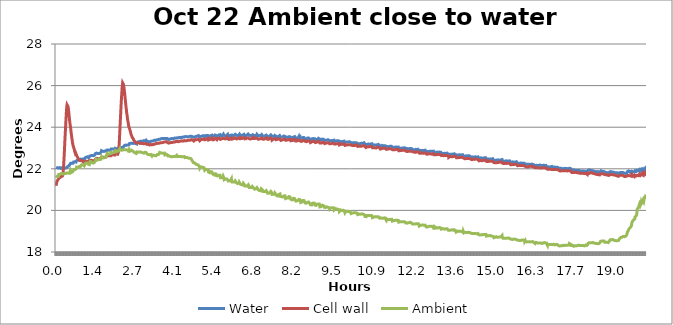
| Category | Water | Cell wall | Ambient |
|---|---|---|---|
| 0.0015688980555555556 | 22.075 | 21.183 | 21.584 |
| 0.00782350138888889 | 22.07 | 21.248 | 21.584 |
| 0.014582213333333333 | 22.067 | 21.281 | 21.612 |
| 0.021356179999999975 | 22.062 | 21.346 | 21.612 |
| 0.02819274388888889 | 22.073 | 21.369 | 21.623 |
| 0.035027722222222224 | 22.047 | 21.402 | 21.638 |
| 0.041801709444444446 | 22.049 | 21.423 | 21.633 |
| 0.048545142500000006 | 22.049 | 21.423 | 21.641 |
| 0.05536494166666667 | 22.062 | 21.431 | 21.656 |
| 0.06215420833333333 | 22.056 | 21.473 | 21.612 |
| 0.06900455694444445 | 22.043 | 21.491 | 21.628 |
| 0.07573269305555556 | 22.044 | 21.509 | 21.631 |
| 0.08253722083333334 | 22.035 | 21.504 | 21.654 |
| 0.08931122805555555 | 22.04 | 21.52 | 21.727 |
| 0.09613239083333334 | 22.046 | 21.537 | 21.683 |
| 0.1029216488888889 | 22.064 | 21.551 | 21.714 |
| 0.10975673166666666 | 22.045 | 21.539 | 21.685 |
| 0.11651543166666667 | 22.054 | 21.546 | 21.716 |
| 0.12330468083333335 | 22.058 | 21.564 | 21.706 |
| 0.13009392916666668 | 22.055 | 21.566 | 21.727 |
| 0.13691374027777778 | 22.064 | 21.588 | 21.748 |
| 0.14376409777777777 | 22.06 | 21.569 | 21.75 |
| 0.15049225388888887 | 22.062 | 21.591 | 21.761 |
| 0.1572968027777775 | 22.046 | 21.595 | 21.773 |
| 0.16414852138888888 | 22.02 | 21.604 | 21.768 |
| 0.17093777444444444 | 22.041 | 21.618 | 21.771 |
| 0.17771176527777777 | 22.038 | 21.626 | 21.768 |
| 0.1844551841666664 | 22.033 | 21.624 | 21.768 |
| 0.19130553527777777 | 22.032 | 21.632 | 21.786 |
| 0.19807951694444417 | 22.05 | 21.626 | 21.749 |
| 0.2049146075 | 22.05 | 21.615 | 21.801 |
| 0.21167330194444442 | 22.04 | 21.654 | 21.77 |
| 0.21849310027777777 | 22.021 | 21.653 | 21.744 |
| 0.22525180277777776 | 22.031 | 21.68 | 21.778 |
| 0.23207299861111083 | 22.018 | 21.72 | 21.765 |
| 0.23890808166666666 | 22.013 | 21.784 | 21.757 |
| 0.24569733166666638 | 22.008 | 21.885 | 21.754 |
| 0.25245603694444446 | 22.026 | 22.037 | 21.749 |
| 0.2592605647222222 | 22.038 | 22.185 | 21.765 |
| 0.26609564138888886 | 22.036 | 22.364 | 21.762 |
| 0.2728696216666664 | 22.036 | 22.512 | 21.754 |
| 0.2796894411111111 | 22.026 | 22.717 | 21.765 |
| 0.28649396694444446 | 22.029 | 22.913 | 21.759 |
| 0.29328331416666664 | 22.026 | 23.127 | 21.77 |
| 0.30007385166666667 | 22.031 | 23.334 | 21.759 |
| 0.30686310527777777 | 22.047 | 23.531 | 21.785 |
| 0.3136676241666667 | 22.049 | 23.709 | 21.772 |
| 0.32050271027777777 | 22.042 | 23.893 | 21.765 |
| 0.32726142555555554 | 22.042 | 24.082 | 21.77 |
| 0.33406593888888886 | 22.034 | 24.268 | 21.772 |
| 0.3408857527777778 | 22.039 | 24.439 | 21.775 |
| 0.34762917444444447 | 22.067 | 24.617 | 21.798 |
| 0.35441843083333335 | 22.07 | 24.783 | 21.795 |
| 0.36126878972222226 | 22.07 | 24.919 | 21.808 |
| 0.3680288683333333 | 22.06 | 25.005 | 21.793 |
| 0.37483339777777774 | 22.091 | 25.079 | 21.803 |
| 0.3816379294444444 | 22.083 | 25.125 | 21.819 |
| 0.38841192611111114 | 22.096 | 25.107 | 21.811 |
| 0.3952317125 | 22.104 | 25.082 | 21.798 |
| 0.40195987027777774 | 22.111 | 25.051 | 21.785 |
| 0.4088102191666667 | 22.106 | 24.995 | 21.788 |
| 0.41561475194444447 | 22.116 | 24.921 | 21.793 |
| 0.422388725 | 22.147 | 24.86 | 21.801 |
| 0.4292085408333333 | 22.139 | 24.76 | 21.816 |
| 0.4359838988888889 | 22.129 | 24.681 | 21.814 |
| 0.44280370694444443 | 22.157 | 24.582 | 21.79 |
| 0.44957768388888886 | 22.157 | 24.495 | 21.821 |
| 0.45639748305555555 | 22.16 | 24.398 | 21.785 |
| 0.4631714613888889 | 22.165 | 24.309 | 21.801 |
| 0.46999126305555555 | 22.165 | 24.227 | 21.78 |
| 0.47676524111111107 | 22.217 | 24.185 | 21.862 |
| 0.4836003294444444 | 22.209 | 24.09 | 21.872 |
| 0.4903743013888889 | 22.265 | 24.032 | 21.93 |
| 0.49714827777777776 | 22.268 | 23.963 | 21.932 |
| 0.5039694702777778 | 22.275 | 23.866 | 21.917 |
| 0.5107740016666666 | 22.269 | 23.773 | 21.932 |
| 0.5175479813888889 | 22.253 | 23.69 | 21.898 |
| 0.5243372427777778 | 22.235 | 23.62 | 21.828 |
| 0.5311723083333333 | 22.256 | 23.557 | 21.843 |
| 0.5379768363888889 | 22.262 | 23.48 | 21.805 |
| 0.5447966475 | 22.233 | 23.422 | 21.81 |
| 0.5515706205555556 | 22.248 | 23.366 | 21.823 |
| 0.5583446075 | 22.24 | 23.272 | 21.825 |
| 0.5651338605555556 | 22.278 | 23.231 | 21.859 |
| 0.5719550447222223 | 22.258 | 23.182 | 21.853 |
| 0.5787595808333333 | 22.263 | 23.121 | 21.864 |
| 0.5855793852777778 | 22.292 | 23.095 | 21.903 |
| 0.5923228105555556 | 22.293 | 23.073 | 21.914 |
| 0.5991120758333334 | 22.329 | 23.039 | 21.949 |
| 0.6059318708333333 | 22.343 | 23.026 | 21.933 |
| 0.6127822222222222 | 22.335 | 22.964 | 21.967 |
| 0.6195561980555556 | 22.343 | 22.947 | 21.98 |
| 0.6263301805555556 | 22.34 | 22.908 | 21.982 |
| 0.6331347024999999 | 22.345 | 22.839 | 21.985 |
| 0.6399545183333333 | 22.335 | 22.829 | 21.98 |
| 0.6466993202777778 | 22.338 | 22.799 | 21.967 |
| 0.6535038536111111 | 22.335 | 22.76 | 21.97 |
| 0.6603389305555556 | 22.338 | 22.719 | 21.972 |
| 0.6671281891666667 | 22.348 | 22.712 | 21.98 |
| 0.6738716155555556 | 22.332 | 22.68 | 21.969 |
| 0.6806914233333334 | 22.323 | 22.641 | 21.945 |
| 0.6875112363888889 | 22.326 | 22.616 | 21.971 |
| 0.6943157755555556 | 22.382 | 22.668 | 22.027 |
| 0.7010897277777778 | 22.416 | 22.652 | 22.084 |
| 0.7078956550000001 | 22.4 | 22.619 | 22.077 |
| 0.7146696319444444 | 22.405 | 22.583 | 22.069 |
| 0.7215047113888888 | 22.41 | 22.596 | 22.079 |
| 0.7282787122222222 | 22.408 | 22.568 | 22.082 |
| 0.7350526725 | 22.418 | 22.547 | 22.066 |
| 0.7418724572222223 | 22.413 | 22.527 | 22.071 |
| 0.7486617244444445 | 22.41 | 22.519 | 22.087 |
| 0.7554509880555556 | 22.408 | 22.501 | 22.077 |
| 0.7622707813888889 | 22.405 | 22.486 | 22.087 |
| 0.7690447647222223 | 22.413 | 22.46 | 22.084 |
| 0.7758659566666667 | 22.426 | 22.448 | 22.1 |
| 0.7826399244444445 | 22.408 | 22.471 | 22.105 |
| 0.7894597311111111 | 22.403 | 22.438 | 22.118 |
| 0.7962795433333333 | 22.421 | 22.407 | 22.089 |
| 0.803022975 | 22.408 | 22.42 | 22.136 |
| 0.8097969466666667 | 22.387 | 22.4 | 22.087 |
| 0.8166778647222223 | 22.401 | 22.368 | 22.097 |
| 0.8234823705555555 | 22.395 | 22.38 | 22.081 |
| 0.8302563627777777 | 22.387 | 22.36 | 22.083 |
| 0.8370608897222223 | 22.439 | 22.394 | 22.141 |
| 0.8438654097222221 | 22.465 | 22.413 | 22.175 |
| 0.8506407724999999 | 22.476 | 22.416 | 22.188 |
| 0.8574147469444444 | 22.46 | 22.388 | 22.165 |
| 0.8642040255555556 | 22.478 | 22.403 | 22.173 |
| 0.8710544063888889 | 22.488 | 22.383 | 22.188 |
| 0.8778894580555555 | 22.476 | 22.398 | 22.201 |
| 0.884648166388889 | 22.463 | 22.362 | 22.185 |
| 0.8914221302777778 | 22.481 | 22.357 | 22.201 |
| 0.8982572041666667 | 22.473 | 22.36 | 22.188 |
| 0.9050311852777778 | 22.465 | 22.36 | 22.18 |
| 0.9118357147222222 | 22.47 | 22.36 | 22.193 |
| 0.9186110891666667 | 22.488 | 22.352 | 22.188 |
| 0.9253850527777778 | 22.47 | 22.344 | 22.188 |
| 0.9322048619444445 | 22.483 | 22.344 | 22.19 |
| 0.9389635783333333 | 22.478 | 22.329 | 22.198 |
| 0.9457833697222222 | 22.46 | 22.341 | 22.172 |
| 0.95260321 | 22.474 | 22.328 | 22.151 |
| 0.9594382613888889 | 22.469 | 22.307 | 22.141 |
| 0.9661816813888889 | 22.461 | 22.321 | 22.128 |
| 0.9730167616666666 | 22.47 | 22.335 | 22.144 |
| 0.9797907330555555 | 22.472 | 22.318 | 22.177 |
| 0.9865660986111111 | 22.482 | 22.323 | 22.18 |
| 0.9933859147222222 | 22.53 | 22.357 | 22.252 |
| 1.0007695252777777 | 22.548 | 22.366 | 22.261 |
| 1.0069796880555555 | 22.559 | 22.379 | 22.273 |
| 1.0137536694444444 | 22.553 | 22.376 | 22.273 |
| 1.0205276491666666 | 22.559 | 22.381 | 22.278 |
| 1.027316919722222 | 22.551 | 22.356 | 22.266 |
| 1.0341214355555555 | 22.564 | 22.364 | 22.284 |
| 1.0409412422222222 | 22.559 | 22.351 | 22.271 |
| 1.0477915833333333 | 22.553 | 22.364 | 22.258 |
| 1.054536411111111 | 22.553 | 22.364 | 22.286 |
| 1.0613714819444444 | 22.553 | 22.369 | 22.268 |
| 1.0681454594444444 | 22.574 | 22.346 | 22.284 |
| 1.0749958227777778 | 22.579 | 22.351 | 22.273 |
| 1.0817850691666666 | 22.567 | 22.349 | 22.289 |
| 1.0885743252777778 | 22.565 | 22.326 | 22.234 |
| 1.095348306388889 | 22.545 | 22.352 | 22.224 |
| 1.1021528366666666 | 22.533 | 22.342 | 22.203 |
| 1.1089268027777777 | 22.529 | 22.312 | 22.219 |
| 1.1157021827777778 | 22.546 | 22.34 | 22.206 |
| 1.1225219744444443 | 22.531 | 22.32 | 22.19 |
| 1.129341791388889 | 22.552 | 22.333 | 22.19 |
| 1.1361157586111112 | 22.544 | 22.333 | 22.203 |
| 1.142905021388889 | 22.562 | 22.355 | 22.25 |
| 1.1496790024999972 | 22.613 | 22.376 | 22.307 |
| 1.1564682569444444 | 22.657 | 22.411 | 22.333 |
| 1.1633033247222222 | 22.647 | 22.398 | 22.359 |
| 1.1700773027777778 | 22.647 | 22.406 | 22.341 |
| 1.1769276594444444 | 22.647 | 22.395 | 22.321 |
| 1.1837169147222222 | 22.647 | 22.413 | 22.341 |
| 1.1905228266666668 | 22.631 | 22.411 | 22.356 |
| 1.1972968138888862 | 22.652 | 22.411 | 22.338 |
| 1.2040555141666667 | 22.659 | 22.393 | 22.341 |
| 1.2108447916666667 | 22.667 | 22.393 | 22.333 |
| 1.217679843888889 | 22.658 | 22.389 | 22.331 |
| 1.224484366388889 | 22.646 | 22.4 | 22.305 |
| 1.231319474722222 | 22.642 | 22.381 | 22.286 |
| 1.2381087097222223 | 22.635 | 22.39 | 22.278 |
| 1.24489797 | 22.629 | 22.382 | 22.258 |
| 1.2516719377777752 | 22.637 | 22.382 | 22.261 |
| 1.2584473013888888 | 22.64 | 22.385 | 22.266 |
| 1.265236555 | 22.632 | 22.4 | 22.276 |
| 1.2720869191666666 | 22.629 | 22.37 | 22.278 |
| 1.2788608852777779 | 22.657 | 22.388 | 22.266 |
| 1.2856654252777777 | 22.635 | 22.385 | 22.291 |
| 1.2924393972222221 | 22.637 | 22.4 | 22.289 |
| 1.2992286588888888 | 22.647 | 22.385 | 22.296 |
| 1.3060790072222221 | 22.635 | 22.377 | 22.286 |
| 1.3128529816666665 | 22.655 | 22.38 | 22.314 |
| 1.3196422438888888 | 22.652 | 22.395 | 22.281 |
| 1.3264634291666668 | 22.65 | 22.398 | 22.294 |
| 1.3332374180555555 | 22.673 | 22.415 | 22.325 |
| 1.3400266677777777 | 22.729 | 22.433 | 22.4 |
| 1.3468159219444444 | 22.719 | 22.464 | 22.411 |
| 1.3536204777777752 | 22.748 | 22.474 | 22.429 |
| 1.360424986111111 | 22.747 | 22.486 | 22.447 |
| 1.3672295063888888 | 22.742 | 22.478 | 22.465 |
| 1.374003474722222 | 22.752 | 22.478 | 22.495 |
| 1.3808538380555557 | 22.759 | 22.487 | 22.46 |
| 1.3876583636111084 | 22.745 | 22.505 | 22.457 |
| 1.3944642833333334 | 22.753 | 22.464 | 22.433 |
| 1.4012382591666668 | 22.73 | 22.476 | 22.415 |
| 1.408012251111111 | 22.74 | 22.476 | 22.43 |
| 1.4148344780555555 | 22.72 | 22.47 | 22.418 |
| 1.4216212966666666 | 22.738 | 22.478 | 22.425 |
| 1.4284258255555555 | 22.725 | 22.486 | 22.433 |
| 1.4351998099999999 | 22.74 | 22.468 | 22.443 |
| 1.4420043347222196 | 22.743 | 22.496 | 22.448 |
| 1.4487783447222222 | 22.743 | 22.465 | 22.443 |
| 1.4555536699999974 | 22.748 | 22.47 | 22.448 |
| 1.4624193044444445 | 22.735 | 22.483 | 22.438 |
| 1.4691780169444446 | 22.735 | 22.483 | 22.451 |
| 1.4760283608333333 | 22.766 | 22.468 | 22.456 |
| 1.482756513888886 | 22.751 | 22.463 | 22.451 |
| 1.4895763208333335 | 22.748 | 22.481 | 22.446 |
| 1.49636558 | 22.766 | 22.473 | 22.451 |
| 1.503170106388889 | 22.748 | 22.493 | 22.446 |
| 1.5099441594444418 | 22.763 | 22.473 | 22.446 |
| 1.5168097049999973 | 22.746 | 22.473 | 22.456 |
| 1.523583688888889 | 22.753 | 22.488 | 22.461 |
| 1.5303896222222195 | 22.782 | 22.505 | 22.5 |
| 1.5371483013888887 | 22.809 | 22.52 | 22.529 |
| 1.5439375638888888 | 22.836 | 22.542 | 22.555 |
| 1.550772642222222 | 22.871 | 22.564 | 22.583 |
| 1.5575771747222222 | 22.864 | 22.572 | 22.571 |
| 1.564351153611111 | 22.846 | 22.584 | 22.583 |
| 1.571125123611111 | 22.824 | 22.555 | 22.526 |
| 1.5779143736111083 | 22.843 | 22.555 | 22.519 |
| 1.5847647394444417 | 22.834 | 22.548 | 22.508 |
| 1.5914942797222196 | 22.839 | 22.553 | 22.526 |
| 1.5982987994444418 | 22.836 | 22.556 | 22.518 |
| 1.6051186175 | 22.846 | 22.574 | 22.513 |
| 1.6119078608333333 | 22.828 | 22.559 | 22.521 |
| 1.6187582363888888 | 22.839 | 22.546 | 22.529 |
| 1.6254558280555553 | 22.836 | 22.553 | 22.529 |
| 1.6323367380555556 | 22.836 | 22.556 | 22.531 |
| 1.6391107030555556 | 22.839 | 22.566 | 22.544 |
| 1.6458999597222221 | 22.818 | 22.569 | 22.541 |
| 1.6527350522222224 | 22.821 | 22.551 | 22.536 |
| 1.6595395669444444 | 22.836 | 22.556 | 22.526 |
| 1.666314932777775 | 22.821 | 22.553 | 22.549 |
| 1.6730889033333307 | 22.857 | 22.566 | 22.546 |
| 1.679862885 | 22.844 | 22.551 | 22.559 |
| 1.6866979702777778 | 22.826 | 22.576 | 22.534 |
| 1.6934719411111083 | 22.851 | 22.559 | 22.559 |
| 1.7003528541666666 | 22.836 | 22.569 | 22.569 |
| 1.7070810069444444 | 22.834 | 22.564 | 22.595 |
| 1.713931355 | 22.845 | 22.568 | 22.603 |
| 1.7207053402777779 | 22.858 | 22.578 | 22.611 |
| 1.7275098711111083 | 22.894 | 22.608 | 22.675 |
| 1.7342852333333334 | 22.903 | 22.612 | 22.694 |
| 1.7410592077777751 | 22.916 | 22.643 | 22.712 |
| 1.7478637358333307 | 22.926 | 22.656 | 22.735 |
| 1.7546377144444445 | 22.907 | 22.635 | 22.717 |
| 1.7614422413888888 | 22.906 | 22.639 | 22.693 |
| 1.7682467791666667 | 22.904 | 22.626 | 22.693 |
| 1.7750360263888887 | 22.906 | 22.634 | 22.698 |
| 1.7818863780555554 | 22.906 | 22.634 | 22.711 |
| 1.7886757355555556 | 22.891 | 22.636 | 22.703 |
| 1.7954954569444446 | 22.909 | 22.634 | 22.706 |
| 1.8022709058333306 | 22.901 | 22.626 | 22.688 |
| 1.8090295291666667 | 22.894 | 22.636 | 22.691 |
| 1.8158034922222221 | 22.891 | 22.621 | 22.701 |
| 1.8226232841666665 | 22.899 | 22.624 | 22.706 |
| 1.8294889358333333 | 22.896 | 22.621 | 22.716 |
| 1.8362170794444417 | 22.888 | 22.624 | 22.701 |
| 1.8431132527777776 | 22.896 | 22.624 | 22.708 |
| 1.8498566891666666 | 22.899 | 22.619 | 22.706 |
| 1.8566306583333332 | 22.901 | 22.631 | 22.719 |
| 1.863404638888889 | 22.899 | 22.624 | 22.701 |
| 1.870241106111111 | 22.9 | 22.623 | 22.734 |
| 1.8770150858333332 | 22.953 | 22.673 | 22.787 |
| 1.8838348908333307 | 22.95 | 22.68 | 22.818 |
| 1.8906088780555557 | 22.986 | 22.694 | 22.831 |
| 1.8974134091666666 | 22.974 | 22.686 | 22.833 |
| 1.9042179269444444 | 22.946 | 22.69 | 22.776 |
| 1.9110224883333333 | 22.941 | 22.666 | 22.779 |
| 1.9177658941666667 | 22.948 | 22.661 | 22.766 |
| 1.9245704202777778 | 22.956 | 22.673 | 22.779 |
| 1.9314054911111112 | 22.936 | 22.673 | 22.781 |
| 1.9381808530555558 | 22.933 | 22.679 | 22.776 |
| 1.9449701169444442 | 22.938 | 22.661 | 22.779 |
| 1.9517746413888888 | 22.954 | 22.668 | 22.804 |
| 1.9585486247222221 | 22.948 | 22.684 | 22.779 |
| 1.9653989730555557 | 22.926 | 22.666 | 22.791 |
| 1.972172948611111 | 22.931 | 22.651 | 22.789 |
| 1.978977531111111 | 22.926 | 22.681 | 22.784 |
| 1.9857972797222223 | 22.928 | 22.658 | 22.802 |
| 1.9926018249999973 | 22.918 | 22.676 | 22.802 |
| 1.999391066111111 | 22.926 | 22.663 | 22.807 |
| 2.0061969919444445 | 22.919 | 22.66 | 22.766 |
| 2.0130015186111083 | 22.949 | 22.693 | 22.813 |
| 2.0197602119444444 | 22.984 | 22.732 | 22.867 |
| 2.026534192777775 | 22.998 | 22.721 | 22.904 |
| 2.0333387283333306 | 23.002 | 22.731 | 22.88 |
| 2.0400821525 | 22.991 | 22.73 | 22.842 |
| 2.046963056666667 | 22.983 | 22.716 | 22.836 |
| 2.0537370325 | 22.983 | 22.695 | 22.816 |
| 2.0605415774999973 | 22.955 | 22.708 | 22.811 |
| 2.067346096111111 | 22.97 | 22.721 | 22.841 |
| 2.0741367519444442 | 22.975 | 22.713 | 22.831 |
| 2.080895486388889 | 22.975 | 22.711 | 22.841 |
| 2.0877305169444416 | 22.983 | 22.711 | 22.846 |
| 2.0945350419444417 | 22.952 | 22.718 | 22.864 |
| 2.1013395780555526 | 22.978 | 22.698 | 22.862 |
| 2.1081135605555557 | 22.96 | 22.705 | 22.867 |
| 2.1149333536111112 | 22.957 | 22.703 | 22.844 |
| 2.1216920594444444 | 22.96 | 22.726 | 22.857 |
| 2.1285118699999974 | 22.96 | 22.795 | 22.846 |
| 2.135331668055553 | 22.96 | 22.836 | 22.857 |
| 2.142091763611111 | 22.947 | 22.953 | 22.844 |
| 2.1489268397222197 | 22.947 | 23.065 | 22.851 |
| 2.1557313674999974 | 22.955 | 23.236 | 22.859 |
| 2.162520618611111 | 22.945 | 23.41 | 22.879 |
| 2.169309871388886 | 23.022 | 23.625 | 22.947 |
| 2.1760991402777776 | 23.006 | 23.82 | 22.883 |
| 2.182888400555553 | 23.023 | 24.017 | 22.952 |
| 2.1897081808333336 | 23.016 | 24.231 | 22.94 |
| 2.19645162 | 23.017 | 24.424 | 22.901 |
| 2.203378344722222 | 23.028 | 24.621 | 22.888 |
| 2.2101231575 | 23.017 | 24.812 | 22.899 |
| 2.2168665880555554 | 23.007 | 25.003 | 22.901 |
| 2.223686393611111 | 23.033 | 25.197 | 22.911 |
| 2.2304603730555557 | 23.023 | 25.355 | 22.899 |
| 2.237295446944444 | 23.012 | 25.521 | 22.894 |
| 2.2440541599999975 | 23.012 | 25.674 | 22.904 |
| 2.2508434116666667 | 23.025 | 25.843 | 22.911 |
| 2.2576326769444446 | 23.023 | 25.97 | 22.909 |
| 2.2644524605555554 | 23.04 | 26.047 | 22.914 |
| 2.2712722724999974 | 23.023 | 26.134 | 22.909 |
| 2.2781073491666666 | 23.04 | 26.123 | 22.904 |
| 2.2848827238888862 | 23.033 | 26.141 | 22.911 |
| 2.2916108594444444 | 23.038 | 26.093 | 22.909 |
| 2.2984459411111082 | 23.066 | 26.065 | 22.909 |
| 2.3052657436111113 | 23.04 | 26.006 | 22.899 |
| 2.312039726111111 | 23.065 | 25.949 | 22.927 |
| 2.318844263888889 | 23.08 | 25.88 | 22.92 |
| 2.325618239166667 | 23.113 | 25.82 | 22.915 |
| 2.3324380444444417 | 23.144 | 25.72 | 22.939 |
| 2.339212034444442 | 23.129 | 25.655 | 22.874 |
| 2.3460179283333336 | 23.134 | 25.543 | 22.872 |
| 2.352791915 | 23.123 | 25.451 | 22.908 |
| 2.3596270833333306 | 23.129 | 25.336 | 22.915 |
| 2.3664926261111114 | 23.139 | 25.27 | 22.908 |
| 2.3732207741666667 | 23.134 | 25.165 | 22.897 |
| 2.3799947711111082 | 23.139 | 25.076 | 22.9 |
| 2.386768728888889 | 23.144 | 24.977 | 22.913 |
| 2.3936038063888887 | 23.149 | 24.887 | 22.918 |
| 2.400408333888889 | 23.146 | 24.834 | 22.92 |
| 2.407182312777775 | 23.136 | 24.721 | 22.923 |
| 2.4140035125 | 23.149 | 24.658 | 22.918 |
| 2.420777488611111 | 23.149 | 24.599 | 22.91 |
| 2.427582009166664 | 23.151 | 24.522 | 22.918 |
| 2.4343712655555554 | 23.146 | 24.453 | 22.902 |
| 2.441221621388889 | 23.146 | 24.374 | 22.892 |
| 2.4479956958333333 | 23.146 | 24.321 | 22.9 |
| 2.4548001372222195 | 23.144 | 24.26 | 22.88 |
| 2.4615588380555526 | 23.167 | 24.206 | 22.872 |
| 2.468409192222222 | 23.168 | 24.155 | 22.884 |
| 2.4751984480555556 | 23.164 | 24.087 | 22.859 |
| 2.481943261666664 | 23.185 | 24.06 | 22.887 |
| 2.4887630644444445 | 23.152 | 23.992 | 22.789 |
| 2.495537052222222 | 23.18 | 23.983 | 22.859 |
| 2.5023721227777775 | 23.213 | 23.964 | 22.917 |
| 2.509161376388886 | 23.222 | 23.927 | 22.891 |
| 2.5159353488888887 | 23.212 | 23.893 | 22.886 |
| 2.522770432499997 | 23.24 | 23.845 | 22.876 |
| 2.5295749761111086 | 23.219 | 23.822 | 22.86 |
| 2.536333667222219 | 23.227 | 23.789 | 22.883 |
| 2.543107653888889 | 23.229 | 23.751 | 22.848 |
| 2.5499732863888886 | 23.227 | 23.707 | 22.853 |
| 2.5567333602777778 | 23.242 | 23.687 | 22.886 |
| 2.5635684433333306 | 23.214 | 23.638 | 22.899 |
| 2.5703424261111083 | 23.214 | 23.638 | 22.896 |
| 2.5771316825 | 23.234 | 23.6 | 22.886 |
| 2.5839056605555557 | 23.229 | 23.567 | 22.868 |
| 2.590710195277778 | 23.237 | 23.541 | 22.878 |
| 2.597484158888886 | 23.24 | 23.523 | 22.881 |
| 2.604319243055553 | 23.234 | 23.5 | 22.878 |
| 2.611108494722222 | 23.217 | 23.483 | 22.86 |
| 2.6179588394444444 | 23.222 | 23.46 | 22.86 |
| 2.6247189358333336 | 23.219 | 23.47 | 22.86 |
| 2.6315234697222194 | 23.222 | 23.447 | 22.855 |
| 2.6382975405555555 | 23.217 | 23.419 | 22.832 |
| 2.6450714269444418 | 23.234 | 23.391 | 22.825 |
| 2.651891222777775 | 23.234 | 23.398 | 22.802 |
| 2.658711029166664 | 23.219 | 23.391 | 22.817 |
| 2.6655003002777775 | 23.232 | 23.365 | 22.802 |
| 2.672274261111111 | 23.242 | 23.342 | 22.791 |
| 2.679094068888889 | 23.234 | 23.327 | 22.802 |
| 2.6858541622222196 | 23.24 | 23.304 | 22.779 |
| 2.6927197855555556 | 23.227 | 23.317 | 22.769 |
| 2.6994937691666667 | 23.233 | 23.291 | 22.74 |
| 2.706252467777775 | 23.223 | 23.277 | 22.763 |
| 2.7131028269444446 | 23.216 | 23.263 | 22.735 |
| 2.7198768141666667 | 23.228 | 23.259 | 22.743 |
| 2.726681423611111 | 23.203 | 23.274 | 22.732 |
| 2.733455307222222 | 23.238 | 23.253 | 22.74 |
| 2.7402140147222194 | 23.208 | 23.241 | 22.734 |
| 2.747049093888886 | 23.196 | 23.249 | 22.765 |
| 2.7538702847222223 | 23.267 | 23.275 | 22.809 |
| 2.760674812777778 | 23.251 | 23.255 | 22.809 |
| 2.7674487980555527 | 23.22 | 23.238 | 22.773 |
| 2.7742227755555557 | 23.291 | 23.263 | 22.823 |
| 2.7810273038888886 | 23.257 | 23.242 | 22.776 |
| 2.787862385 | 23.286 | 23.24 | 22.792 |
| 2.7946363566666665 | 23.294 | 23.26 | 22.792 |
| 2.8014103400000003 | 23.281 | 23.245 | 22.777 |
| 2.808260693888889 | 23.292 | 23.239 | 22.823 |
| 2.815034676666667 | 23.302 | 23.259 | 22.813 |
| 2.821869751111111 | 23.312 | 23.252 | 22.818 |
| 2.8286146311111113 | 23.315 | 23.254 | 22.811 |
| 2.8353885463888893 | 23.301 | 23.247 | 22.81 |
| 2.842254164444445 | 23.285 | 23.229 | 22.803 |
| 2.84902815 | 23.313 | 23.221 | 22.805 |
| 2.8558174016666666 | 23.315 | 23.229 | 22.793 |
| 2.8626830386111113 | 23.3 | 23.221 | 22.808 |
| 2.869426457222222 | 23.315 | 23.234 | 22.823 |
| 2.8762004411111115 | 23.325 | 23.231 | 22.813 |
| 2.8830507944444443 | 23.317 | 23.226 | 22.808 |
| 2.8898247772222225 | 23.323 | 23.234 | 22.808 |
| 2.896630694166667 | 23.325 | 23.224 | 22.816 |
| 2.9034046725000002 | 23.31 | 23.224 | 22.806 |
| 2.910193925833333 | 23.325 | 23.231 | 22.79 |
| 2.9169679841666665 | 23.328 | 23.221 | 22.788 |
| 2.9237877052777774 | 23.328 | 23.219 | 22.798 |
| 2.9305616825 | 23.33 | 23.206 | 22.788 |
| 2.9373662141666665 | 23.34 | 23.219 | 22.783 |
| 2.944216556666667 | 23.348 | 23.216 | 22.795 |
| 2.9509905575 | 23.328 | 23.208 | 22.775 |
| 2.9577950730555553 | 23.317 | 23.208 | 22.775 |
| 2.96461626 | 23.338 | 23.211 | 22.788 |
| 2.9713749830555556 | 23.33 | 23.226 | 22.8 |
| 2.9781336683333333 | 23.328 | 23.224 | 22.798 |
| 2.9849840461111112 | 23.353 | 23.208 | 22.744 |
| 2.991758006111111 | 23.343 | 23.211 | 22.757 |
| 2.998562535277778 | 23.353 | 23.214 | 22.752 |
| 3.0053976152777775 | 23.323 | 23.229 | 22.785 |
| 3.0121410324999998 | 23.353 | 23.221 | 22.788 |
| 3.018930319722222 | 23.366 | 23.208 | 22.785 |
| 3.0257654016666664 | 23.338 | 23.208 | 22.795 |
| 3.032510188888889 | 23.346 | 23.196 | 22.79 |
| 3.0393300033333333 | 23.326 | 23.19 | 22.798 |
| 3.0461192419444445 | 23.353 | 23.191 | 22.816 |
| 3.0528932216666664 | 23.339 | 23.203 | 22.805 |
| 3.0597435902777774 | 23.369 | 23.221 | 22.803 |
| 3.066532839166667 | 23.366 | 23.216 | 22.813 |
| 3.073306818888889 | 23.376 | 23.219 | 22.813 |
| 3.080126616388889 | 23.339 | 23.218 | 22.772 |
| 3.086931140555556 | 23.35 | 23.207 | 22.754 |
| 3.0937065091666667 | 23.34 | 23.212 | 22.754 |
| 3.100511035833333 | 23.35 | 23.199 | 22.741 |
| 3.1073155722222223 | 23.318 | 23.171 | 22.71 |
| 3.114150643611111 | 23.337 | 23.186 | 22.748 |
| 3.1209246330555556 | 23.292 | 23.156 | 22.694 |
| 3.127698605833333 | 23.328 | 23.194 | 22.712 |
| 3.1345031380555555 | 23.341 | 23.183 | 22.707 |
| 3.1412771108333337 | 23.303 | 23.16 | 22.663 |
| 3.1481274947222224 | 23.31 | 23.184 | 22.684 |
| 3.154901448888889 | 23.288 | 23.157 | 22.652 |
| 3.161705996666667 | 23.295 | 23.165 | 22.645 |
| 3.1684813369444442 | 23.293 | 23.157 | 22.65 |
| 3.1752553316666665 | 23.293 | 23.165 | 22.658 |
| 3.182059845 | 23.308 | 23.147 | 22.678 |
| 3.1888949216666664 | 23.298 | 23.147 | 22.673 |
| 3.195668917222222 | 23.311 | 23.165 | 22.703 |
| 3.202412330277778 | 23.313 | 23.155 | 22.711 |
| 3.2092474141666667 | 23.311 | 23.167 | 22.716 |
| 3.2160824988888885 | 23.308 | 23.167 | 22.709 |
| 3.2228717405555556 | 23.305 | 23.165 | 22.678 |
| 3.2296471077777777 | 23.321 | 23.172 | 22.691 |
| 3.2364516397222225 | 23.321 | 23.167 | 22.691 |
| 3.2432561672222224 | 23.318 | 23.183 | 22.691 |
| 3.250014882222222 | 23.318 | 23.185 | 22.66 |
| 3.2568194002777777 | 23.328 | 23.195 | 22.678 |
| 3.263654486111111 | 23.318 | 23.157 | 22.647 |
| 3.270428454444444 | 23.331 | 23.152 | 22.614 |
| 3.2772177105555556 | 23.339 | 23.19 | 22.642 |
| 3.284052798611111 | 23.333 | 23.172 | 22.614 |
| 3.2908115158333335 | 23.341 | 23.172 | 22.663 |
| 3.297646571111111 | 23.336 | 23.185 | 22.637 |
| 3.3044372161111113 | 23.341 | 23.18 | 22.627 |
| 3.3112111919444445 | 23.333 | 23.172 | 22.627 |
| 3.3180310083333335 | 23.344 | 23.185 | 22.645 |
| 3.3248049975 | 23.359 | 23.172 | 22.652 |
| 3.3316400600000002 | 23.336 | 23.185 | 22.652 |
| 3.3384904213888893 | 23.339 | 23.18 | 22.632 |
| 3.345218567222222 | 23.333 | 23.193 | 22.624 |
| 3.3520383625 | 23.374 | 23.175 | 22.629 |
| 3.358797070277778 | 23.346 | 23.198 | 22.658 |
| 3.365572445277778 | 23.344 | 23.2 | 22.627 |
| 3.3724075269444445 | 23.354 | 23.2 | 22.629 |
| 3.379227323333333 | 23.364 | 23.188 | 22.629 |
| 3.385955478611111 | 23.385 | 23.188 | 22.609 |
| 3.392775281388889 | 23.364 | 23.206 | 22.609 |
| 3.3996103505555553 | 23.374 | 23.203 | 22.604 |
| 3.4063843269444445 | 23.369 | 23.195 | 22.609 |
| 3.413158314722222 | 23.356 | 23.188 | 22.627 |
| 3.4200086669444443 | 23.349 | 23.203 | 22.629 |
| 3.4268132397222226 | 23.385 | 23.198 | 22.65 |
| 3.4335871680555554 | 23.392 | 23.218 | 22.601 |
| 3.4403625513888887 | 23.362 | 23.208 | 22.612 |
| 3.4471365172222224 | 23.39 | 23.188 | 22.627 |
| 3.453941049166666 | 23.379 | 23.193 | 22.691 |
| 3.460760858333333 | 23.39 | 23.213 | 22.668 |
| 3.4675653816666667 | 23.39 | 23.211 | 22.665 |
| 3.4743546408333335 | 23.401 | 23.225 | 22.688 |
| 3.481143890833333 | 23.397 | 23.206 | 22.67 |
| 3.4879178708333334 | 23.419 | 23.218 | 22.722 |
| 3.4947529555555557 | 23.403 | 23.222 | 22.684 |
| 3.501588036388889 | 23.405 | 23.23 | 22.686 |
| 3.508348116666667 | 23.406 | 23.224 | 22.714 |
| 3.5151831944444445 | 23.42 | 23.227 | 22.722 |
| 3.5219571769444444 | 23.414 | 23.247 | 22.735 |
| 3.5287311575 | 23.418 | 23.247 | 22.768 |
| 3.5355662330555555 | 23.43 | 23.256 | 22.786 |
| 3.5424013175000004 | 23.45 | 23.253 | 22.781 |
| 3.54914474 | 23.415 | 23.252 | 22.784 |
| 3.5559339963888887 | 23.426 | 23.253 | 22.774 |
| 3.5627385233333335 | 23.435 | 23.263 | 22.761 |
| 3.5695124977777777 | 23.453 | 23.25 | 22.761 |
| 3.576318428611111 | 23.439 | 23.256 | 22.761 |
| 3.5830618399999996 | 23.454 | 23.263 | 22.761 |
| 3.58992748 | 23.428 | 23.258 | 22.74 |
| 3.596716732777778 | 23.454 | 23.253 | 22.756 |
| 3.603551806111111 | 23.446 | 23.273 | 22.763 |
| 3.6103257911111113 | 23.444 | 23.256 | 22.769 |
| 3.6171303330555555 | 23.446 | 23.25 | 22.756 |
| 3.623904291666667 | 23.444 | 23.278 | 22.746 |
| 3.630647715277778 | 23.454 | 23.266 | 22.733 |
| 3.6375133497222225 | 23.459 | 23.261 | 22.72 |
| 3.6443192630555554 | 23.449 | 23.276 | 22.746 |
| 3.651123798333334 | 23.449 | 23.289 | 22.751 |
| 3.657897778611111 | 23.444 | 23.281 | 22.748 |
| 3.6646564844444445 | 23.462 | 23.281 | 22.733 |
| 3.671476275555556 | 23.446 | 23.273 | 22.74 |
| 3.678250265 | 23.451 | 23.291 | 22.743 |
| 3.685054791388889 | 23.459 | 23.256 | 22.746 |
| 3.691859323888889 | 23.459 | 23.299 | 22.746 |
| 3.698694398333333 | 23.446 | 23.286 | 22.753 |
| 3.705468395833333 | 23.459 | 23.278 | 22.725 |
| 3.7122437436111113 | 23.459 | 23.299 | 22.674 |
| 3.7190482697222222 | 23.451 | 23.291 | 22.633 |
| 3.725822245 | 23.464 | 23.273 | 22.669 |
| 3.7326573205555555 | 23.456 | 23.278 | 22.689 |
| 3.739431311111111 | 23.456 | 23.294 | 22.705 |
| 3.7462816652777775 | 23.472 | 23.289 | 22.702 |
| 3.753055647777778 | 23.474 | 23.291 | 22.705 |
| 3.759844895277778 | 23.456 | 23.304 | 22.715 |
| 3.766618866388889 | 23.456 | 23.301 | 22.728 |
| 3.7734081566666666 | 23.455 | 23.289 | 22.725 |
| 3.7802293116666665 | 23.448 | 23.269 | 22.689 |
| 3.7870185672222223 | 23.456 | 23.269 | 22.696 |
| 3.793823100277778 | 23.439 | 23.269 | 22.668 |
| 3.8005970855555558 | 23.452 | 23.266 | 22.665 |
| 3.8074474636111115 | 23.414 | 23.235 | 22.613 |
| 3.8142366825 | 23.454 | 23.271 | 22.673 |
| 3.8210106680555556 | 23.445 | 23.265 | 22.65 |
| 3.8277846452777777 | 23.429 | 23.238 | 22.611 |
| 3.8345891783333332 | 23.409 | 23.245 | 22.603 |
| 3.841393793611111 | 23.401 | 23.235 | 22.598 |
| 3.848214886944444 | 23.401 | 23.225 | 22.603 |
| 3.855004154444445 | 23.414 | 23.248 | 22.603 |
| 3.861778132777778 | 23.391 | 23.25 | 22.608 |
| 3.8685826597222226 | 23.409 | 23.245 | 22.61 |
| 3.8754177247222223 | 23.419 | 23.242 | 22.615 |
| 3.8821917158333332 | 23.427 | 23.25 | 22.613 |
| 3.8889656794444445 | 23.424 | 23.26 | 22.613 |
| 3.8958160463888887 | 23.429 | 23.245 | 22.605 |
| 3.9025900211111115 | 23.449 | 23.242 | 22.587 |
| 3.9093945544444444 | 23.427 | 23.258 | 22.59 |
| 3.9161699266666665 | 23.429 | 23.265 | 22.592 |
| 3.922959176388889 | 23.447 | 23.268 | 22.592 |
| 3.9297942497222222 | 23.409 | 23.25 | 22.59 |
| 3.9365376730555557 | 23.437 | 23.268 | 22.575 |
| 3.9433727616666667 | 23.432 | 23.263 | 22.598 |
| 3.9501467302777775 | 23.437 | 23.253 | 22.575 |
| 3.9569665366666666 | 23.432 | 23.276 | 22.61 |
| 3.9638474494444447 | 23.457 | 23.265 | 22.577 |
| 3.97059087 | 23.449 | 23.273 | 22.585 |
| 3.9773648538888886 | 23.452 | 23.296 | 22.582 |
| 3.9842152133333335 | 23.447 | 23.26 | 22.577 |
| 3.9909905752777775 | 23.442 | 23.299 | 22.592 |
| 3.997764551666667 | 23.462 | 23.283 | 22.6 |
| 4.004553811388889 | 23.447 | 23.286 | 22.59 |
| 4.011358331111111 | 23.455 | 23.276 | 22.572 |
| 4.018147593888889 | 23.462 | 23.304 | 22.575 |
| 4.024921558333333 | 23.457 | 23.291 | 22.61 |
| 4.031771928055556 | 23.452 | 23.283 | 22.587 |
| 4.038545898611111 | 23.47 | 23.286 | 22.59 |
| 4.0453504375 | 23.478 | 23.283 | 22.58 |
| 4.052125792777778 | 23.48 | 23.286 | 22.58 |
| 4.058915054444444 | 23.457 | 23.286 | 22.58 |
| 4.065689042222222 | 23.457 | 23.293 | 22.603 |
| 4.0726004811111105 | 23.467 | 23.291 | 22.592 |
| 4.0793744627777775 | 23.467 | 23.299 | 22.59 |
| 4.086102619166667 | 23.472 | 23.314 | 22.575 |
| 4.092876605833333 | 23.472 | 23.288 | 22.613 |
| 4.099681119722223 | 23.457 | 23.304 | 22.623 |
| 4.1064703683333335 | 23.465 | 23.296 | 22.633 |
| 4.113305452222222 | 23.49 | 23.296 | 22.649 |
| 4.1200808122222226 | 23.49 | 23.319 | 22.636 |
| 4.126931186388889 | 23.49 | 23.319 | 22.603 |
| 4.133705150277778 | 23.472 | 23.314 | 22.59 |
| 4.140540225833333 | 23.488 | 23.301 | 22.6 |
| 4.1472989516666665 | 23.478 | 23.316 | 22.6 |
| 4.154072907222222 | 23.467 | 23.322 | 22.618 |
| 4.160846886944444 | 23.488 | 23.314 | 22.618 |
| 4.167712525833333 | 23.48 | 23.301 | 22.6 |
| 4.174501773055556 | 23.49 | 23.316 | 22.598 |
| 4.181306311111111 | 23.475 | 23.322 | 22.598 |
| 4.188081668055556 | 23.488 | 23.319 | 22.6 |
| 4.194855642777778 | 23.485 | 23.309 | 22.59 |
| 4.201644905833334 | 23.503 | 23.324 | 22.605 |
| 4.208449437222222 | 23.511 | 23.316 | 22.608 |
| 4.2152234080555555 | 23.475 | 23.311 | 22.592 |
| 4.222058523055556 | 23.493 | 23.306 | 22.6 |
| 4.2288782919444445 | 23.495 | 23.327 | 22.592 |
| 4.235636984444445 | 23.508 | 23.322 | 22.608 |
| 4.242456799166667 | 23.498 | 23.332 | 22.59 |
| 4.249261327777778 | 23.501 | 23.334 | 22.608 |
| 4.256036689166667 | 23.498 | 23.314 | 22.595 |
| 4.262810671111111 | 23.488 | 23.329 | 22.59 |
| 4.269599926666666 | 23.511 | 23.332 | 22.59 |
| 4.276450292222222 | 23.498 | 23.345 | 22.592 |
| 4.2832548161111115 | 23.495 | 23.324 | 22.587 |
| 4.2900593575 | 23.503 | 23.347 | 22.582 |
| 4.296863867222222 | 23.518 | 23.329 | 22.575 |
| 4.303653137222222 | 23.506 | 23.332 | 22.595 |
| 4.310396643888889 | 23.508 | 23.322 | 22.61 |
| 4.317201081944445 | 23.501 | 23.329 | 22.6 |
| 4.3240375525 | 23.521 | 23.332 | 22.587 |
| 4.33081153 | 23.531 | 23.329 | 22.567 |
| 4.337585498611111 | 23.506 | 23.347 | 22.58 |
| 4.344405329444444 | 23.526 | 23.337 | 22.567 |
| 4.351225112222222 | 23.508 | 23.352 | 22.595 |
| 4.35802964 | 23.516 | 23.352 | 22.58 |
| 4.364834167222222 | 23.526 | 23.339 | 22.595 |
| 4.371608143333334 | 23.526 | 23.355 | 22.61 |
| 4.378382125277778 | 23.511 | 23.337 | 22.59 |
| 4.385217195555556 | 23.521 | 23.329 | 22.549 |
| 4.391977293888889 | 23.529 | 23.342 | 22.552 |
| 4.398797100555555 | 23.511 | 23.35 | 22.539 |
| 4.405571067777778 | 23.529 | 23.342 | 22.552 |
| 4.4123603325000005 | 23.554 | 23.352 | 22.557 |
| 4.419210681666667 | 23.523 | 23.324 | 22.541 |
| 4.425984669722222 | 23.518 | 23.334 | 22.539 |
| 4.432789200277778 | 23.526 | 23.339 | 22.567 |
| 4.439563171111112 | 23.529 | 23.339 | 22.549 |
| 4.446337150833333 | 23.529 | 23.355 | 22.554 |
| 4.453141692777778 | 23.541 | 23.345 | 22.554 |
| 4.459978140833334 | 23.516 | 23.345 | 22.569 |
| 4.466752126388889 | 23.546 | 23.35 | 22.531 |
| 4.4735261161111115 | 23.531 | 23.345 | 22.562 |
| 4.480315355555556 | 23.536 | 23.36 | 22.541 |
| 4.487165716111111 | 23.531 | 23.352 | 22.554 |
| 4.493909142222222 | 23.541 | 23.367 | 22.552 |
| 4.500759576388889 | 23.536 | 23.365 | 22.562 |
| 4.507564013888889 | 23.557 | 23.355 | 22.534 |
| 4.514338001944444 | 23.554 | 23.367 | 22.531 |
| 4.521127256111111 | 23.552 | 23.36 | 22.511 |
| 4.527917893055555 | 23.546 | 23.365 | 22.534 |
| 4.534661327777777 | 23.539 | 23.367 | 22.516 |
| 4.541557503888889 | 23.541 | 23.38 | 22.521 |
| 4.548331483888889 | 23.549 | 23.35 | 22.498 |
| 4.555105459166667 | 23.559 | 23.375 | 22.501 |
| 4.561925259444444 | 23.546 | 23.339 | 22.511 |
| 4.56869924888889 | 23.552 | 23.362 | 22.513 |
| 4.575519058055556 | 23.562 | 23.37 | 22.49 |
| 4.582293021111111 | 23.564 | 23.383 | 22.493 |
| 4.5891433827777774 | 23.554 | 23.385 | 22.498 |
| 4.595872917222222 | 23.567 | 23.375 | 22.495 |
| 4.602708008333334 | 23.554 | 23.375 | 22.488 |
| 4.609497251944444 | 23.539 | 23.411 | 22.442 |
| 4.6163017816666665 | 23.562 | 23.403 | 22.462 |
| 4.623075758333333 | 23.564 | 23.385 | 22.444 |
| 4.62988029 | 23.541 | 23.395 | 22.424 |
| 4.636684814444444 | 23.557 | 23.408 | 22.442 |
| 4.6434587913888885 | 23.562 | 23.417 | 22.432 |
| 4.650263320833333 | 23.554 | 23.404 | 22.414 |
| 4.657113676944444 | 23.542 | 23.381 | 22.36 |
| 4.6638432175 | 23.556 | 23.381 | 22.393 |
| 4.6706935725 | 23.507 | 23.348 | 22.323 |
| 4.677498102777778 | 23.53 | 23.336 | 22.328 |
| 4.684272083333333 | 23.532 | 23.341 | 22.295 |
| 4.691046069444444 | 23.52 | 23.346 | 22.303 |
| 4.6978200405555555 | 23.517 | 23.338 | 22.298 |
| 4.704685667222222 | 23.532 | 23.364 | 22.308 |
| 4.711459645000001 | 23.532 | 23.376 | 22.259 |
| 4.7182489033333335 | 23.514 | 23.366 | 22.267 |
| 4.725083974444444 | 23.532 | 23.371 | 22.285 |
| 4.7318593525 | 23.525 | 23.371 | 22.265 |
| 4.738648602777777 | 23.532 | 23.392 | 22.257 |
| 4.745422595 | 23.553 | 23.394 | 22.265 |
| 4.752257661388889 | 23.535 | 23.376 | 22.259 |
| 4.759092738333333 | 23.55 | 23.381 | 22.242 |
| 4.765836175 | 23.543 | 23.397 | 22.229 |
| 4.772610139444445 | 23.537 | 23.392 | 22.244 |
| 4.779475782777778 | 23.56 | 23.392 | 22.244 |
| 4.786173374722223 | 23.558 | 23.407 | 22.236 |
| 4.792977905833333 | 23.568 | 23.392 | 22.236 |
| 4.799814365555556 | 23.56 | 23.399 | 22.208 |
| 4.8065578 | 23.545 | 23.404 | 22.203 |
| 4.813392880277778 | 23.558 | 23.404 | 22.221 |
| 4.8202432363888885 | 23.573 | 23.412 | 22.211 |
| 4.827017209166667 | 23.548 | 23.399 | 22.201 |
| 4.833852294166666 | 23.571 | 23.42 | 22.213 |
| 4.8405957158333335 | 23.576 | 23.402 | 22.193 |
| 4.8474155252777775 | 23.566 | 23.435 | 22.188 |
| 4.854220054444444 | 23.55 | 23.41 | 22.208 |
| 4.8609787566666665 | 23.596 | 23.422 | 22.201 |
| 4.867829195833333 | 23.588 | 23.415 | 22.173 |
| 4.8745739186111114 | 23.575 | 23.41 | 22.175 |
| 4.881424375277778 | 23.575 | 23.405 | 22.164 |
| 4.888137162777777 | 23.541 | 23.383 | 22.11 |
| 4.8950180619444446 | 23.549 | 23.393 | 22.108 |
| 4.901776766388888 | 23.511 | 23.348 | 22.039 |
| 4.908627111666667 | 23.514 | 23.353 | 22.049 |
| 4.915401100555556 | 23.523 | 23.38 | 22.066 |
| 4.922175095277778 | 23.541 | 23.379 | 22.097 |
| 4.9289796175000005 | 23.551 | 23.388 | 22.12 |
| 4.935754990277777 | 23.564 | 23.385 | 22.1 |
| 4.942528974166667 | 23.567 | 23.406 | 22.084 |
| 4.949348759444445 | 23.562 | 23.411 | 22.084 |
| 4.956168564722223 | 23.557 | 23.398 | 22.097 |
| 4.962942547222222 | 23.567 | 23.406 | 22.087 |
| 4.969731851944444 | 23.567 | 23.413 | 22.084 |
| 4.976582151111112 | 23.572 | 23.411 | 22.092 |
| 4.98335613 | 23.567 | 23.413 | 22.079 |
| 4.990175925555556 | 23.58 | 23.413 | 22.082 |
| 4.9969499088888885 | 23.597 | 23.426 | 22.064 |
| 5.003725266388889 | 23.595 | 23.423 | 22.077 |
| 5.010545079722222 | 23.592 | 23.426 | 22.074 |
| 5.0172885075 | 23.59 | 23.426 | 22.077 |
| 5.024123579166666 | 23.597 | 23.439 | 22.066 |
| 5.030912834722223 | 23.585 | 23.434 | 22.082 |
| 5.0377173775 | 23.585 | 23.431 | 22.053 |
| 5.044506618055556 | 23.581 | 23.431 | 22.053 |
| 5.051356971111112 | 23.589 | 23.422 | 22.042 |
| 5.0581157177777785 | 23.571 | 23.415 | 21.985 |
| 5.0649354875000006 | 23.544 | 23.394 | 21.961 |
| 5.0716955775 | 23.53 | 23.393 | 21.927 |
| 5.07846956 | 23.536 | 23.395 | 21.914 |
| 5.085274076944445 | 23.536 | 23.39 | 21.942 |
| 5.092093893333333 | 23.546 | 23.385 | 21.906 |
| 5.098898406388889 | 23.557 | 23.399 | 21.945 |
| 5.1056723858333335 | 23.591 | 23.404 | 21.959 |
| 5.112476915833333 | 23.568 | 23.422 | 21.977 |
| 5.1192508991666665 | 23.563 | 23.427 | 21.977 |
| 5.126055430277778 | 23.588 | 23.42 | 21.975 |
| 5.132859964722222 | 23.586 | 23.437 | 21.982 |
| 5.139695033888889 | 23.588 | 23.427 | 21.967 |
| 5.146470406111112 | 23.606 | 23.448 | 21.949 |
| 5.153305485833333 | 23.606 | 23.432 | 21.957 |
| 5.160110103055556 | 23.596 | 23.44 | 21.967 |
| 5.166899261666666 | 23.591 | 23.443 | 21.964 |
| 5.173627407777778 | 23.601 | 23.445 | 21.954 |
| 5.180477773055555 | 23.609 | 23.435 | 21.959 |
| 5.187282303333333 | 23.597 | 23.465 | 21.92 |
| 5.194056272777778 | 23.627 | 23.46 | 21.936 |
| 5.2008608075 | 23.531 | 23.384 | 21.843 |
| 5.207620898055556 | 23.554 | 23.389 | 21.83 |
| 5.214455992222222 | 23.529 | 23.394 | 21.807 |
| 5.2212757736111115 | 23.539 | 23.396 | 21.82 |
| 5.2280497611111105 | 23.573 | 23.386 | 21.825 |
| 5.23483901 | 23.552 | 23.406 | 21.812 |
| 5.241658814166667 | 23.55 | 23.404 | 21.812 |
| 5.248417524444444 | 23.56 | 23.427 | 21.815 |
| 5.255328973888889 | 23.578 | 23.423 | 21.823 |
| 5.262057136388889 | 23.579 | 23.418 | 21.838 |
| 5.268831113055556 | 23.588 | 23.428 | 21.852 |
| 5.275650923611112 | 23.591 | 23.434 | 21.862 |
| 5.282395725 | 23.597 | 23.441 | 21.862 |
| 5.2892002725 | 23.623 | 23.446 | 21.868 |
| 5.296035331666666 | 23.613 | 23.446 | 21.855 |
| 5.302809312777778 | 23.61 | 23.451 | 21.873 |
| 5.309659667222222 | 23.643 | 23.449 | 21.855 |
| 5.316433644444444 | 23.623 | 23.459 | 21.85 |
| 5.323284002777778 | 23.618 | 23.487 | 21.855 |
| 5.3300427 | 23.632 | 23.461 | 21.844 |
| 5.336816704166666 | 23.602 | 23.455 | 21.81 |
| 5.343576775000001 | 23.575 | 23.395 | 21.757 |
| 5.3504271325 | 23.556 | 23.397 | 21.728 |
| 5.357201104166667 | 23.561 | 23.392 | 21.72 |
| 5.364036177222222 | 23.556 | 23.392 | 21.744 |
| 5.370794905277777 | 23.561 | 23.395 | 21.72 |
| 5.3775688775 | 23.571 | 23.426 | 21.741 |
| 5.384403945277778 | 23.566 | 23.4 | 21.713 |
| 5.391177931388889 | 23.561 | 23.415 | 21.72 |
| 5.3980130025 | 23.564 | 23.415 | 21.718 |
| 5.404756425277778 | 23.584 | 23.431 | 21.718 |
| 5.4115915125 | 23.602 | 23.442 | 21.741 |
| 5.418366878611111 | 23.607 | 23.45 | 21.763 |
| 5.425186687777778 | 23.623 | 23.45 | 21.768 |
| 5.431930118611111 | 23.622 | 23.458 | 21.797 |
| 5.438765241944444 | 23.629 | 23.463 | 21.773 |
| 5.445554448888889 | 23.619 | 23.47 | 21.758 |
| 5.452343702777778 | 23.622 | 23.447 | 21.766 |
| 5.459132945833334 | 23.64 | 23.458 | 21.755 |
| 5.465937476944445 | 23.599 | 23.453 | 21.741 |
| 5.4727572858333335 | 23.547 | 23.418 | 21.668 |
| 5.479561811666667 | 23.57 | 23.431 | 21.686 |
| 5.486352455277777 | 23.562 | 23.412 | 21.65 |
| 5.493126431388888 | 23.575 | 23.399 | 21.657 |
| 5.4999767791666665 | 23.565 | 23.427 | 21.652 |
| 5.506750758888889 | 23.57 | 23.414 | 21.657 |
| 5.513555298333333 | 23.583 | 23.434 | 21.66 |
| 5.520359813888889 | 23.567 | 23.427 | 21.639 |
| 5.527133890555556 | 23.58 | 23.46 | 21.652 |
| 5.533938327222222 | 23.562 | 23.437 | 21.655 |
| 5.540727583611111 | 23.58 | 23.442 | 21.637 |
| 5.547562668055556 | 23.588 | 23.443 | 21.652 |
| 5.554276929166667 | 23.627 | 23.467 | 21.692 |
| 5.561127278611111 | 23.629 | 23.433 | 21.71 |
| 5.567901253333333 | 23.641 | 23.477 | 21.671 |
| 5.574721062222222 | 23.628 | 23.467 | 21.687 |
| 5.581525603888888 | 23.636 | 23.479 | 21.702 |
| 5.588284296111111 | 23.633 | 23.479 | 21.687 |
| 5.595119375277777 | 23.642 | 23.479 | 21.692 |
| 5.601969724444444 | 23.589 | 23.448 | 21.631 |
| 5.608743708055556 | 23.581 | 23.415 | 21.573 |
| 5.6154871463888885 | 23.566 | 23.423 | 21.573 |
| 5.622323616111111 | 23.561 | 23.405 | 21.571 |
| 5.6290517597222225 | 23.589 | 23.415 | 21.573 |
| 5.6358715675 | 23.574 | 23.433 | 21.568 |
| 5.642691357222223 | 23.581 | 23.441 | 21.573 |
| 5.649465338611111 | 23.579 | 23.436 | 21.571 |
| 5.656300418055555 | 23.579 | 23.428 | 21.568 |
| 5.663089678055556 | 23.587 | 23.428 | 21.586 |
| 5.669878929166667 | 23.602 | 23.454 | 21.573 |
| 5.6766834575 | 23.594 | 23.456 | 21.566 |
| 5.683457436944444 | 23.603 | 23.452 | 21.574 |
| 5.690293899722222 | 23.63 | 23.469 | 21.577 |
| 5.697067875555555 | 23.637 | 23.478 | 21.608 |
| 5.703872404722222 | 23.644 | 23.473 | 21.642 |
| 5.7106464 | 23.662 | 23.506 | 21.608 |
| 5.7174509325 | 23.644 | 23.476 | 21.634 |
| 5.724224911111111 | 23.636 | 23.466 | 21.608 |
| 5.731075251944445 | 23.603 | 23.454 | 21.553 |
| 5.7378492380555555 | 23.567 | 23.417 | 21.479 |
| 5.744684328333334 | 23.555 | 23.419 | 21.49 |
| 5.7513971802777775 | 23.578 | 23.432 | 21.49 |
| 5.758218387777778 | 23.583 | 23.424 | 21.477 |
| 5.765038177499999 | 23.585 | 23.434 | 21.515 |
| 5.771857984444444 | 23.572 | 23.437 | 21.505 |
| 5.778631968333333 | 23.59 | 23.45 | 21.51 |
| 5.7854212205555555 | 23.583 | 23.442 | 21.492 |
| 5.7921952022222225 | 23.603 | 23.44 | 21.49 |
| 5.799030273333333 | 23.603 | 23.434 | 21.505 |
| 5.805804256944445 | 23.588 | 23.45 | 21.5 |
| 5.8126240594444445 | 23.603 | 23.449 | 21.5 |
| 5.8193827625 | 23.607 | 23.459 | 21.516 |
| 5.8262345133333335 | 23.603 | 23.47 | 21.508 |
| 5.833039032222222 | 23.641 | 23.472 | 21.537 |
| 5.839813010555556 | 23.636 | 23.505 | 21.53 |
| 5.846617539166667 | 23.643 | 23.482 | 21.55 |
| 5.853376248055555 | 23.653 | 23.49 | 21.558 |
| 5.86016551 | 23.624 | 23.438 | 21.464 |
| 5.867000575 | 23.566 | 23.42 | 21.429 |
| 5.873805118333333 | 23.569 | 23.415 | 21.414 |
| 5.8805943591666665 | 23.571 | 23.423 | 21.411 |
| 5.887308626111111 | 23.576 | 23.436 | 21.421 |
| 5.8941895325 | 23.586 | 23.415 | 21.432 |
| 5.900963532777777 | 23.581 | 23.413 | 21.424 |
| 5.907752795555555 | 23.586 | 23.433 | 21.442 |
| 5.914603111944444 | 23.602 | 23.456 | 21.419 |
| 5.92139237 | 23.597 | 23.459 | 21.419 |
| 5.92818162 | 23.602 | 23.451 | 21.437 |
| 5.934940318888889 | 23.612 | 23.443 | 21.437 |
| 5.941775410555556 | 23.604 | 23.464 | 21.45 |
| 5.948564660555555 | 23.615 | 23.471 | 21.434 |
| 5.9553233613888885 | 23.629 | 23.471 | 21.442 |
| 5.962144552777778 | 23.64 | 23.477 | 21.474 |
| 5.968933809444445 | 23.638 | 23.493 | 21.479 |
| 5.975738332222223 | 23.662 | 23.481 | 21.461 |
| 5.982512314999999 | 23.655 | 23.478 | 21.515 |
| 5.9893168575 | 23.621 | 23.459 | 21.414 |
| 5.996121377222223 | 23.57 | 23.424 | 21.374 |
| 6.002895396666666 | 23.578 | 23.419 | 21.363 |
| 6.009699881944444 | 23.575 | 23.439 | 21.374 |
| 6.016519682777778 | 23.583 | 23.424 | 21.371 |
| 6.0232936666666665 | 23.6 | 23.46 | 21.374 |
| 6.030084317777777 | 23.57 | 23.445 | 21.361 |
| 6.036904109444444 | 23.588 | 23.439 | 21.356 |
| 6.043678084722223 | 23.583 | 23.439 | 21.366 |
| 6.050482611111112 | 23.611 | 23.46 | 21.343 |
| 6.057317709444445 | 23.58 | 23.445 | 21.366 |
| 6.0640916874999995 | 23.59 | 23.45 | 21.366 |
| 6.070865679166666 | 23.606 | 23.47 | 21.35 |
| 6.0776396238888895 | 23.611 | 23.465 | 21.363 |
| 6.084551091388889 | 23.613 | 23.468 | 21.363 |
| 6.091279238333334 | 23.632 | 23.457 | 21.374 |
| 6.0980851575 | 23.633 | 23.474 | 21.392 |
| 6.104859125277778 | 23.619 | 23.475 | 21.405 |
| 6.1116483963888895 | 23.661 | 23.487 | 21.421 |
| 6.118483486111112 | 23.658 | 23.487 | 21.424 |
| 6.1252879927777775 | 23.664 | 23.479 | 21.421 |
| 6.132062056666667 | 23.657 | 23.484 | 21.398 |
| 6.138835945555556 | 23.642 | 23.5 | 21.4 |
| 6.145671023333334 | 23.663 | 23.485 | 21.387 |
| 6.152445014444444 | 23.615 | 23.458 | 21.329 |
| 6.159264813055556 | 23.596 | 23.436 | 21.308 |
| 6.166040182222222 | 23.586 | 23.451 | 21.308 |
| 6.1728447030555555 | 23.586 | 23.446 | 21.313 |
| 6.1796339638888895 | 23.586 | 23.436 | 21.298 |
| 6.186438578888889 | 23.609 | 23.464 | 21.31 |
| 6.1932430258333335 | 23.599 | 23.454 | 21.29 |
| 6.200016995277778 | 23.592 | 23.451 | 21.308 |
| 6.206836821111111 | 23.602 | 23.464 | 21.298 |
| 6.213595503333334 | 23.599 | 23.459 | 21.303 |
| 6.220400038055556 | 23.609 | 23.466 | 21.316 |
| 6.227250392222222 | 23.597 | 23.466 | 21.316 |
| 6.2340563025 | 23.607 | 23.466 | 21.31 |
| 6.240860834166667 | 23.612 | 23.485 | 21.303 |
| 6.2476195425 | 23.637 | 23.492 | 21.363 |
| 6.254408787222222 | 23.65 | 23.478 | 21.356 |
| 6.261213308333334 | 23.665 | 23.486 | 21.368 |
| 6.268109518055555 | 23.667 | 23.511 | 21.358 |
| 6.2747918275 | 23.657 | 23.514 | 21.361 |
| 6.281611642222222 | 23.66 | 23.504 | 21.356 |
| 6.2884008811111105 | 23.606 | 23.449 | 21.256 |
| 6.295174857222222 | 23.58 | 23.437 | 21.224 |
| 6.302026604722222 | 23.562 | 23.447 | 21.234 |
| 6.308785311944444 | 23.588 | 23.427 | 21.245 |
| 6.315635664444444 | 23.583 | 23.445 | 21.24 |
| 6.322424918333333 | 23.585 | 23.445 | 21.222 |
| 6.329198906111111 | 23.598 | 23.457 | 21.237 |
| 6.336018696111111 | 23.603 | 23.457 | 21.227 |
| 6.342777398333333 | 23.6 | 23.447 | 21.224 |
| 6.349566656666667 | 23.621 | 23.473 | 21.237 |
| 6.356386454444445 | 23.6 | 23.462 | 21.26 |
| 6.3631910241666665 | 23.608 | 23.47 | 21.237 |
| 6.369981633888889 | 23.621 | 23.475 | 21.222 |
| 6.376755608888889 | 23.613 | 23.468 | 21.229 |
| 6.383560132777778 | 23.618 | 23.468 | 21.25 |
| 6.3903341183333335 | 23.647 | 23.495 | 21.303 |
| 6.397138646111111 | 23.626 | 23.497 | 21.295 |
| 6.403988996944445 | 23.653 | 23.51 | 21.287 |
| 6.4107629741666665 | 23.658 | 23.5 | 21.285 |
| 6.4175369516666665 | 23.651 | 23.492 | 21.285 |
| 6.424356760277777 | 23.662 | 23.487 | 21.287 |
| 6.431161289166666 | 23.609 | 23.455 | 21.224 |
| 6.437921404722222 | 23.597 | 23.44 | 21.2 |
| 6.444756456666666 | 23.598 | 23.431 | 21.174 |
| 6.451560981944445 | 23.584 | 23.433 | 21.169 |
| 6.458350248888888 | 23.594 | 23.446 | 21.161 |
| 6.465108950833333 | 23.579 | 23.448 | 21.161 |
| 6.471882928888889 | 23.584 | 23.456 | 21.143 |
| 6.478748548333333 | 23.602 | 23.448 | 21.171 |
| 6.485583635833334 | 23.602 | 23.466 | 21.169 |
| 6.492357614722222 | 23.589 | 23.466 | 21.182 |
| 6.499131590555556 | 23.599 | 23.459 | 21.166 |
| 6.505906972222222 | 23.599 | 23.456 | 21.171 |
| 6.512711488611111 | 23.622 | 23.461 | 21.182 |
| 6.51950074 | 23.617 | 23.482 | 21.169 |
| 6.526305268055555 | 23.604 | 23.471 | 21.166 |
| 6.533079255277778 | 23.623 | 23.464 | 21.164 |
| 6.53989905 | 23.617 | 23.492 | 21.203 |
| 6.546688305277778 | 23.63 | 23.484 | 21.2 |
| 6.553538695833333 | 23.67 | 23.501 | 21.211 |
| 6.560312631111111 | 23.652 | 23.481 | 21.229 |
| 6.567117166111111 | 23.652 | 23.509 | 21.227 |
| 6.573907801111111 | 23.639 | 23.506 | 21.224 |
| 6.580681781111111 | 23.65 | 23.481 | 21.187 |
| 6.587455766111111 | 23.609 | 23.454 | 21.155 |
| 6.594260291944444 | 23.577 | 23.445 | 21.103 |
| 6.601125922222222 | 23.583 | 23.439 | 21.095 |
| 6.607869349166666 | 23.575 | 23.452 | 21.093 |
| 6.614673879166666 | 23.583 | 23.45 | 21.09 |
| 6.621478399444444 | 23.59 | 23.437 | 21.093 |
| 6.6282523825 | 23.603 | 23.447 | 21.085 |
| 6.635148568888889 | 23.575 | 23.455 | 21.1 |
| 6.641862824166667 | 23.605 | 23.434 | 21.1 |
| 6.6486979066666665 | 23.6 | 23.46 | 21.103 |
| 6.655471898611111 | 23.605 | 23.46 | 21.106 |
| 6.662245877777777 | 23.595 | 23.46 | 21.098 |
| 6.669050393055556 | 23.605 | 23.478 | 21.108 |
| 6.675824383611111 | 23.618 | 23.473 | 21.098 |
| 6.6826136225 | 23.613 | 23.462 | 21.116 |
| 6.689463976388889 | 23.613 | 23.473 | 21.098 |
| 6.696268509166666 | 23.648 | 23.475 | 21.148 |
| 6.7030424925 | 23.647 | 23.495 | 21.166 |
| 6.709802590555555 | 23.637 | 23.507 | 21.145 |
| 6.716622383888889 | 23.658 | 23.489 | 21.143 |
| 6.7234727375 | 23.676 | 23.507 | 21.156 |
| 6.730185611388889 | 23.647 | 23.489 | 21.143 |
| 6.737066526944444 | 23.602 | 23.453 | 21.082 |
| 6.743855781111111 | 23.591 | 23.428 | 21.045 |
| 6.750675586944444 | 23.579 | 23.433 | 21.037 |
| 6.757449557499999 | 23.566 | 23.453 | 21.04 |
| 6.764238806944444 | 23.581 | 23.456 | 21.042 |
| 6.771073888611111 | 23.586 | 23.43 | 21.04 |
| 6.777847873611111 | 23.591 | 23.453 | 21.022 |
| 6.784577421111112 | 23.597 | 23.471 | 21.024 |
| 6.791381960833333 | 23.602 | 23.448 | 21.022 |
| 6.798217023888889 | 23.607 | 23.459 | 21.042 |
| 6.804990994722222 | 23.604 | 23.448 | 21.035 |
| 6.8117344575 | 23.584 | 23.456 | 21.019 |
| 6.818630606666667 | 23.609 | 23.471 | 21.042 |
| 6.825404580277778 | 23.586 | 23.461 | 21.024 |
| 6.83217868638889 | 23.599 | 23.479 | 21.045 |
| 6.838983090277777 | 23.626 | 23.47 | 21.051 |
| 6.845758470555555 | 23.607 | 23.47 | 21.045 |
| 6.852562976111111 | 23.657 | 23.486 | 21.095 |
| 6.859413336388888 | 23.642 | 23.47 | 21.098 |
| 6.866187315 | 23.637 | 23.493 | 21.087 |
| 6.8730529491666665 | 23.655 | 23.488 | 21.09 |
| 6.879735278333333 | 23.647 | 23.478 | 21.08 |
| 6.886600907499999 | 23.645 | 23.493 | 21.1 |
| 6.893344330555555 | 23.58 | 23.454 | 20.995 |
| 6.9001641411111105 | 23.575 | 23.422 | 20.951 |
| 6.906938120833333 | 23.572 | 23.416 | 20.987 |
| 6.9137593125 | 23.572 | 23.429 | 20.977 |
| 6.9205791175 | 23.582 | 23.429 | 20.987 |
| 6.927322536111111 | 23.57 | 23.452 | 20.971 |
| 6.934127069722222 | 23.6 | 23.447 | 20.959 |
| 6.9409468669444445 | 23.58 | 23.434 | 20.977 |
| 6.947736130833333 | 23.582 | 23.424 | 20.951 |
| 6.954510125833334 | 23.59 | 23.455 | 20.969 |
| 6.961345183055556 | 23.588 | 23.447 | 20.979 |
| 6.968149716388889 | 23.611 | 23.45 | 20.971 |
| 6.9749237102777775 | 23.588 | 23.439 | 20.946 |
| 6.981714327222223 | 23.598 | 23.45 | 20.977 |
| 6.9885494125 | 23.625 | 23.462 | 20.959 |
| 6.995323382777777 | 23.621 | 23.459 | 20.979 |
| 7.0021126422222215 | 23.616 | 23.456 | 21.042 |
| 7.0089477250000005 | 23.614 | 23.479 | 21.034 |
| 7.015721701666667 | 23.646 | 23.487 | 21.045 |
| 7.022541517222223 | 23.64 | 23.479 | 21.027 |
| 7.029284929166667 | 23.626 | 23.479 | 21.034 |
| 7.036104738333333 | 23.631 | 23.489 | 21.019 |
| 7.0429550927777775 | 23.61 | 23.465 | 20.985 |
| 7.0497290675 | 23.575 | 23.425 | 20.916 |
| 7.05653498861111 | 23.558 | 23.425 | 20.919 |
| 7.0633089644444444 | 23.563 | 23.441 | 20.903 |
| 7.070067662222222 | 23.579 | 23.433 | 20.921 |
| 7.076918019722222 | 23.584 | 23.436 | 20.921 |
| 7.083722554722222 | 23.576 | 23.436 | 20.888 |
| 7.090496525833333 | 23.563 | 23.42 | 20.903 |
| 7.097331604444444 | 23.563 | 23.436 | 20.906 |
| 7.104075035555556 | 23.586 | 23.433 | 20.898 |
| 7.110879565277777 | 23.581 | 23.433 | 20.901 |
| 7.117684101388889 | 23.581 | 23.446 | 20.908 |
| 7.124490124444445 | 23.589 | 23.441 | 20.89 |
| 7.131263993055555 | 23.586 | 23.453 | 20.906 |
| 7.1381143425 | 23.599 | 23.451 | 20.898 |
| 7.144888346666667 | 23.59 | 23.438 | 20.895 |
| 7.15169285361111 | 23.606 | 23.457 | 20.927 |
| 7.158482101944444 | 23.614 | 23.459 | 20.935 |
| 7.165256104999999 | 23.61 | 23.464 | 20.925 |
| 7.172045361944444 | 23.621 | 23.486 | 20.951 |
| 7.1788193147222215 | 23.626 | 23.488 | 20.956 |
| 7.185684941111112 | 23.625 | 23.48 | 20.958 |
| 7.192460308888889 | 23.63 | 23.475 | 20.945 |
| 7.1992342902777775 | 23.597 | 23.457 | 20.885 |
| 7.206023554166667 | 23.583 | 23.426 | 20.866 |
| 7.212797519444445 | 23.554 | 23.411 | 20.83 |
| 7.219617329444445 | 23.544 | 23.421 | 20.832 |
| 7.226421862222223 | 23.56 | 23.419 | 20.837 |
| 7.233272219722222 | 23.565 | 23.421 | 20.835 |
| 7.239985079444444 | 23.554 | 23.424 | 20.843 |
| 7.246789618055556 | 23.58 | 23.414 | 20.837 |
| 7.253624698333333 | 23.557 | 23.414 | 20.822 |
| 7.260400065000001 | 23.57 | 23.432 | 20.832 |
| 7.267235143055556 | 23.575 | 23.416 | 20.845 |
| 7.2740243925 | 23.58 | 23.439 | 20.824 |
| 7.280828918888889 | 23.57 | 23.432 | 20.84 |
| 7.2876181805555555 | 23.588 | 23.447 | 20.832 |
| 7.294392160555556 | 23.58 | 23.447 | 20.85 |
| 7.3011661411111115 | 23.583 | 23.442 | 20.827 |
| 7.308016488888889 | 23.604 | 23.43 | 20.84 |
| 7.314790459999999 | 23.611 | 23.457 | 20.874 |
| 7.321595060833333 | 23.61 | 23.446 | 20.885 |
| 7.328370359166667 | 23.63 | 23.482 | 20.911 |
| 7.335205472777777 | 23.61 | 23.474 | 20.888 |
| 7.342009971666666 | 23.62 | 23.456 | 20.906 |
| 7.348799222222222 | 23.611 | 23.476 | 20.874 |
| 7.355573203055555 | 23.604 | 23.465 | 20.859 |
| 7.362347174166667 | 23.573 | 23.43 | 20.816 |
| 7.369121162222222 | 23.54 | 23.379 | 20.769 |
| 7.376002064722223 | 23.535 | 23.39 | 20.738 |
| 7.3827607663888895 | 23.548 | 23.407 | 20.761 |
| 7.389550024166667 | 23.566 | 23.415 | 20.761 |
| 7.396325393055555 | 23.548 | 23.425 | 20.785 |
| 7.403160471944445 | 23.553 | 23.418 | 20.764 |
| 7.409934468611111 | 23.548 | 23.423 | 20.772 |
| 7.4167389825 | 23.546 | 23.415 | 20.774 |
| 7.423528226388889 | 23.563 | 23.423 | 20.766 |
| 7.430332755833333 | 23.569 | 23.441 | 20.779 |
| 7.437137281388889 | 23.558 | 23.41 | 20.761 |
| 7.44403346 | 23.548 | 23.418 | 20.761 |
| 7.450746340277778 | 23.562 | 23.43 | 20.779 |
| 7.4574911725 | 23.592 | 23.45 | 20.827 |
| 7.464310959722223 | 23.601 | 23.447 | 20.84 |
| 7.471130765277778 | 23.593 | 23.45 | 20.83 |
| 7.477996395 | 23.598 | 23.447 | 20.822 |
| 7.484724546388889 | 23.598 | 23.47 | 20.84 |
| 7.491544359722222 | 23.596 | 23.455 | 20.84 |
| 7.4983336099999995 | 23.601 | 23.438 | 20.803 |
| 7.505077053333333 | 23.562 | 23.423 | 20.761 |
| 7.511927396388889 | 23.541 | 23.399 | 20.732 |
| 7.518701365277778 | 23.524 | 23.391 | 20.716 |
| 7.525490620277777 | 23.552 | 23.391 | 20.716 |
| 7.5323270875 | 23.537 | 23.386 | 20.706 |
| 7.539131628611111 | 23.542 | 23.391 | 20.714 |
| 7.5459514386111115 | 23.539 | 23.401 | 20.716 |
| 7.552725401666667 | 23.537 | 23.419 | 20.708 |
| 7.559529928611111 | 23.532 | 23.409 | 20.714 |
| 7.566303903055555 | 23.562 | 23.409 | 20.698 |
| 7.573108447222222 | 23.537 | 23.416 | 20.693 |
| 7.5798976875 | 23.539 | 23.414 | 20.711 |
| 7.586686936944444 | 23.555 | 23.425 | 20.711 |
| 7.5934609222222225 | 23.571 | 23.428 | 20.737 |
| 7.600312661666667 | 23.574 | 23.425 | 20.764 |
| 7.607086646666667 | 23.582 | 23.431 | 20.766 |
| 7.613891175 | 23.574 | 23.438 | 20.774 |
| 7.620665152222222 | 23.579 | 23.433 | 20.774 |
| 7.6275002333333335 | 23.595 | 23.436 | 20.772 |
| 7.634274215277777 | 23.602 | 23.436 | 20.769 |
| 7.641094035555555 | 23.592 | 23.454 | 20.79 |
| 7.647867996388889 | 23.565 | 23.419 | 20.727 |
| 7.654672518888889 | 23.523 | 23.412 | 20.674 |
| 7.661417336388888 | 23.519 | 23.392 | 20.656 |
| 7.668282958333334 | 23.512 | 23.367 | 20.65 |
| 7.675056950555555 | 23.505 | 23.374 | 20.627 |
| 7.6818309241666665 | 23.52 | 23.39 | 20.653 |
| 7.6886660025 | 23.523 | 23.359 | 20.645 |
| 7.695439972777777 | 23.528 | 23.397 | 20.658 |
| 7.702275057777777 | 23.538 | 23.382 | 20.65 |
| 7.709125415 | 23.523 | 23.382 | 20.658 |
| 7.715807745277778 | 23.518 | 23.374 | 20.65 |
| 7.722597005 | 23.525 | 23.41 | 20.658 |
| 7.729372353611112 | 23.525 | 23.402 | 20.658 |
| 7.7362074355555555 | 23.541 | 23.397 | 20.645 |
| 7.743042523611112 | 23.523 | 23.41 | 20.656 |
| 7.749816492777778 | 23.552 | 23.409 | 20.674 |
| 7.7565904691666665 | 23.557 | 23.416 | 20.653 |
| 7.763395010555556 | 23.56 | 23.413 | 20.69 |
| 7.770168988333333 | 23.56 | 23.404 | 20.698 |
| 7.777004053611111 | 23.576 | 23.419 | 20.721 |
| 7.7837933136111115 | 23.57 | 23.432 | 20.706 |
| 7.790643667777777 | 23.573 | 23.427 | 20.693 |
| 7.797356552222222 | 23.578 | 23.424 | 20.698 |
| 7.8041624630555555 | 23.578 | 23.44 | 20.703 |
| 7.811012817500001 | 23.579 | 23.424 | 20.703 |
| 7.817786800555555 | 23.551 | 23.407 | 20.661 |
| 7.824576051666666 | 23.519 | 23.382 | 20.624 |
| 7.831426414166667 | 23.473 | 23.37 | 20.572 |
| 7.838200382222222 | 23.504 | 23.368 | 20.58 |
| 7.845004911666667 | 23.498 | 23.365 | 20.582 |
| 7.851809439444445 | 23.511 | 23.376 | 20.592 |
| 7.858629252222222 | 23.501 | 23.37 | 20.587 |
| 7.865342141111111 | 23.496 | 23.378 | 20.6 |
| 7.872178588333333 | 23.521 | 23.381 | 20.595 |
| 7.878952568611111 | 23.527 | 23.368 | 20.603 |
| 7.8857265566666666 | 23.524 | 23.381 | 20.598 |
| 7.892668568333333 | 23.524 | 23.391 | 20.572 |
| 7.899335606944445 | 23.501 | 23.378 | 20.608 |
| 7.906140140555555 | 23.537 | 23.386 | 20.585 |
| 7.912914131111111 | 23.519 | 23.393 | 20.598 |
| 7.919749194722222 | 23.516 | 23.396 | 20.59 |
| 7.926523193611112 | 23.523 | 23.387 | 20.619 |
| 7.9333887983333335 | 23.565 | 23.417 | 20.624 |
| 7.940148889722223 | 23.554 | 23.386 | 20.663 |
| 7.946938138888888 | 23.539 | 23.405 | 20.661 |
| 7.953712124722222 | 23.546 | 23.408 | 20.648 |
| 7.9605166516666666 | 23.549 | 23.413 | 20.658 |
| 7.96735173361111 | 23.549 | 23.395 | 20.656 |
| 7.974156254166666 | 23.577 | 23.426 | 20.638 |
| 7.980930240833334 | 23.582 | 23.413 | 20.65 |
| 7.987704225 | 23.572 | 23.415 | 20.676 |
| 7.9944934625 | 23.534 | 23.406 | 20.616 |
| 8.001343826666666 | 23.552 | 23.402 | 20.632 |
| 8.008058081388889 | 23.492 | 23.349 | 20.537 |
| 8.014938990277777 | 23.504 | 23.359 | 20.54 |
| 8.021712971388888 | 23.477 | 23.349 | 20.534 |
| 8.028532775 | 23.5 | 23.354 | 20.524 |
| 8.035260938055556 | 23.482 | 23.362 | 20.501 |
| 8.042096003055557 | 23.492 | 23.359 | 20.522 |
| 8.048900584722222 | 23.502 | 23.364 | 20.506 |
| 8.0556745125 | 23.502 | 23.372 | 20.532 |
| 8.062509589722222 | 23.5 | 23.372 | 20.519 |
| 8.06931413138889 | 23.515 | 23.369 | 20.545 |
| 8.076120044722222 | 23.479 | 23.374 | 20.532 |
| 8.08287874611111 | 23.505 | 23.377 | 20.532 |
| 8.089698545833334 | 23.505 | 23.367 | 20.519 |
| 8.096472531388889 | 23.514 | 23.382 | 20.532 |
| 8.103292329444445 | 23.524 | 23.397 | 20.579 |
| 8.110051034166666 | 23.522 | 23.395 | 20.574 |
| 8.116855566111111 | 23.545 | 23.391 | 20.595 |
| 8.123644826666666 | 23.537 | 23.396 | 20.592 |
| 8.130449351111112 | 23.545 | 23.419 | 20.608 |
| 8.13725388111111 | 23.548 | 23.394 | 20.587 |
| 8.14404451638889 | 23.548 | 23.409 | 20.564 |
| 8.1508338625 | 23.545 | 23.412 | 20.572 |
| 8.157684155277778 | 23.565 | 23.399 | 20.572 |
| 8.164458098611112 | 23.537 | 23.406 | 20.577 |
| 8.171232078055557 | 23.531 | 23.404 | 20.556 |
| 8.178051891111112 | 23.475 | 23.337 | 20.451 |
| 8.184825858888889 | 23.458 | 23.332 | 20.43 |
| 8.191676215 | 23.453 | 23.332 | 20.464 |
| 8.19845019611111 | 23.46 | 23.342 | 20.456 |
| 8.205224171944444 | 23.46 | 23.348 | 20.464 |
| 8.212030093055557 | 23.481 | 23.337 | 20.474 |
| 8.218819338888888 | 23.481 | 23.335 | 20.456 |
| 8.225593326111111 | 23.47 | 23.353 | 20.464 |
| 8.232397851388889 | 23.481 | 23.33 | 20.461 |
| 8.23923294138889 | 23.491 | 23.365 | 20.453 |
| 8.246006912777778 | 23.49 | 23.36 | 20.469 |
| 8.252857273055556 | 23.49 | 23.357 | 20.474 |
| 8.259570135833334 | 23.495 | 23.369 | 20.48 |
| 8.26648161 | 23.522 | 23.369 | 20.519 |
| 8.273209762777778 | 23.513 | 23.372 | 20.511 |
| 8.279985106666667 | 23.544 | 23.375 | 20.527 |
| 8.2867896575 | 23.495 | 23.382 | 20.529 |
| 8.293578895 | 23.518 | 23.385 | 20.519 |
| 8.300398713333333 | 23.523 | 23.385 | 20.527 |
| 8.307172677222223 | 23.523 | 23.364 | 20.511 |
| 8.314007760277779 | 23.539 | 23.395 | 20.529 |
| 8.320781738055556 | 23.516 | 23.372 | 20.509 |
| 8.32757099861111 | 23.541 | 23.405 | 20.511 |
| 8.334390804166667 | 23.505 | 23.383 | 20.487 |
| 8.341118946944444 | 23.472 | 23.328 | 20.432 |
| 8.3480012575 | 23.451 | 23.323 | 20.38 |
| 8.35477521111111 | 23.45 | 23.323 | 20.409 |
| 8.361533922222222 | 23.449 | 23.323 | 20.385 |
| 8.368353730833334 | 23.449 | 23.311 | 20.406 |
| 8.375142975 | 23.454 | 23.308 | 20.403 |
| 8.381947507777777 | 23.474 | 23.318 | 20.388 |
| 8.388721485 | 23.459 | 23.323 | 20.403 |
| 8.39555658388889 | 23.469 | 23.328 | 20.408 |
| 8.402330537777777 | 23.471 | 23.349 | 20.401 |
| 8.409135074166667 | 23.486 | 23.331 | 20.398 |
| 8.41595626638889 | 23.455 | 23.355 | 20.404 |
| 8.42277607361111 | 23.5 | 23.361 | 20.474 |
| 8.429550150833332 | 23.486 | 23.353 | 20.489 |
| 8.43632403 | 23.497 | 23.353 | 20.464 |
| 8.443113280555556 | 23.512 | 23.348 | 20.461 |
| 8.449963636388889 | 23.504 | 23.358 | 20.466 |
| 8.456737615 | 23.507 | 23.358 | 20.464 |
| 8.463542147777778 | 23.499 | 23.355 | 20.471 |
| 8.470316127777778 | 23.494 | 23.373 | 20.451 |
| 8.47709009611111 | 23.499 | 23.353 | 20.461 |
| 8.48391129 | 23.509 | 23.373 | 20.448 |
| 8.490731099722222 | 23.49 | 23.358 | 20.461 |
| 8.497505074166666 | 23.43 | 23.321 | 20.359 |
| 8.504340166666667 | 23.452 | 23.321 | 20.369 |
| 8.511144680833333 | 23.435 | 23.297 | 20.335 |
| 8.517979763888889 | 23.427 | 23.314 | 20.327 |
| 8.524677363333334 | 23.437 | 23.302 | 20.345 |
| 8.531497167222224 | 23.435 | 23.317 | 20.343 |
| 8.538271144444444 | 23.43 | 23.312 | 20.345 |
| 8.5451214975 | 23.432 | 23.304 | 20.337 |
| 8.551896871111111 | 23.432 | 23.325 | 20.319 |
| 8.558747215277778 | 23.442 | 23.314 | 20.343 |
| 8.565521211666667 | 23.472 | 23.32 | 20.372 |
| 8.57226463111111 | 23.458 | 23.336 | 20.387 |
| 8.579069152222221 | 23.477 | 23.339 | 20.395 |
| 8.585843144166667 | 23.467 | 23.334 | 20.388 |
| 8.592617105555554 | 23.48 | 23.336 | 20.38 |
| 8.599467465833333 | 23.485 | 23.344 | 20.385 |
| 8.606272004166668 | 23.475 | 23.344 | 20.393 |
| 8.613030703333333 | 23.498 | 23.324 | 20.406 |
| 8.619836620277777 | 23.477 | 23.352 | 20.401 |
| 8.626671694722223 | 23.493 | 23.344 | 20.413 |
| 8.633460955555556 | 23.485 | 23.331 | 20.403 |
| 8.640280752499999 | 23.493 | 23.349 | 20.413 |
| 8.647054735555555 | 23.498 | 23.354 | 20.419 |
| 8.653843991111112 | 23.481 | 23.359 | 20.4 |
| 8.660694337777779 | 23.43 | 23.297 | 20.329 |
| 8.667468317777779 | 23.443 | 23.31 | 20.329 |
| 8.674257577777778 | 23.449 | 23.292 | 20.29 |
| 8.68103155638889 | 23.398 | 23.26 | 20.269 |
| 8.687822195555556 | 23.413 | 23.277 | 20.295 |
| 8.694657265277778 | 23.403 | 23.3 | 20.282 |
| 8.701431246666667 | 23.406 | 23.27 | 20.295 |
| 8.708235793055556 | 23.413 | 23.29 | 20.285 |
| 8.715040312777777 | 23.4 | 23.283 | 20.279 |
| 8.721799012777778 | 23.434 | 23.293 | 20.264 |
| 8.728603615277777 | 23.438 | 23.304 | 20.306 |
| 8.735377514166666 | 23.446 | 23.31 | 20.332 |
| 8.742227874166668 | 23.448 | 23.284 | 20.353 |
| 8.749032404166666 | 23.441 | 23.284 | 20.337 |
| 8.755792489166668 | 23.456 | 23.322 | 20.309 |
| 8.76262759 | 23.43 | 23.317 | 20.366 |
| 8.769416823333334 | 23.466 | 23.299 | 20.35 |
| 8.776206079722222 | 23.463 | 23.327 | 20.355 |
| 8.783025877222222 | 23.453 | 23.307 | 20.337 |
| 8.789784598333334 | 23.451 | 23.317 | 20.343 |
| 8.796558626388888 | 23.451 | 23.315 | 20.34 |
| 8.803332539166666 | 23.461 | 23.317 | 20.335 |
| 8.810213449444444 | 23.474 | 23.335 | 20.355 |
| 8.817033265833334 | 23.474 | 23.322 | 20.345 |
| 8.823762795833334 | 23.448 | 23.303 | 20.332 |
| 8.830582595555557 | 23.407 | 23.27 | 20.258 |
| 8.837371853055554 | 23.41 | 23.291 | 20.256 |
| 8.844145825833333 | 23.379 | 23.261 | 20.229 |
| 8.85095037111111 | 23.366 | 23.248 | 20.222 |
| 8.857739613333333 | 23.397 | 23.266 | 20.211 |
| 8.864574696388889 | 23.381 | 23.266 | 20.219 |
| 8.871409766944444 | 23.381 | 23.274 | 20.242 |
| 8.878183746944444 | 23.42 | 23.299 | 20.258 |
| 8.884957806944445 | 23.411 | 23.276 | 20.271 |
| 8.891733088333334 | 23.434 | 23.296 | 20.274 |
| 8.898568264166666 | 23.427 | 23.293 | 20.295 |
| 8.905311598333332 | 23.416 | 23.293 | 20.292 |
| 8.912116126944444 | 23.416 | 23.293 | 20.274 |
| 8.918905375277777 | 23.432 | 23.303 | 20.297 |
| 8.925725187777777 | 23.414 | 23.298 | 20.295 |
| 8.932529714444446 | 23.421 | 23.301 | 20.303 |
| 8.939303696388889 | 23.424 | 23.298 | 20.305 |
| 8.946154051666667 | 23.442 | 23.301 | 20.292 |
| 8.953004401388888 | 23.465 | 23.285 | 20.292 |
| 8.959732554444445 | 23.429 | 23.306 | 20.3 |
| 8.966523197222221 | 23.437 | 23.313 | 20.287 |
| 8.973297171944445 | 23.437 | 23.311 | 20.277 |
| 8.980101708333335 | 23.452 | 23.326 | 20.308 |
| 8.986860494722222 | 23.434 | 23.294 | 20.261 |
| 8.993680210277779 | 23.435 | 23.301 | 20.264 |
| 9.000484739166668 | 23.374 | 23.239 | 20.169 |
| 9.007289266666668 | 23.365 | 23.237 | 20.166 |
| 9.014063243611112 | 23.367 | 23.232 | 20.156 |
| 9.020867774444444 | 23.357 | 23.224 | 20.153 |
| 9.027673689166667 | 23.378 | 23.234 | 20.148 |
| 9.034508766666667 | 23.357 | 23.227 | 20.171 |
| 9.04128275361111 | 23.381 | 23.234 | 20.174 |
| 9.0480720075 | 23.384 | 23.259 | 20.185 |
| 9.054907082222222 | 23.405 | 23.262 | 20.216 |
| 9.061681060277778 | 23.395 | 23.269 | 20.242 |
| 9.068455045833334 | 23.405 | 23.261 | 20.242 |
| 9.075259570555556 | 23.402 | 23.271 | 20.229 |
| 9.082033554722223 | 23.428 | 23.261 | 20.214 |
| 9.0888839025 | 23.418 | 23.274 | 20.222 |
| 9.095688426666667 | 23.407 | 23.256 | 20.222 |
| 9.102463800277777 | 23.415 | 23.264 | 20.242 |
| 9.10923786138889 | 23.4 | 23.274 | 20.25 |
| 9.11607285138889 | 23.42 | 23.282 | 20.24 |
| 9.122831564444445 | 23.423 | 23.274 | 20.222 |
| 9.129651363611112 | 23.43 | 23.287 | 20.227 |
| 9.136425340833332 | 23.423 | 23.292 | 20.255 |
| 9.143260419166666 | 23.393 | 23.281 | 20.213 |
| 9.150064963055556 | 23.382 | 23.249 | 20.203 |
| 9.15683892888889 | 23.351 | 23.235 | 20.147 |
| 9.163674011388888 | 23.351 | 23.213 | 20.103 |
| 9.170541027499999 | 23.353 | 23.218 | 20.126 |
| 9.177284549166666 | 23.351 | 23.223 | 20.113 |
| 9.184043152222223 | 23.348 | 23.224 | 20.106 |
| 9.190847680000001 | 23.352 | 23.223 | 20.148 |
| 9.1976369325 | 23.372 | 23.24 | 20.143 |
| 9.204426193055555 | 23.406 | 23.232 | 20.169 |
| 9.211184895 | 23.378 | 23.245 | 20.164 |
| 9.218035243333333 | 23.37 | 23.242 | 20.176 |
| 9.224809231388889 | 23.383 | 23.24 | 20.171 |
| 9.23164430361111 | 23.37 | 23.222 | 20.166 |
| 9.238389131111111 | 23.383 | 23.25 | 20.171 |
| 9.24520893 | 23.411 | 23.247 | 20.182 |
| 9.252013456388887 | 23.396 | 23.263 | 20.166 |
| 9.258787442777777 | 23.391 | 23.25 | 20.166 |
| 9.265637790555557 | 23.383 | 23.273 | 20.184 |
| 9.272411761666667 | 23.388 | 23.252 | 20.174 |
| 9.279201023888888 | 23.399 | 23.242 | 20.151 |
| 9.286005554166668 | 23.393 | 23.255 | 20.171 |
| 9.292794824722224 | 23.401 | 23.247 | 20.189 |
| 9.299570170555556 | 23.386 | 23.257 | 20.171 |
| 9.306344149166668 | 23.416 | 23.265 | 20.161 |
| 9.313163965277777 | 23.385 | 23.258 | 20.15 |
| 9.319983752777777 | 23.359 | 23.231 | 20.121 |
| 9.32677301138889 | 23.33 | 23.208 | 20.084 |
| 9.33357753361111 | 23.332 | 23.214 | 20.068 |
| 9.34035151 | 23.315 | 23.199 | 20.074 |
| 9.34712549861111 | 23.343 | 23.187 | 20.071 |
| 9.353945303888889 | 23.34 | 23.226 | 20.108 |
| 9.360795652777778 | 23.354 | 23.228 | 20.121 |
| 9.367569635833334 | 23.346 | 23.205 | 20.118 |
| 9.374344998333333 | 23.349 | 23.21 | 20.098 |
| 9.381118976111113 | 23.362 | 23.21 | 20.121 |
| 9.387954055833333 | 23.374 | 23.228 | 20.124 |
| 9.394728030277777 | 23.356 | 23.246 | 20.116 |
| 9.401502009166666 | 23.354 | 23.231 | 20.124 |
| 9.408352370277777 | 23.356 | 23.223 | 20.111 |
| 9.415141620555554 | 23.356 | 23.223 | 20.113 |
| 9.421930871666666 | 23.377 | 23.254 | 20.124 |
| 9.428765947777778 | 23.387 | 23.228 | 20.131 |
| 9.43553992361111 | 23.359 | 23.251 | 20.149 |
| 9.442361127777778 | 23.364 | 23.243 | 20.124 |
| 9.449135110277778 | 23.367 | 23.231 | 20.134 |
| 9.455909080833333 | 23.39 | 23.238 | 20.118 |
| 9.462698331388887 | 23.367 | 23.238 | 20.116 |
| 9.46956398222222 | 23.364 | 23.22 | 20.118 |
| 9.476292125555556 | 23.348 | 23.237 | 20.108 |
| 9.483111914444445 | 23.375 | 23.243 | 20.121 |
| 9.489885901666668 | 23.308 | 23.191 | 20.026 |
| 9.496736250555557 | 23.286 | 23.18 | 20.016 |
| 9.503479676944444 | 23.306 | 23.172 | 20.021 |
| 9.510316150000001 | 23.292 | 23.171 | 20.026 |
| 9.51705957861111 | 23.307 | 23.197 | 20.042 |
| 9.523925205277777 | 23.335 | 23.189 | 20.073 |
| 9.530699185833333 | 23.319 | 23.186 | 20.079 |
| 9.537518983055556 | 23.327 | 23.191 | 20.053 |
| 9.544293005277778 | 23.33 | 23.196 | 20.086 |
| 9.551097495555556 | 23.325 | 23.199 | 20.076 |
| 9.557886743333333 | 23.327 | 23.199 | 20.058 |
| 9.564706571666665 | 23.332 | 23.191 | 20.061 |
| 9.571480531944445 | 23.34 | 23.201 | 20.073 |
| 9.578255903611112 | 23.337 | 23.224 | 20.066 |
| 9.58506043138889 | 23.337 | 23.232 | 20.058 |
| 9.591849688333333 | 23.34 | 23.204 | 20.048 |
| 9.598593102499999 | 23.335 | 23.196 | 20.061 |
| 9.605474019722221 | 23.337 | 23.214 | 20.063 |
| 9.612247994722223 | 23.355 | 23.214 | 20.058 |
| 9.619067792222223 | 23.36 | 23.196 | 20.055 |
| 9.625811225 | 23.327 | 23.209 | 20.073 |
| 9.632692135277777 | 23.342 | 23.222 | 20.079 |
| 9.639481384444446 | 23.353 | 23.237 | 20.066 |
| 9.646256751666666 | 23.363 | 23.224 | 20.081 |
| 9.653030730555555 | 23.334 | 23.207 | 20.034 |
| 9.659819990833334 | 23.33 | 23.197 | 20.013 |
| 9.666670339722224 | 23.267 | 23.15 | 19.948 |
| 9.673444311944445 | 23.28 | 23.171 | 19.945 |
| 9.680248845833333 | 23.269 | 23.145 | 19.958 |
| 9.687022822222223 | 23.285 | 23.152 | 19.95 |
| 9.693827348055555 | 23.29 | 23.162 | 19.968 |
| 9.70058605 | 23.281 | 23.168 | 19.984 |
| 9.707497509444444 | 23.313 | 23.182 | 20.021 |
| 9.7142270525 | 23.303 | 23.19 | 20.003 |
| 9.720985748888888 | 23.313 | 23.182 | 20.005 |
| 9.727836121944444 | 23.313 | 23.177 | 20.005 |
| 9.73464064888889 | 23.308 | 23.18 | 20.003 |
| 9.741445169722223 | 23.318 | 23.172 | 20.008 |
| 9.748188595277778 | 23.295 | 23.177 | 19.99 |
| 9.754947301388889 | 23.316 | 23.175 | 20.028 |
| 9.761797654444443 | 23.316 | 23.182 | 20.008 |
| 9.768571634166666 | 23.303 | 23.175 | 20.005 |
| 9.775421986666666 | 23.311 | 23.172 | 19.995 |
| 9.78219735 | 23.305 | 23.187 | 20 |
| 9.7890018825 | 23.318 | 23.177 | 20.01 |
| 9.795745304166667 | 23.316 | 23.167 | 20.023 |
| 9.802519280277778 | 23.331 | 23.172 | 20.015 |
| 9.809415467222223 | 23.305 | 23.185 | 20.008 |
| 9.816189452222222 | 23.321 | 23.21 | 19.992 |
| 9.822993981666666 | 23.321 | 23.195 | 20.005 |
| 9.829783231944445 | 23.331 | 23.198 | 19.99 |
| 9.836618304444444 | 23.316 | 23.195 | 20.018 |
| 9.843346457222223 | 23.314 | 23.19 | 19.984 |
| 9.850121846666667 | 23.313 | 23.183 | 19.976 |
| 9.856926364722222 | 23.246 | 23.126 | 19.887 |
| 9.863761435277778 | 23.239 | 23.126 | 19.884 |
| 9.870565968055557 | 23.255 | 23.136 | 19.887 |
| 9.877324668055556 | 23.252 | 23.145 | 19.937 |
| 9.884144471666668 | 23.247 | 23.133 | 19.929 |
| 9.890903174444446 | 23.274 | 23.138 | 19.932 |
| 9.897768801944444 | 23.281 | 23.138 | 19.955 |
| 9.904496985277778 | 23.281 | 23.133 | 19.945 |
| 9.911332036111112 | 23.276 | 23.117 | 19.945 |
| 9.918122689722223 | 23.276 | 23.15 | 19.955 |
| 9.924957851666667 | 23.261 | 23.158 | 19.947 |
| 9.931731729722223 | 23.279 | 23.155 | 19.939 |
| 9.938566819166667 | 23.286 | 23.15 | 19.947 |
| 9.945340794444444 | 23.289 | 23.138 | 19.955 |
| 9.952114782777777 | 23.292 | 23.153 | 19.96 |
| 9.958919295833335 | 23.269 | 23.148 | 19.955 |
| 9.965723831111111 | 23.271 | 23.158 | 19.958 |
| 9.972528354166668 | 23.286 | 23.143 | 19.947 |
| 9.979302333055555 | 23.294 | 23.155 | 19.955 |
| 9.98610824638889 | 23.294 | 23.155 | 19.942 |
| 9.99288223 | 23.292 | 23.158 | 19.958 |
| 9.999686756666668 | 23.289 | 23.168 | 19.939 |
| 10.006506563055554 | 23.292 | 23.163 | 19.95 |
| 10.013265273611111 | 23.284 | 23.168 | 19.945 |
| 10.020100345277777 | 23.297 | 23.161 | 19.955 |
| 10.026889597777778 | 23.294 | 23.171 | 19.947 |
| 10.033663575833334 | 23.302 | 23.163 | 19.932 |
| 10.040437569166667 | 23.285 | 23.153 | 19.921 |
| 10.047272631388887 | 23.285 | 23.158 | 19.931 |
| 10.0540938425 | 23.278 | 23.128 | 19.923 |
| 10.060867808888888 | 23.26 | 23.145 | 19.887 |
| 10.067641779166667 | 23.223 | 23.108 | 19.847 |
| 10.074507414166668 | 23.238 | 23.105 | 19.879 |
| 10.081281393333335 | 23.229 | 23.098 | 19.86 |
| 10.088085919444444 | 23.239 | 23.12 | 19.858 |
| 10.094859925000002 | 23.243 | 23.106 | 19.894 |
| 10.101679705833334 | 23.224 | 23.124 | 19.882 |
| 10.108438410833333 | 23.247 | 23.106 | 19.876 |
| 10.115227666111112 | 23.244 | 23.136 | 19.884 |
| 10.122048848055554 | 23.234 | 23.121 | 19.894 |
| 10.128822830277779 | 23.239 | 23.121 | 19.894 |
| 10.135673184444444 | 23.26 | 23.134 | 19.9 |
| 10.142431887777779 | 23.26 | 23.121 | 19.91 |
| 10.149266968055555 | 23.255 | 23.113 | 19.882 |
| 10.15604095972222 | 23.25 | 23.113 | 19.871 |
| 10.162814924444445 | 23.255 | 23.124 | 19.884 |
| 10.169588896388888 | 23.255 | 23.129 | 19.884 |
| 10.176393435555555 | 23.27 | 23.129 | 19.894 |
| 10.18321323888889 | 23.25 | 23.116 | 19.889 |
| 10.190019159166667 | 23.262 | 23.126 | 19.889 |
| 10.196793123055555 | 23.285 | 23.119 | 19.882 |
| 10.203643493055555 | 23.262 | 23.124 | 19.876 |
| 10.210463282500001 | 23.26 | 23.121 | 19.907 |
| 10.217267815 | 23.26 | 23.129 | 19.892 |
| 10.223995988333334 | 23.255 | 23.131 | 19.861 |
| 10.230769945833332 | 23.255 | 23.119 | 19.887 |
| 10.237635575833334 | 23.275 | 23.124 | 19.876 |
| 10.244363738888888 | 23.26 | 23.131 | 19.879 |
| 10.251152974444445 | 23.29 | 23.139 | 19.905 |
| 10.258019995277778 | 23.275 | 23.121 | 19.907 |
| 10.264870370555556 | 23.245 | 23.146 | 19.866 |
| 10.27159851611111 | 23.241 | 23.119 | 19.868 |
| 10.278372485 | 23.257 | 23.142 | 19.884 |
| 10.285161746111111 | 23.237 | 23.117 | 19.829 |
| 10.29195099638889 | 23.209 | 23.077 | 19.8 |
| 10.298786079444445 | 23.21 | 23.079 | 19.82 |
| 10.305621161666666 | 23.2 | 23.066 | 19.797 |
| 10.31239520611111 | 23.216 | 23.075 | 19.833 |
| 10.319153830277777 | 23.2 | 23.078 | 19.8 |
| 10.325959756944444 | 23.225 | 23.092 | 19.826 |
| 10.332779556944445 | 23.2 | 23.087 | 19.826 |
| 10.339553530833333 | 23.21 | 23.087 | 19.818 |
| 10.346327521944444 | 23.205 | 23.089 | 19.829 |
| 10.353177874444443 | 23.223 | 23.079 | 19.824 |
| 10.359967112222222 | 23.228 | 23.089 | 19.818 |
| 10.366771646388889 | 23.22 | 23.094 | 19.821 |
| 10.373545640833333 | 23.208 | 23.089 | 19.813 |
| 10.38038071861111 | 23.243 | 23.099 | 19.826 |
| 10.387154694444444 | 23.213 | 23.084 | 19.811 |
| 10.393945343611112 | 23.228 | 23.099 | 19.826 |
| 10.400704036666665 | 23.228 | 23.071 | 19.849 |
| 10.407508561666667 | 23.233 | 23.087 | 19.816 |
| 10.41434363527778 | 23.215 | 23.082 | 19.829 |
| 10.421117616944445 | 23.225 | 23.092 | 19.824 |
| 10.427891601944443 | 23.23 | 23.092 | 19.816 |
| 10.434726669444444 | 23.228 | 23.105 | 19.821 |
| 10.441515927777777 | 23.228 | 23.112 | 19.831 |
| 10.448305192777779 | 23.218 | 23.089 | 19.821 |
| 10.455124991944444 | 23.241 | 23.102 | 19.834 |
| 10.461900374444445 | 23.236 | 23.11 | 19.834 |
| 10.468735435277779 | 23.223 | 23.11 | 19.813 |
| 10.475524688888889 | 23.223 | 23.084 | 19.798 |
| 10.482268112777778 | 23.236 | 23.087 | 19.824 |
| 10.489072639444446 | 23.233 | 23.107 | 19.818 |
| 10.495907718333333 | 23.223 | 23.115 | 19.806 |
| 10.50268176888889 | 23.228 | 23.12 | 19.829 |
| 10.509501511111111 | 23.251 | 23.11 | 19.818 |
| 10.516290759166667 | 23.243 | 23.107 | 19.803 |
| 10.523110554722223 | 23.208 | 23.082 | 19.769 |
| 10.529901215555554 | 23.226 | 23.094 | 19.8 |
| 10.536736277777777 | 23.194 | 23.076 | 19.763 |
| 10.543479715555556 | 23.15 | 23.041 | 19.703 |
| 10.550253693333334 | 23.169 | 23.046 | 19.703 |
| 10.557073501944444 | 23.152 | 23.041 | 19.705 |
| 10.563847470833334 | 23.147 | 23.035 | 19.708 |
| 10.5706520075 | 23.159 | 23.024 | 19.698 |
| 10.5774259725 | 23.163 | 23.039 | 19.724 |
| 10.584230508333333 | 23.166 | 23.037 | 19.7 |
| 10.591096142222222 | 23.155 | 23.039 | 19.718 |
| 10.597871495555555 | 23.194 | 23.062 | 19.742 |
| 10.604614929722223 | 23.196 | 23.04 | 19.758 |
| 10.611480563333332 | 23.186 | 23.05 | 19.758 |
| 10.618269815833333 | 23.176 | 23.06 | 19.766 |
| 10.625028516666665 | 23.168 | 23.045 | 19.758 |
| 10.631817768333333 | 23.183 | 23.055 | 19.753 |
| 10.638622292222221 | 23.196 | 23.055 | 19.763 |
| 10.645396278055555 | 23.178 | 23.065 | 19.758 |
| 10.652231360833333 | 23.199 | 23.057 | 19.753 |
| 10.65900534611111 | 23.191 | 23.045 | 19.75 |
| 10.665841805555555 | 23.191 | 23.075 | 19.753 |
| 10.672615783888888 | 23.201 | 23.083 | 19.76 |
| 10.679435584166667 | 23.173 | 23.06 | 19.753 |
| 10.686209566944445 | 23.199 | 23.078 | 19.753 |
| 10.692983544444445 | 23.181 | 23.06 | 19.748 |
| 10.699833896388888 | 23.181 | 23.045 | 19.745 |
| 10.706607870833333 | 23.204 | 23.078 | 19.766 |
| 10.71338186 | 23.191 | 23.07 | 19.76 |
| 10.720216929166666 | 23.201 | 23.065 | 19.763 |
| 10.72700618611111 | 23.196 | 23.075 | 19.748 |
| 10.733825994166667 | 23.186 | 23.08 | 19.758 |
| 10.740601377777779 | 23.194 | 23.07 | 19.748 |
| 10.747375341666666 | 23.194 | 23.078 | 19.748 |
| 10.754149312222223 | 23.206 | 23.07 | 19.748 |
| 10.761014952222222 | 23.201 | 23.078 | 19.742 |
| 10.767819471388888 | 23.201 | 23.06 | 19.755 |
| 10.774562915 | 23.192 | 23.065 | 19.719 |
| 10.781352155 | 23.204 | 23.07 | 19.745 |
| 10.788171959722222 | 23.161 | 23.048 | 19.705 |
| 10.794976484166666 | 23.153 | 23.016 | 19.653 |
| 10.801767142777777 | 23.145 | 23.036 | 19.64 |
| 10.808541111111111 | 23.126 | 22.999 | 19.655 |
| 10.81534564 | 23.127 | 23.013 | 19.655 |
| 10.822150159444446 | 23.123 | 23.016 | 19.637 |
| 10.828939425 | 23.112 | 23.027 | 19.666 |
| 10.835759236666666 | 23.135 | 23.014 | 19.676 |
| 10.842533197777778 | 23.128 | 23.009 | 19.702 |
| 10.849353010555555 | 23.159 | 23.001 | 19.674 |
| 10.856142253333333 | 23.143 | 23.005 | 19.674 |
| 10.862916247222222 | 23.166 | 23.02 | 19.689 |
| 10.869766603611112 | 23.164 | 23.01 | 19.705 |
| 10.876572511944444 | 23.149 | 23.015 | 19.692 |
| 10.883377033611112 | 23.136 | 22.998 | 19.708 |
| 10.890151018055555 | 23.154 | 23.028 | 19.674 |
| 10.896909719166668 | 23.141 | 23.031 | 19.695 |
| 10.90371425 | 23.149 | 23.033 | 19.69 |
| 10.910488221111112 | 23.154 | 23.013 | 19.692 |
| 10.917323306944445 | 23.146 | 22.998 | 19.695 |
| 10.924112556944443 | 23.144 | 23.02 | 19.684 |
| 10.930947640277777 | 23.146 | 23.038 | 19.682 |
| 10.937736983611112 | 23.169 | 23.023 | 19.692 |
| 10.944542810833335 | 23.162 | 23.02 | 19.684 |
| 10.951377893333333 | 23.157 | 23.026 | 19.697 |
| 10.958090768055555 | 23.154 | 23.038 | 19.687 |
| 10.964895291944446 | 23.159 | 23.036 | 19.697 |
| 10.971715089722222 | 23.154 | 23.031 | 19.69 |
| 10.978473810555556 | 23.162 | 23.018 | 19.695 |
| 10.98530887611111 | 23.159 | 23.041 | 19.677 |
| 10.992082861666667 | 23.159 | 23.026 | 19.692 |
| 10.998887382777777 | 23.172 | 23.038 | 19.695 |
| 11.005753012777777 | 23.169 | 23.015 | 19.69 |
| 11.01246727611111 | 23.164 | 23.026 | 19.703 |
| 11.01927181527778 | 23.169 | 23.043 | 19.695 |
| 11.026045786666668 | 23.159 | 23.031 | 19.718 |
| 11.032850330833332 | 23.136 | 23.019 | 19.674 |
| 11.039654851944446 | 23.117 | 22.999 | 19.626 |
| 11.046489922777779 | 23.081 | 22.954 | 19.584 |
| 11.053263904722222 | 23.076 | 22.989 | 19.6 |
| 11.060037894166667 | 23.097 | 22.976 | 19.613 |
| 11.0668882375 | 23.081 | 22.948 | 19.59 |
| 11.073662240555556 | 23.104 | 22.977 | 19.624 |
| 11.0804681525 | 23.092 | 22.966 | 19.645 |
| 11.087257393333333 | 23.112 | 22.984 | 19.621 |
| 11.094031367500001 | 23.104 | 22.994 | 19.619 |
| 11.10083589638889 | 23.12 | 22.994 | 19.616 |
| 11.107609874166666 | 23.117 | 22.973 | 19.616 |
| 11.114444962222223 | 23.107 | 22.978 | 19.637 |
| 11.121249498055555 | 23.125 | 22.999 | 19.621 |
| 11.128023478333333 | 23.102 | 22.989 | 19.621 |
| 11.134797443333332 | 23.115 | 22.971 | 19.639 |
| 11.141603360555555 | 23.115 | 22.971 | 19.637 |
| 11.148453701388888 | 23.12 | 22.991 | 19.642 |
| 11.155212425555556 | 23.117 | 23.004 | 19.621 |
| 11.161986392777779 | 23.102 | 22.976 | 19.621 |
| 11.168836760555557 | 23.107 | 22.971 | 19.621 |
| 11.175610719166666 | 23.122 | 22.994 | 19.637 |
| 11.182415250277778 | 23.112 | 22.994 | 19.639 |
| 11.189204511666667 | 23.115 | 22.986 | 19.629 |
| 11.196024301666668 | 23.12 | 22.986 | 19.637 |
| 11.202813564166668 | 23.112 | 22.999 | 19.642 |
| 11.209618089722222 | 23.12 | 22.989 | 19.637 |
| 11.21639345888889 | 23.122 | 22.994 | 19.632 |
| 11.223167444722222 | 23.12 | 23.001 | 19.637 |
| 11.230017879444445 | 23.13 | 22.991 | 19.629 |
| 11.236807046388888 | 23.108 | 22.978 | 19.613 |
| 11.24361157888889 | 23.102 | 22.996 | 19.629 |
| 11.250385567222223 | 23.081 | 22.945 | 19.571 |
| 11.257159539166667 | 23.104 | 22.967 | 19.603 |
| 11.263964071388889 | 23.079 | 22.961 | 19.553 |
| 11.270799144722224 | 23.058 | 22.934 | 19.521 |
| 11.277573114166666 | 23.032 | 22.939 | 19.537 |
| 11.284363761111113 | 23.076 | 22.929 | 19.563 |
| 11.291183557222222 | 23.075 | 22.936 | 19.579 |
| 11.297957543888888 | 23.069 | 22.967 | 19.545 |
| 11.304777344722222 | 23.057 | 22.947 | 19.566 |
| 11.311551326944443 | 23.078 | 22.947 | 19.589 |
| 11.31838643138889 | 23.068 | 22.942 | 19.563 |
| 11.325175650833332 | 23.075 | 22.942 | 19.576 |
| 11.331995477777777 | 23.073 | 22.944 | 19.551 |
| 11.338769433333333 | 23.075 | 22.957 | 19.571 |
| 11.345543413055555 | 23.078 | 22.947 | 19.561 |
| 11.352318782222222 | 23.075 | 22.957 | 19.561 |
| 11.359108037777776 | 23.062 | 22.957 | 19.574 |
| 11.365912560833333 | 23.075 | 22.944 | 19.582 |
| 11.3727170925 | 23.093 | 22.962 | 19.563 |
| 11.379521627222223 | 23.083 | 22.959 | 19.576 |
| 11.38637198638889 | 23.073 | 22.947 | 19.561 |
| 11.393161309444444 | 23.08 | 22.97 | 19.576 |
| 11.399919931944444 | 23.088 | 22.959 | 19.571 |
| 11.406739740833332 | 23.088 | 22.952 | 19.579 |
| 11.413513714722223 | 23.085 | 22.962 | 19.566 |
| 11.420258536666667 | 23.083 | 22.977 | 19.579 |
| 11.427139443888889 | 23.093 | 22.954 | 19.566 |
| 11.433913419722222 | 23.096 | 22.957 | 19.563 |
| 11.440672121666667 | 23.088 | 22.962 | 19.574 |
| 11.447522483611111 | 23.098 | 22.959 | 19.579 |
| 11.454281190833333 | 23.085 | 22.977 | 19.574 |
| 11.4610857075 | 23.08 | 22.965 | 19.579 |
| 11.467844408055555 | 23.069 | 22.941 | 19.553 |
| 11.474725309166667 | 23.033 | 22.92 | 19.485 |
| 11.48149929 | 23.029 | 22.915 | 19.477 |
| 11.488335776388888 | 23.019 | 22.879 | 19.489 |
| 11.495063912222223 | 23.028 | 22.915 | 19.492 |
| 11.501929537777778 | 23.02 | 22.884 | 19.497 |
| 11.508672980833333 | 23.02 | 22.903 | 19.498 |
| 11.515462224722222 | 23.032 | 22.91 | 19.511 |
| 11.522266764722222 | 23.036 | 22.907 | 19.493 |
| 11.529056015 | 23.036 | 22.892 | 19.503 |
| 11.535830004166668 | 23.036 | 22.915 | 19.506 |
| 11.542619255555556 | 23.051 | 22.905 | 19.516 |
| 11.549454319444445 | 23.054 | 22.902 | 19.524 |
| 11.55624495638889 | 23.031 | 22.915 | 19.516 |
| 11.563095308888888 | 23.018 | 22.897 | 19.524 |
| 11.5698693025 | 23.041 | 22.91 | 19.506 |
| 11.576658546388888 | 23.041 | 22.91 | 19.513 |
| 11.583463066944445 | 23.033 | 22.905 | 19.524 |
| 11.59023705611111 | 23.031 | 22.917 | 19.521 |
| 11.597087468611111 | 23.049 | 22.933 | 19.526 |
| 11.603861388333332 | 23.033 | 22.907 | 19.524 |
| 11.610650634722221 | 23.036 | 22.92 | 19.521 |
| 11.617455165833306 | 23.049 | 22.938 | 19.518 |
| 11.624230536666667 | 23.049 | 22.928 | 19.513 |
| 11.631065612222223 | 23.064 | 22.93 | 19.524 |
| 11.637854876666667 | 23.038 | 22.935 | 19.524 |
| 11.644628844999971 | 23.046 | 22.923 | 19.521 |
| 11.651463936666666 | 23.049 | 22.925 | 19.521 |
| 11.658207345833333 | 23.041 | 22.925 | 19.513 |
| 11.665042431111111 | 23.041 | 22.917 | 19.534 |
| 11.671816418888888 | 23.069 | 22.93 | 19.511 |
| 11.678620953888888 | 23.046 | 22.928 | 19.518 |
| 11.68541029 | 23.03 | 22.908 | 19.495 |
| 11.692170288055555 | 22.991 | 22.871 | 19.435 |
| 11.698974814444444 | 23.002 | 22.876 | 19.427 |
| 11.705794614166665 | 22.976 | 22.856 | 19.395 |
| 11.712614425277778 | 22.996 | 22.888 | 19.424 |
| 11.71940367 | 22.976 | 22.86 | 19.424 |
| 11.726177655 | 22.995 | 22.865 | 19.44 |
| 11.732982180277777 | 22.986 | 22.871 | 19.45 |
| 11.73981726888889 | 22.989 | 22.87 | 19.445 |
| 11.746606517222222 | 23.012 | 22.875 | 19.44 |
| 11.753426315277776 | 22.986 | 22.865 | 19.463 |
| 11.76018641388889 | 23.012 | 22.886 | 19.453 |
| 11.76697565888889 | 23.004 | 22.878 | 19.458 |
| 11.773826031666667 | 22.991 | 22.881 | 19.455 |
| 11.780554169166667 | 22.991 | 22.87 | 19.458 |
| 11.787343513611113 | 22.996 | 22.893 | 19.466 |
| 11.794147955277777 | 22.996 | 22.883 | 19.45 |
| 11.800967750833333 | 22.991 | 22.875 | 19.466 |
| 11.807772281944445 | 22.994 | 22.881 | 19.45 |
| 11.814592089166666 | 22.996 | 22.886 | 19.455 |
| 11.821396619166666 | 23.009 | 22.875 | 19.458 |
| 11.828171985 | 23.012 | 22.875 | 19.443 |
| 11.835022345833334 | 23.009 | 22.886 | 19.461 |
| 11.841735214166667 | 23.004 | 22.901 | 19.484 |
| 11.848585573333335 | 23.019 | 22.893 | 19.453 |
| 11.855313729166667 | 23.004 | 22.886 | 19.453 |
| 11.862133531388888 | 23.001 | 22.896 | 19.461 |
| 11.868953327777778 | 23.007 | 22.893 | 19.466 |
| 11.875727317222223 | 23.004 | 22.875 | 19.455 |
| 11.882501281944444 | 22.996 | 22.901 | 19.445 |
| 11.889336371666666 | 23.024 | 22.891 | 19.463 |
| 11.896111730833333 | 23.014 | 22.898 | 19.45 |
| 11.902870475833334 | 23.017 | 22.883 | 19.45 |
| 11.909720786944444 | 22.996 | 22.891 | 19.468 |
| 11.916510050833333 | 22.999 | 22.896 | 19.44 |
| 11.923284028333335 | 23.002 | 22.867 | 19.445 |
| 11.930088560833333 | 22.981 | 22.871 | 19.437 |
| 11.936877811111112 | 22.974 | 22.853 | 19.397 |
| 11.943682337777776 | 22.94 | 22.818 | 19.358 |
| 11.950517418611112 | 22.916 | 22.829 | 19.337 |
| 11.957276124166667 | 22.958 | 22.833 | 19.392 |
| 11.964127856944446 | 22.938 | 22.838 | 19.405 |
| 11.970932399166665 | 22.954 | 22.833 | 19.413 |
| 11.977660555277778 | 22.954 | 22.831 | 19.41 |
| 11.984449796666667 | 22.972 | 22.844 | 19.41 |
| 11.991300147499999 | 22.959 | 22.841 | 19.4 |
| 11.998094991388887 | 22.959 | 22.838 | 19.4 |
| 12.0048939375 | 22.954 | 22.816 | 19.403 |
| 12.01166790611111 | 22.954 | 22.836 | 19.395 |
| 12.01848771138889 | 22.944 | 22.841 | 19.403 |
| 12.025261694444444 | 22.962 | 22.833 | 19.418 |
| 12.032067603888889 | 22.975 | 22.833 | 19.408 |
| 12.03885686611111 | 22.977 | 22.821 | 19.405 |
| 12.045691956666667 | 22.954 | 22.859 | 19.413 |
| 12.05246592111111 | 22.957 | 22.836 | 19.398 |
| 12.05931627388889 | 22.97 | 22.838 | 19.416 |
| 12.066044433055556 | 22.972 | 22.844 | 19.421 |
| 12.072833685833332 | 22.952 | 22.854 | 19.408 |
| 12.079607665 | 22.972 | 22.844 | 19.431 |
| 12.08642746111111 | 22.965 | 22.849 | 19.408 |
| 12.093262549166665 | 22.97 | 22.828 | 19.413 |
| 12.100068529722222 | 22.97 | 22.844 | 19.41 |
| 12.10684243861111 | 22.977 | 22.851 | 19.41 |
| 12.113631708888889 | 22.967 | 22.841 | 19.41 |
| 12.120451496388888 | 22.965 | 22.846 | 19.405 |
| 12.127194923333334 | 22.977 | 22.846 | 19.413 |
| 12.134060560833333 | 22.982 | 22.874 | 19.4 |
| 12.140819262777779 | 22.993 | 22.841 | 19.403 |
| 12.147577966666667 | 22.96 | 22.843 | 19.387 |
| 12.15438250138889 | 22.95 | 22.833 | 19.387 |
| 12.161217568333333 | 22.942 | 22.819 | 19.348 |
| 12.167992967222222 | 22.938 | 22.829 | 19.345 |
| 12.174797464722223 | 22.912 | 22.795 | 19.339 |
| 12.181571440277777 | 22.924 | 22.813 | 19.339 |
| 12.18840655888889 | 22.905 | 22.776 | 19.358 |
| 12.195149950555555 | 22.925 | 22.786 | 19.358 |
| 12.201954476666668 | 22.915 | 22.796 | 19.347 |
| 12.208774308055554 | 22.912 | 22.784 | 19.368 |
| 12.2155635375 | 22.91 | 22.807 | 19.332 |
| 12.222413897777777 | 22.925 | 22.804 | 19.342 |
| 12.229218421111112 | 22.907 | 22.802 | 19.329 |
| 12.235993790555556 | 22.93 | 22.802 | 19.329 |
| 12.242752487222221 | 22.917 | 22.784 | 19.35 |
| 12.249602841388889 | 22.93 | 22.802 | 19.34 |
| 12.256376829444445 | 22.935 | 22.791 | 19.342 |
| 12.263181345833333 | 22.917 | 22.789 | 19.35 |
| 12.26995533 | 22.935 | 22.796 | 19.363 |
| 12.276790417222223 | 22.925 | 22.794 | 19.365 |
| 12.283503285 | 22.92 | 22.814 | 19.353 |
| 12.290368913333333 | 22.922 | 22.809 | 19.35 |
| 12.297142894166667 | 22.92 | 22.799 | 19.363 |
| 12.303979359166666 | 22.928 | 22.809 | 19.347 |
| 12.310753349444443 | 22.925 | 22.809 | 19.347 |
| 12.317573149722222 | 22.933 | 22.794 | 19.36 |
| 12.324347139444445 | 22.922 | 22.789 | 19.353 |
| 12.331151648055556 | 22.94 | 22.812 | 19.36 |
| 12.337925627222223 | 22.938 | 22.812 | 19.358 |
| 12.344775994722221 | 22.92 | 22.804 | 19.347 |
| 12.351549974166666 | 22.94 | 22.804 | 19.36 |
| 12.358369771111112 | 22.925 | 22.812 | 19.35 |
| 12.365067373611112 | 22.92 | 22.819 | 19.353 |
| 12.371873285277777 | 22.948 | 22.832 | 19.347 |
| 12.378738916944444 | 22.916 | 22.812 | 19.357 |
| 12.385512896944444 | 22.918 | 22.807 | 19.332 |
| 12.392302154722222 | 22.871 | 22.765 | 19.248 |
| 12.399137224444445 | 22.869 | 22.752 | 19.247 |
| 12.4059112025 | 22.848 | 22.735 | 19.239 |
| 12.412715726944445 | 22.869 | 22.744 | 19.247 |
| 12.419504992777778 | 22.852 | 22.754 | 19.266 |
| 12.426294240277779 | 22.878 | 22.74 | 19.271 |
| 12.433068232222222 | 22.886 | 22.752 | 19.282 |
| 12.439919959166668 | 22.88 | 22.747 | 19.289 |
| 12.44669394722222 | 22.87 | 22.754 | 19.287 |
| 12.453498473611111 | 22.88 | 22.762 | 19.295 |
| 12.460272463055555 | 22.883 | 22.744 | 19.289 |
| 12.467092255833332 | 22.873 | 22.754 | 19.287 |
| 12.473866230555554 | 22.873 | 22.767 | 19.295 |
| 12.480686051666668 | 22.886 | 22.757 | 19.305 |
| 12.4875211075 | 22.893 | 22.775 | 19.289 |
| 12.494264551388888 | 22.888 | 22.772 | 19.284 |
| 12.50103851861111 | 22.873 | 22.752 | 19.287 |
| 12.50785971388889 | 22.875 | 22.767 | 19.271 |
| 12.514679515555555 | 22.878 | 22.767 | 19.295 |
| 12.521484041666668 | 22.873 | 22.752 | 19.302 |
| 12.528273299444445 | 22.878 | 22.765 | 19.282 |
| 12.535077852222223 | 22.88 | 22.772 | 19.284 |
| 12.541851805 | 22.888 | 22.765 | 19.289 |
| 12.548625789166666 | 22.888 | 22.78 | 19.284 |
| 12.55546089361111 | 22.878 | 22.762 | 19.289 |
| 12.562234841388888 | 22.873 | 22.754 | 19.287 |
| 12.569024091388888 | 22.883 | 22.777 | 19.284 |
| 12.5757994625 | 22.898 | 22.775 | 19.284 |
| 12.582634543611112 | 22.888 | 22.76 | 19.297 |
| 12.589439073333335 | 22.893 | 22.76 | 19.287 |
| 12.596243594166667 | 22.896 | 22.777 | 19.292 |
| 12.6030175775 | 22.888 | 22.765 | 19.295 |
| 12.609852658611112 | 22.883 | 22.788 | 19.302 |
| 12.616657195555554 | 22.883 | 22.755 | 19.263 |
| 12.623431166666666 | 22.888 | 22.76 | 19.289 |
| 12.63020515388889 | 22.839 | 22.713 | 19.206 |
| 12.637024942500002 | 22.834 | 22.733 | 19.211 |
| 12.643815595555557 | 22.821 | 22.7 | 19.213 |
| 12.650665943055555 | 22.833 | 22.711 | 19.224 |
| 12.657439922777778 | 22.832 | 22.71 | 19.234 |
| 12.664244444444444 | 22.833 | 22.7 | 19.25 |
| 12.671018428333332 | 22.837 | 22.7 | 19.2 |
| 12.677792407777776 | 22.842 | 22.718 | 19.221 |
| 12.684566384444445 | 22.833 | 22.679 | 19.237 |
| 12.691370917777778 | 22.828 | 22.738 | 19.247 |
| 12.698144896944443 | 22.838 | 22.72 | 19.216 |
| 12.705025801944444 | 22.833 | 22.718 | 19.232 |
| 12.711785884166666 | 22.833 | 22.72 | 19.232 |
| 12.71855986361111 | 22.823 | 22.723 | 19.221 |
| 12.725349120277778 | 22.828 | 22.718 | 19.232 |
| 12.732199479999998 | 22.844 | 22.733 | 19.216 |
| 12.7390192775 | 22.844 | 22.72 | 19.232 |
| 12.745839086388887 | 22.844 | 22.733 | 19.244 |
| 12.752613059166666 | 22.844 | 22.723 | 19.242 |
| 12.759417588333333 | 22.836 | 22.718 | 19.242 |
| 12.766176296388888 | 22.849 | 22.723 | 19.221 |
| 12.772965551111112 | 22.838 | 22.718 | 19.239 |
| 12.779771458611112 | 22.851 | 22.718 | 19.239 |
| 12.786545436666666 | 22.849 | 22.712 | 19.242 |
| 12.793319425833335 | 22.841 | 22.715 | 19.237 |
| 12.800185053611111 | 22.849 | 22.733 | 19.247 |
| 12.8069590525 | 22.838 | 22.72 | 19.232 |
| 12.813840020277778 | 22.844 | 22.712 | 19.232 |
| 12.820506994166667 | 22.846 | 22.733 | 19.244 |
| 12.827342079722195 | 22.849 | 22.707 | 19.237 |
| 12.834100770000001 | 22.841 | 22.702 | 19.221 |
| 12.840920603055554 | 22.844 | 22.72 | 19.237 |
| 12.847741759166666 | 22.856 | 22.715 | 19.234 |
| 12.854469918333333 | 22.854 | 22.733 | 19.226 |
| 12.861289721944445 | 22.832 | 22.717 | 19.213 |
| 12.868140074722222 | 22.836 | 22.743 | 19.247 |
| 12.874914049444417 | 22.847 | 22.728 | 19.236 |
| 12.881733861111112 | 22.796 | 22.704 | 19.19 |
| 12.888507831944445 | 22.825 | 22.693 | 19.179 |
| 12.89528180888886 | 22.768 | 22.682 | 19.088 |
| 12.902086346944444 | 22.777 | 22.674 | 19.137 |
| 12.908951977777779 | 22.788 | 22.69 | 19.218 |
| 12.915712068888888 | 22.784 | 22.674 | 19.179 |
| 12.92248605888889 | 22.802 | 22.663 | 19.194 |
| 12.9292600175 | 22.796 | 22.655 | 19.174 |
| 12.936171473611111 | 22.786 | 22.676 | 19.176 |
| 12.942914917222222 | 22.789 | 22.678 | 19.181 |
| 12.949719435277778 | 22.796 | 22.673 | 19.192 |
| 12.956478139722222 | 22.781 | 22.676 | 19.194 |
| 12.963252112777779 | 22.784 | 22.693 | 19.189 |
| 12.970117745833333 | 22.789 | 22.678 | 19.176 |
| 12.976891728888889 | 22.799 | 22.663 | 19.189 |
| 12.983667090833332 | 22.796 | 22.681 | 19.179 |
| 12.990502188611112 | 22.784 | 22.678 | 19.158 |
| 12.99729141777778 | 22.807 | 22.683 | 19.176 |
| 13.004095960277777 | 22.804 | 22.676 | 19.158 |
| 13.010885196666667 | 22.794 | 22.665 | 19.174 |
| 13.017643908611111 | 22.799 | 22.691 | 19.171 |
| 13.024494261666668 | 22.809 | 22.688 | 19.192 |
| 13.031252965277778 | 22.807 | 22.678 | 19.158 |
| 13.038042222777777 | 22.809 | 22.686 | 19.161 |
| 13.044892575833334 | 22.794 | 22.678 | 19.174 |
| 13.051652673888889 | 22.812 | 22.678 | 19.181 |
| 13.058457225 | 22.791 | 22.676 | 19.169 |
| 13.065231191388888 | 22.809 | 22.681 | 19.166 |
| 13.072020433611112 | 22.812 | 22.699 | 19.176 |
| 13.0787944 | 22.796 | 22.673 | 19.174 |
| 13.085629476666666 | 22.809 | 22.673 | 19.169 |
| 13.092434018333334 | 22.819 | 22.691 | 19.174 |
| 13.099207982222223 | 22.807 | 22.673 | 19.181 |
| 13.106058368333333 | 22.807 | 22.691 | 19.166 |
| 13.11278649722222 | 22.794 | 22.686 | 19.169 |
| 13.119592418611111 | 22.812 | 22.678 | 19.169 |
| 13.126396943888862 | 22.794 | 22.678 | 19.174 |
| 13.133247292777778 | 22.791 | 22.658 | 19.127 |
| 13.13997545111111 | 22.729 | 22.649 | 19.1 |
| 13.146825808611112 | 22.738 | 22.636 | 19.079 |
| 13.153584510277778 | 22.736 | 22.634 | 19.097 |
| 13.160434873611111 | 22.726 | 22.63 | 19.082 |
| 13.167224116944444 | 22.733 | 22.626 | 19.111 |
| 13.173998087777777 | 22.749 | 22.623 | 19.121 |
| 13.180772170277779 | 22.744 | 22.634 | 19.126 |
| 13.18760714611111 | 22.739 | 22.646 | 19.098 |
| 13.1943978 | 22.749 | 22.618 | 19.116 |
| 13.201202331666666 | 22.76 | 22.621 | 19.121 |
| 13.207991583888889 | 22.749 | 22.631 | 19.116 |
| 13.214765558888889 | 22.734 | 22.639 | 19.113 |
| 13.22157010888889 | 22.737 | 22.613 | 19.116 |
| 13.228344059722222 | 22.739 | 22.631 | 19.124 |
| 13.235148591388889 | 22.765 | 22.636 | 19.098 |
| 13.241953124444445 | 22.749 | 22.623 | 19.121 |
| 13.248742384444446 | 22.754 | 22.641 | 19.113 |
| 13.255592730555556 | 22.731 | 22.628 | 19.124 |
| 13.262368094166666 | 22.747 | 22.626 | 19.098 |
| 13.269203174166666 | 22.737 | 22.646 | 19.124 |
| 13.275977154166666 | 22.754 | 22.641 | 19.108 |
| 13.28275114 | 22.76 | 22.641 | 19.111 |
| 13.289555662222222 | 22.767 | 22.639 | 19.131 |
| 13.296329652222221 | 22.752 | 22.634 | 19.105 |
| 13.303149444444445 | 22.737 | 22.646 | 19.118 |
| 13.309923414722222 | 22.742 | 22.634 | 19.126 |
| 13.316743224166668 | 22.739 | 22.641 | 19.131 |
| 13.323578304166666 | 22.749 | 22.634 | 19.113 |
| 13.330353669166666 | 22.757 | 22.646 | 19.118 |
| 13.337142939444444 | 22.749 | 22.639 | 19.118 |
| 13.343947471666667 | 22.752 | 22.634 | 19.121 |
| 13.3507214275 | 22.76 | 22.636 | 19.103 |
| 13.357571786944446 | 22.762 | 22.631 | 19.126 |
| 13.364345761944444 | 22.762 | 22.649 | 19.118 |
| 13.371119830555555 | 22.739 | 22.631 | 19.139 |
| 13.377847899444445 | 22.736 | 22.619 | 19.087 |
| 13.384713522777778 | 22.697 | 22.607 | 19.042 |
| 13.39151804277778 | 22.709 | 22.609 | 19.058 |
| 13.398278140833305 | 22.679 | 22.553 | 19.013 |
| 13.405067398888889 | 22.687 | 22.553 | 19.019 |
| 13.411887198055556 | 22.678 | 22.592 | 19.042 |
| 13.418691735277777 | 22.707 | 22.586 | 19.068 |
| 13.425465710555555 | 22.703 | 22.574 | 19.04 |
| 13.432331338333334 | 22.702 | 22.594 | 19.058 |
| 13.439105313333334 | 22.723 | 22.599 | 19.055 |
| 13.445909840277778 | 22.702 | 22.586 | 19.068 |
| 13.452668548888889 | 22.707 | 22.579 | 19.06 |
| 13.459443934166666 | 22.7 | 22.592 | 19.063 |
| 13.466294271944443 | 22.692 | 22.589 | 19.053 |
| 13.473098800277777 | 22.718 | 22.599 | 19.053 |
| 13.479872776111112 | 22.705 | 22.584 | 19.055 |
| 13.486677316666666 | 22.71 | 22.589 | 19.066 |
| 13.493451288333333 | 22.702 | 22.584 | 19.066 |
| 13.500286367222222 | 22.72 | 22.592 | 19.076 |
| 13.50706034388889 | 22.702 | 22.602 | 19.071 |
| 13.513849601944445 | 22.707 | 22.586 | 19.055 |
| 13.520699951666668 | 22.71 | 22.579 | 19.06 |
| 13.527458656666667 | 22.718 | 22.597 | 19.05 |
| 13.5342492925 | 22.718 | 22.592 | 19.053 |
| 13.541053824999999 | 22.705 | 22.579 | 19.068 |
| 13.547827806944444 | 22.707 | 22.579 | 19.05 |
| 13.554678156944444 | 22.725 | 22.597 | 19.073 |
| 13.561467410555556 | 22.707 | 22.597 | 19.053 |
| 13.568333035555556 | 22.702 | 22.594 | 19.066 |
| 13.575000088888888 | 22.72 | 22.604 | 19.076 |
| 13.581865719166668 | 22.702 | 22.581 | 19.068 |
| 13.588670250833333 | 22.723 | 22.592 | 19.071 |
| 13.595490061666666 | 22.718 | 22.592 | 19.068 |
| 13.602234873333334 | 22.718 | 22.599 | 19.037 |
| 13.608993574722222 | 22.725 | 22.612 | 19.035 |
| 13.615813403333332 | 22.693 | 22.594 | 19.034 |
| 13.622633174444443 | 22.71 | 22.599 | 19.055 |
| 13.629407165833333 | 22.686 | 22.58 | 19.016 |
| 13.636196415833332 | 22.691 | 22.564 | 19.016 |
| 13.642970391666667 | 22.694 | 22.576 | 19.034 |
| 13.649836025833306 | 22.665 | 22.546 | 18.961 |
| 13.656640544999998 | 22.649 | 22.552 | 18.987 |
| 13.663414527222223 | 22.664 | 22.527 | 18.982 |
| 13.670205169166668 | 22.665 | 22.539 | 18.99 |
| 13.676963890833333 | 22.667 | 22.527 | 18.987 |
| 13.683783685 | 22.65 | 22.547 | 19.01 |
| 13.690618789444445 | 22.67 | 22.524 | 19.021 |
| 13.697423282499999 | 22.66 | 22.537 | 18.992 |
| 13.704182001388888 | 22.663 | 22.527 | 18.997 |
| 13.710971253055554 | 22.655 | 22.537 | 18.982 |
| 13.717745219166668 | 22.655 | 22.537 | 18.987 |
| 13.724595573333305 | 22.642 | 22.539 | 18.987 |
| 13.731369554166667 | 22.658 | 22.557 | 18.99 |
| 13.738129636944445 | 22.668 | 22.552 | 18.987 |
| 13.744949452222194 | 22.66 | 22.55 | 18.992 |
| 13.751769258055555 | 22.67 | 22.557 | 19.018 |
| 13.758573777777777 | 22.647 | 22.552 | 19.005 |
| 13.765378305833332 | 22.642 | 22.547 | 19.003 |
| 13.772121740833335 | 22.668 | 22.547 | 18.995 |
| 13.7789262675 | 22.678 | 22.542 | 18.995 |
| 13.785746077222221 | 22.665 | 22.539 | 19.003 |
| 13.792520050277778 | 22.67 | 22.539 | 18.997 |
| 13.799324571666638 | 22.665 | 22.537 | 18.992 |
| 13.8061763175 | 22.681 | 22.544 | 18.995 |
| 13.812919745277776 | 22.64 | 22.552 | 19.005 |
| 13.819724279722221 | 22.683 | 22.544 | 19.018 |
| 13.826544085833332 | 22.655 | 22.555 | 18.997 |
| 13.8333638875 | 22.66 | 22.547 | 19.005 |
| 13.840198975833333 | 22.655 | 22.542 | 19.005 |
| 13.846927118055556 | 22.673 | 22.547 | 18.99 |
| 13.8537010925 | 22.647 | 22.532 | 19.013 |
| 13.86047507 | 22.67 | 22.542 | 19.013 |
| 13.867325435277778 | 22.66 | 22.552 | 18.99 |
| 13.874131343333334 | 22.678 | 22.55 | 19.003 |
| 13.880905333055555 | 22.681 | 22.544 | 18.995 |
| 13.887679303888888 | 22.641 | 22.522 | 18.94 |
| 13.894499105555555 | 22.67 | 22.547 | 18.997 |
| 13.901318921666668 | 22.635 | 22.512 | 18.952 |
| 13.908092895277779 | 22.62 | 22.51 | 18.947 |
| 13.914927981388889 | 22.608 | 22.499 | 18.952 |
| 13.92170194527775 | 22.607 | 22.497 | 18.95 |
| 13.928491202777778 | 22.607 | 22.485 | 18.934 |
| 13.935265176111082 | 22.627 | 22.492 | 18.929 |
| 13.942116919444445 | 22.623 | 22.479 | 18.958 |
| 13.948890893055555 | 22.595 | 22.482 | 18.945 |
| 13.95574126888889 | 22.611 | 22.5 | 18.952 |
| 13.962454127777779 | 22.6 | 22.5 | 18.94 |
| 13.969243378611111 | 22.598 | 22.485 | 18.945 |
| 13.976078467222223 | 22.613 | 22.492 | 18.96 |
| 13.98288299 | 22.623 | 22.487 | 18.963 |
| 13.989656977222223 | 22.623 | 22.49 | 18.94 |
| 13.996492052222223 | 22.606 | 22.487 | 18.95 |
| 14.003281298055555 | 22.626 | 22.5 | 18.947 |
| 14.010087223888888 | 22.606 | 22.485 | 18.96 |
| 14.016861198055556 | 22.613 | 22.508 | 18.95 |
| 14.02363518361111 | 22.611 | 22.5 | 18.927 |
| 14.030439802777778 | 22.598 | 22.497 | 18.94 |
| 14.037213680833334 | 22.621 | 22.495 | 18.927 |
| 14.044048768888889 | 22.623 | 22.502 | 18.94 |
| 14.0508227425 | 22.613 | 22.518 | 18.947 |
| 14.057673096944445 | 22.634 | 22.495 | 18.932 |
| 14.064431808055556 | 22.618 | 22.513 | 18.95 |
| 14.07123632861111 | 22.634 | 22.5 | 18.945 |
| 14.078011703055555 | 22.608 | 22.495 | 18.963 |
| 14.084846783333333 | 22.616 | 22.5 | 18.937 |
| 14.091651315 | 22.603 | 22.515 | 18.921 |
| 14.098455835833335 | 22.595 | 22.492 | 18.945 |
| 14.105229828333334 | 22.608 | 22.5 | 18.932 |
| 14.112003780555556 | 22.616 | 22.497 | 18.94 |
| 14.118762499166666 | 22.618 | 22.49 | 18.955 |
| 14.125582289444445 | 22.629 | 22.492 | 18.924 |
| 14.132417379166666 | 22.611 | 22.508 | 18.968 |
| 14.139191354166668 | 22.621 | 22.51 | 18.958 |
| 14.146058372777778 | 22.616 | 22.502 | 18.947 |
| 14.152832354444444 | 22.575 | 22.462 | 18.905 |
| 14.159606338611113 | 22.566 | 22.458 | 18.879 |
| 14.166380304444445 | 22.558 | 22.445 | 18.881 |
| 14.173154282222221 | 22.559 | 22.435 | 18.879 |
| 14.179958849166638 | 22.559 | 22.445 | 18.889 |
| 14.1867938925 | 22.576 | 22.44 | 18.876 |
| 14.193598432777778 | 22.564 | 22.437 | 18.895 |
| 14.200372394722223 | 22.556 | 22.45 | 18.889 |
| 14.207146385833335 | 22.564 | 22.455 | 18.913 |
| 14.21399811888889 | 22.566 | 22.455 | 18.876 |
| 14.220802736944444 | 22.576 | 22.458 | 18.879 |
| 14.227591908888888 | 22.551 | 22.463 | 18.887 |
| 14.234365879166667 | 22.569 | 22.463 | 18.895 |
| 14.241139860555554 | 22.574 | 22.427 | 18.887 |
| 14.247959660000001 | 22.556 | 22.44 | 18.913 |
| 14.254733640833333 | 22.579 | 22.453 | 18.907 |
| 14.261507615 | 22.551 | 22.468 | 18.9 |
| 14.2683121575 | 22.564 | 22.45 | 18.892 |
| 14.275162504444443 | 22.569 | 22.453 | 18.884 |
| 14.281922600833333 | 22.574 | 22.458 | 18.879 |
| 14.288757686944443 | 22.574 | 22.443 | 18.895 |
| 14.295531651388888 | 22.571 | 22.432 | 18.905 |
| 14.302305623055554 | 22.569 | 22.453 | 18.895 |
| 14.309079663055556 | 22.564 | 22.458 | 18.902 |
| 14.315914700555556 | 22.579 | 22.466 | 18.889 |
| 14.322749783055555 | 22.571 | 22.463 | 18.882 |
| 14.329523765833335 | 22.587 | 22.458 | 18.897 |
| 14.336267169444444 | 22.556 | 22.466 | 18.9 |
| 14.343132803333333 | 22.556 | 22.458 | 18.892 |
| 14.349923453611112 | 22.574 | 22.445 | 18.887 |
| 14.3567432575 | 22.548 | 22.466 | 18.876 |
| 14.36350195638889 | 22.579 | 22.45 | 18.889 |
| 14.37024539138889 | 22.569 | 22.443 | 18.892 |
| 14.377202671111112 | 22.561 | 22.458 | 18.9 |
| 14.383869715555557 | 22.574 | 22.45 | 18.889 |
| 14.390689524999999 | 22.594 | 22.448 | 18.902 |
| 14.39752460611111 | 22.572 | 22.445 | 18.892 |
| 14.404298595833305 | 22.569 | 22.468 | 18.884 |
| 14.411103120555556 | 22.577 | 22.452 | 18.889 |
| 14.4178937475 | 22.518 | 22.441 | 18.847 |
| 14.424667720555556 | 22.527 | 22.408 | 18.831 |
| 14.431441719722194 | 22.509 | 22.383 | 18.792 |
| 14.438261506944444 | 22.516 | 22.407 | 18.79 |
| 14.4450965875 | 22.499 | 22.402 | 18.8 |
| 14.451870578333335 | 22.54 | 22.395 | 18.834 |
| 14.458659817500001 | 22.522 | 22.401 | 18.819 |
| 14.465510167500002 | 22.524 | 22.39 | 18.816 |
| 14.472253607222223 | 22.534 | 22.408 | 18.829 |
| 14.479088686388861 | 22.517 | 22.401 | 18.837 |
| 14.485833502777778 | 22.514 | 22.395 | 18.821 |
| 14.492653300555556 | 22.529 | 22.416 | 18.842 |
| 14.499457835555555 | 22.527 | 22.398 | 18.85 |
| 14.506231815 | 22.517 | 22.395 | 18.829 |
| 14.513082164444445 | 22.514 | 22.393 | 18.837 |
| 14.519871410555556 | 22.529 | 22.413 | 18.829 |
| 14.526675949722222 | 22.522 | 22.385 | 18.839 |
| 14.533449921666666 | 22.524 | 22.378 | 18.844 |
| 14.540223909444444 | 22.506 | 22.408 | 18.842 |
| 14.547028432222222 | 22.529 | 22.413 | 18.826 |
| 14.553909360277778 | 22.534 | 22.393 | 18.837 |
| 14.560623600555555 | 22.517 | 22.408 | 18.834 |
| 14.567428133611111 | 22.547 | 22.408 | 18.829 |
| 14.574202117222223 | 22.519 | 22.395 | 18.839 |
| 14.581006641944445 | 22.517 | 22.383 | 18.842 |
| 14.587826453888889 | 22.511 | 22.385 | 18.842 |
| 14.594600425833333 | 22.514 | 22.411 | 18.834 |
| 14.601450780555556 | 22.522 | 22.424 | 18.808 |
| 14.608255306111111 | 22.524 | 22.418 | 18.842 |
| 14.615014009722222 | 22.529 | 22.395 | 18.834 |
| 14.621819931388888 | 22.529 | 22.408 | 18.842 |
| 14.628593901944445 | 22.527 | 22.403 | 18.839 |
| 14.635398434444445 | 22.509 | 22.398 | 18.844 |
| 14.64217242111111 | 22.529 | 22.411 | 18.829 |
| 14.649038034722222 | 22.54 | 22.421 | 18.855 |
| 14.65578146388889 | 22.519 | 22.401 | 18.85 |
| 14.662647100833333 | 22.529 | 22.418 | 18.834 |
| 14.669390545277777 | 22.525 | 22.403 | 18.844 |
| 14.676164589722221 | 22.524 | 22.413 | 18.834 |
| 14.68299958138889 | 22.481 | 22.378 | 18.766 |
| 14.689729124999973 | 22.501 | 22.374 | 18.808 |
| 14.696579484722221 | 22.449 | 22.346 | 18.742 |
| 14.703368733333333 | 22.464 | 22.348 | 18.774 |
| 14.710142708888888 | 22.457 | 22.336 | 18.784 |
| 14.716962515277778 | 22.464 | 22.361 | 18.787 |
| 14.72379759638889 | 22.459 | 22.343 | 18.787 |
| 14.730571591111111 | 22.49 | 22.341 | 18.771 |
| 14.737345548333305 | 22.472 | 22.348 | 18.768 |
| 14.744119523333334 | 22.462 | 22.359 | 18.774 |
| 14.75093933888889 | 22.475 | 22.354 | 18.774 |
| 14.757745269166666 | 22.487 | 22.361 | 18.771 |
| 14.764519227499973 | 22.459 | 22.366 | 18.784 |
| 14.77136959638889 | 22.462 | 22.359 | 18.774 |
| 14.778174111666639 | 22.462 | 22.369 | 18.784 |
| 14.784948094444443 | 22.467 | 22.351 | 18.768 |
| 14.791722077222223 | 22.454 | 22.348 | 18.768 |
| 14.798480783333334 | 22.457 | 22.343 | 18.763 |
| 14.805300573333334 | 22.454 | 22.366 | 18.794 |
| 14.812120374722223 | 22.462 | 22.348 | 18.766 |
| 14.818909628333333 | 22.477 | 22.366 | 18.761 |
| 14.825760000277777 | 22.48 | 22.366 | 18.784 |
| 14.832504802777779 | 22.467 | 22.366 | 18.771 |
| 14.839294053055557 | 22.462 | 22.369 | 18.766 |
| 14.846098591944445 | 22.477 | 22.369 | 18.774 |
| 14.852872594722221 | 22.472 | 22.361 | 18.794 |
| 14.859677085833333 | 22.459 | 22.371 | 18.779 |
| 14.866527541111111 | 22.482 | 22.366 | 18.763 |
| 14.873301426388888 | 22.459 | 22.351 | 18.784 |
| 14.88010595388889 | 22.47 | 22.348 | 18.758 |
| 14.886895208055556 | 22.439 | 22.374 | 18.763 |
| 14.893670577222222 | 22.464 | 22.346 | 18.774 |
| 14.900582037777777 | 22.485 | 22.359 | 18.776 |
| 14.907279635555556 | 22.468 | 22.351 | 18.758 |
| 14.914053613888887 | 22.48 | 22.361 | 18.753 |
| 14.920873416944444 | 22.451 | 22.349 | 18.758 |
| 14.927677945833333 | 22.442 | 22.334 | 18.739 |
| 14.934451923333333 | 22.406 | 22.304 | 18.697 |
| 14.941287009444444 | 22.398 | 22.289 | 18.689 |
| 14.948060985000001 | 22.399 | 22.304 | 18.697 |
| 14.954896061944446 | 22.4 | 22.286 | 18.679 |
| 14.96168532361111 | 22.413 | 22.306 | 18.703 |
| 14.968430133055556 | 22.422 | 22.304 | 18.693 |
| 14.975234654722222 | 22.411 | 22.291 | 18.708 |
| 14.98200863138889 | 22.422 | 22.296 | 18.708 |
| 14.98888954 | 22.408 | 22.309 | 18.703 |
| 14.995739894444444 | 22.435 | 22.299 | 18.721 |
| 15.002483317222222 | 22.407 | 22.291 | 18.721 |
| 15.009242027777779 | 22.417 | 22.296 | 18.726 |
| 15.016031278055555 | 22.415 | 22.291 | 18.698 |
| 15.022835810555554 | 22.415 | 22.301 | 18.739 |
| 15.029641732777778 | 22.42 | 22.301 | 18.726 |
| 15.036415706388889 | 22.399 | 22.299 | 18.716 |
| 15.043266053611111 | 22.41 | 22.309 | 18.716 |
| 15.050040040833332 | 22.415 | 22.309 | 18.718 |
| 15.056798738888862 | 22.425 | 22.299 | 18.705 |
| 15.063633820555555 | 22.415 | 22.309 | 18.705 |
| 15.07043835361111 | 22.42 | 22.299 | 18.695 |
| 15.077227610000001 | 22.42 | 22.286 | 18.716 |
| 15.084016870555555 | 22.42 | 22.291 | 18.7 |
| 15.090806115 | 22.42 | 22.322 | 18.708 |
| 15.0976411925 | 22.43 | 22.306 | 18.726 |
| 15.104447102499972 | 22.422 | 22.304 | 18.713 |
| 15.111175260833333 | 22.417 | 22.312 | 18.711 |
| 15.118025611944445 | 22.417 | 22.317 | 18.723 |
| 15.124814874722222 | 22.44 | 22.319 | 18.729 |
| 15.131588855555554 | 22.412 | 22.322 | 18.721 |
| 15.138423925277749 | 22.412 | 22.329 | 18.705 |
| 15.145243729166666 | 22.415 | 22.314 | 18.723 |
| 15.152017716944416 | 22.42 | 22.314 | 18.726 |
| 15.158776405 | 22.417 | 22.314 | 18.721 |
| 15.165582322777777 | 22.42 | 22.322 | 18.721 |
| 15.172356305555555 | 22.422 | 22.314 | 18.726 |
| 15.179191390555555 | 22.425 | 22.314 | 18.736 |
| 15.185965359166667 | 22.433 | 22.317 | 18.736 |
| 15.192800436111112 | 22.425 | 22.304 | 18.721 |
| 15.19957441861111 | 22.435 | 22.296 | 18.739 |
| 15.206378961666639 | 22.433 | 22.305 | 18.747 |
| 15.2131834775 | 22.43 | 22.327 | 18.758 |
| 15.219957450555555 | 22.445 | 22.318 | 18.792 |
| 15.226807806111111 | 22.413 | 22.295 | 18.726 |
| 15.233566608611111 | 22.389 | 22.274 | 18.718 |
| 15.240372431388888 | 22.377 | 22.264 | 18.684 |
| 15.247146472499999 | 22.38 | 22.279 | 18.666 |
| 15.253920388333306 | 22.375 | 22.242 | 18.663 |
| 15.260724919166666 | 22.355 | 22.252 | 18.671 |
| 15.267560009166665 | 22.365 | 22.249 | 18.673 |
| 15.27433398638886 | 22.368 | 22.257 | 18.681 |
| 15.281169055555555 | 22.368 | 22.249 | 18.671 |
| 15.287912493611111 | 22.375 | 22.242 | 18.666 |
| 15.294747565833333 | 22.355 | 22.259 | 18.65 |
| 15.301522936944444 | 22.352 | 22.27 | 18.663 |
| 15.308296900555556 | 22.36 | 22.252 | 18.658 |
| 15.31513198 | 22.368 | 22.257 | 18.645 |
| 15.321967064999999 | 22.378 | 22.267 | 18.658 |
| 15.328725768333305 | 22.363 | 22.259 | 18.66 |
| 15.335484465555556 | 22.368 | 22.249 | 18.648 |
| 15.342334824444444 | 22.36 | 22.254 | 18.64 |
| 15.34912408111111 | 22.368 | 22.259 | 18.642 |
| 15.355913333333334 | 22.383 | 22.257 | 18.658 |
| 15.362687314444445 | 22.365 | 22.254 | 18.66 |
| 15.369537661944445 | 22.373 | 22.252 | 18.66 |
| 15.376343584722221 | 22.373 | 22.259 | 18.663 |
| 15.383056465555557 | 22.375 | 22.249 | 18.684 |
| 15.389860980555556 | 22.363 | 22.249 | 18.648 |
| 15.396696066666665 | 22.373 | 22.259 | 18.679 |
| 15.403500587777778 | 22.37 | 22.262 | 18.668 |
| 15.410274571111112 | 22.373 | 22.257 | 18.668 |
| 15.417048574999999 | 22.36 | 22.254 | 18.66 |
| 15.4238683625 | 22.375 | 22.262 | 18.663 |
| 15.43067288111111 | 22.363 | 22.259 | 18.663 |
| 15.43746214111111 | 22.373 | 22.252 | 18.666 |
| 15.444222232222224 | 22.378 | 22.275 | 18.673 |
| 15.451103135 | 22.37 | 22.252 | 18.671 |
| 15.45780073416664 | 22.378 | 22.287 | 18.663 |
| 15.46468164388889 | 22.373 | 22.285 | 18.679 |
| 15.471455615555556 | 22.368 | 22.249 | 18.679 |
| 15.478229607777777 | 22.381 | 22.259 | 18.684 |
| 15.485049408888889 | 22.351 | 22.249 | 18.65 |
| 15.491823386944445 | 22.352 | 22.241 | 18.637 |
| 15.498627906111084 | 22.334 | 22.226 | 18.616 |
| 15.505403278055557 | 22.324 | 22.202 | 18.597 |
| 15.5122536325 | 22.31 | 22.194 | 18.616 |
| 15.519058175555555 | 22.334 | 22.207 | 18.616 |
| 15.5258168675 | 22.321 | 22.192 | 18.595 |
| 15.532606133055557 | 22.313 | 22.187 | 18.613 |
| 15.5394106475 | 22.318 | 22.197 | 18.603 |
| 15.546245739444446 | 22.316 | 22.197 | 18.605 |
| 15.553019701944445 | 22.305 | 22.197 | 18.592 |
| 15.559854781944445 | 22.308 | 22.2 | 18.605 |
| 15.566628765 | 22.31 | 22.194 | 18.616 |
| 15.573433310555556 | 22.323 | 22.225 | 18.6 |
| 15.580254476111111 | 22.344 | 22.202 | 18.61 |
| 15.586982636944445 | 22.333 | 22.207 | 18.603 |
| 15.593817718333334 | 22.31 | 22.212 | 18.608 |
| 15.600622239722222 | 22.305 | 22.212 | 18.621 |
| 15.607380941944443 | 22.316 | 22.2 | 18.603 |
| 15.614216034166667 | 22.321 | 22.202 | 18.621 |
| 15.620989995555556 | 22.321 | 22.187 | 18.592 |
| 15.62784035888889 | 22.323 | 22.189 | 18.605 |
| 15.634614342222223 | 22.326 | 22.21 | 18.597 |
| 15.641403586944444 | 22.318 | 22.212 | 18.61 |
| 15.648194243055556 | 22.316 | 22.212 | 18.608 |
| 15.654983483888888 | 22.323 | 22.194 | 18.618 |
| 15.661818565555528 | 22.303 | 22.205 | 18.6 |
| 15.668561985833334 | 22.313 | 22.225 | 18.61 |
| 15.675397073333334 | 22.305 | 22.225 | 18.61 |
| 15.682171049444444 | 22.326 | 22.228 | 18.6 |
| 15.689006129722221 | 22.341 | 22.212 | 18.597 |
| 15.695810656388888 | 22.341 | 22.205 | 18.605 |
| 15.702554091944446 | 22.318 | 22.223 | 18.605 |
| 15.709358604722222 | 22.339 | 22.202 | 18.618 |
| 15.716133983333334 | 22.318 | 22.2 | 18.603 |
| 15.722969059722223 | 22.303 | 22.199 | 18.613 |
| 15.729743042222223 | 22.318 | 22.168 | 18.589 |
| 15.736532295277778 | 22.279 | 22.166 | 18.573 |
| 15.74335209388889 | 22.274 | 22.15 | 18.568 |
| 15.750126078333306 | 22.251 | 22.145 | 18.565 |
| 15.756976425 | 22.256 | 22.163 | 18.547 |
| 15.763750406111111 | 22.266 | 22.155 | 18.563 |
| 15.770600762222195 | 22.266 | 22.135 | 18.555 |
| 15.77732891527775 | 22.256 | 22.165 | 18.563 |
| 15.784119554722222 | 22.269 | 22.158 | 18.563 |
| 15.790893531944445 | 22.269 | 22.142 | 18.576 |
| 15.797698058055555 | 22.263 | 22.17 | 18.56 |
| 15.804533250833334 | 22.261 | 22.181 | 18.532 |
| 15.811307119999999 | 22.263 | 22.16 | 18.545 |
| 15.818126929166667 | 22.266 | 22.158 | 18.55 |
| 15.824946734444444 | 22.266 | 22.155 | 18.555 |
| 15.831720710833334 | 22.276 | 22.165 | 18.54 |
| 15.838494685277777 | 22.284 | 22.145 | 18.553 |
| 15.845329769444444 | 22.276 | 22.165 | 18.563 |
| 15.852120415555556 | 22.263 | 22.145 | 18.55 |
| 15.858924939444446 | 22.279 | 22.153 | 18.553 |
| 15.865714191388887 | 22.271 | 22.155 | 18.558 |
| 15.872488163055555 | 22.286 | 22.165 | 18.565 |
| 15.879338518055556 | 22.266 | 22.165 | 18.565 |
| 15.886112494444443 | 22.274 | 22.176 | 18.571 |
| 15.892855939722194 | 22.276 | 22.15 | 18.558 |
| 15.89967573111111 | 22.271 | 22.165 | 18.576 |
| 15.906449714166667 | 22.271 | 22.16 | 18.558 |
| 15.913269508055528 | 22.261 | 22.176 | 18.571 |
| 15.9200601525 | 22.291 | 22.153 | 18.555 |
| 15.926864699722222 | 22.284 | 22.16 | 18.55 |
| 15.933638657222222 | 22.274 | 22.15 | 18.54 |
| 15.940443185555555 | 22.266 | 22.158 | 18.573 |
| 15.947263000000001 | 22.276 | 22.158 | 18.55 |
| 15.95403698027778 | 22.271 | 22.163 | 18.553 |
| 15.960856788333333 | 22.276 | 22.168 | 18.56 |
| 15.967676588055555 | 22.276 | 22.158 | 18.56 |
| 15.97446584138889 | 22.266 | 22.165 | 18.563 |
| 15.981300913611111 | 22.263 | 22.158 | 18.555 |
| 15.98807628027778 | 22.239 | 22.13 | 18.503 |
| 15.99485026722222 | 22.246 | 22.132 | 18.526 |
| 16.00163951861111 | 22.224 | 22.108 | 18.516 |
| 16.008459322500002 | 22.254 | 22.147 | 18.553 |
| 16.015233308333332 | 22.238 | 22.125 | 18.524 |
| 16.022007307777777 | 22.214 | 22.105 | 18.497 |
| 16.0288270825 | 22.196 | 22.108 | 18.523 |
| 16.03564689111111 | 22.216 | 22.121 | 18.508 |
| 16.04242086361111 | 22.224 | 22.105 | 18.477 |
| 16.049210134722223 | 22.209 | 22.108 | 18.49 |
| 16.056031311666665 | 22.201 | 22.116 | 18.495 |
| 16.062835841944445 | 22.221 | 22.1 | 18.484 |
| 16.06959453777778 | 22.221 | 22.092 | 18.49 |
| 16.07641434861111 | 22.196 | 22.1 | 18.479 |
| 16.083188328333332 | 22.219 | 22.108 | 18.469 |
| 16.089947026111112 | 22.219 | 22.118 | 18.508 |
| 16.096827931666667 | 22.209 | 22.111 | 18.502 |
| 16.10364772777778 | 22.221 | 22.121 | 18.495 |
| 16.110421713333334 | 22.221 | 22.085 | 18.5 |
| 16.117195707222223 | 22.219 | 22.126 | 18.505 |
| 16.124032158888888 | 22.209 | 22.118 | 18.495 |
| 16.130806136666667 | 22.224 | 22.087 | 18.487 |
| 16.137595384444445 | 22.221 | 22.118 | 18.487 |
| 16.14439992666664 | 22.216 | 22.103 | 18.492 |
| 16.151173916111112 | 22.219 | 22.118 | 18.502 |
| 16.158008985555558 | 22.219 | 22.113 | 18.497 |
| 16.164813511944445 | 22.232 | 22.111 | 18.495 |
| 16.171602757777748 | 22.209 | 22.113 | 18.482 |
| 16.178422565 | 22.227 | 22.128 | 18.482 |
| 16.185150714722223 | 22.206 | 22.09 | 18.484 |
| 16.191956630833307 | 22.239 | 22.126 | 18.502 |
| 16.198745890277777 | 22.237 | 22.111 | 18.513 |
| 16.20555041638886 | 22.224 | 22.103 | 18.502 |
| 16.21233967527778 | 22.229 | 22.118 | 18.492 |
| 16.219144203333332 | 22.224 | 22.108 | 18.482 |
| 16.225918175833307 | 22.227 | 22.116 | 18.497 |
| 16.232768528333335 | 22.214 | 22.111 | 18.497 |
| 16.239573055555557 | 22.209 | 22.108 | 18.477 |
| 16.2463470475 | 22.224 | 22.128 | 18.484 |
| 16.253121041388887 | 22.224 | 22.123 | 18.474 |
| 16.25991165527775 | 22.229 | 22.116 | 18.495 |
| 16.266762015277777 | 22.214 | 22.118 | 18.5 |
| 16.273566548888887 | 22.237 | 22.126 | 18.49 |
| 16.28034052083333 | 22.224 | 22.118 | 18.49 |
| 16.28711450388889 | 22.212 | 22.121 | 18.489 |
| 16.293888474166664 | 22.22 | 22.09 | 18.484 |
| 16.300754107499998 | 22.198 | 22.099 | 18.461 |
| 16.30751280861111 | 22.186 | 22.075 | 18.45 |
| 16.314286790833332 | 22.216 | 22.09 | 18.469 |
| 16.321121873888888 | 22.154 | 22.046 | 18.416 |
| 16.327897256944443 | 22.176 | 22.079 | 18.458 |
| 16.334671212499998 | 22.171 | 22.051 | 18.421 |
| 16.341475743611085 | 22.149 | 22.042 | 18.403 |
| 16.34831083111111 | 22.149 | 22.054 | 18.403 |
| 16.355100071944445 | 22.177 | 22.042 | 18.439 |
| 16.36191989138889 | 22.159 | 22.049 | 18.413 |
| 16.368709133611112 | 22.182 | 22.058 | 18.437 |
| 16.375483110833333 | 22.159 | 22.047 | 18.46 |
| 16.382318196944443 | 22.151 | 22.053 | 18.442 |
| 16.389046346388888 | 22.169 | 22.045 | 18.439 |
| 16.39586752388889 | 22.141 | 22.037 | 18.427 |
| 16.402656810555555 | 22.162 | 22.047 | 18.427 |
| 16.409461318055556 | 22.151 | 22.06 | 18.439 |
| 16.416250573611112 | 22.154 | 22.063 | 18.445 |
| 16.4230856525 | 22.154 | 22.05 | 18.411 |
| 16.429905450833335 | 22.159 | 22.05 | 18.437 |
| 16.43664888388889 | 22.164 | 22.053 | 18.429 |
| 16.443453402499998 | 22.172 | 22.035 | 18.442 |
| 16.450288501666666 | 22.162 | 22.027 | 18.445 |
| 16.457077793055557 | 22.157 | 22.047 | 18.427 |
| 16.46380733861111 | 22.162 | 22.029 | 18.447 |
| 16.470611808055555 | 22.167 | 22.058 | 18.424 |
| 16.477385784166668 | 22.167 | 22.042 | 18.437 |
| 16.484190345833333 | 22.159 | 22.068 | 18.424 |
| 16.491040670555527 | 22.159 | 22.032 | 18.439 |
| 16.497891025833304 | 22.162 | 22.055 | 18.427 |
| 16.504649725833332 | 22.157 | 22.055 | 18.419 |
| 16.5114389875 | 22.18 | 22.035 | 18.445 |
| 16.518228230833333 | 22.159 | 22.055 | 18.421 |
| 16.525048042222224 | 22.157 | 22.04 | 18.432 |
| 16.531823411666668 | 22.162 | 22.032 | 18.437 |
| 16.53865848611111 | 22.174 | 22.037 | 18.434 |
| 16.545432476944416 | 22.159 | 22.058 | 18.424 |
| 16.55222172361111 | 22.157 | 22.04 | 18.421 |
| 16.559010969166664 | 22.162 | 22.06 | 18.429 |
| 16.565830774444446 | 22.159 | 22.045 | 18.424 |
| 16.572589485833333 | 22.174 | 22.042 | 18.411 |
| 16.57940929861111 | 22.167 | 22.035 | 18.411 |
| 16.586183268333333 | 22.151 | 22.027 | 18.429 |
| 16.593018345833332 | 22.159 | 22.04 | 18.411 |
| 16.599868694166638 | 22.144 | 22.055 | 18.416 |
| 16.606582956944443 | 22.162 | 22.045 | 18.411 |
| 16.613356938611112 | 22.167 | 22.053 | 18.437 |
| 16.620130924166666 | 22.167 | 22.037 | 18.432 |
| 16.62696601888889 | 22.169 | 22.063 | 18.429 |
| 16.633770523888888 | 22.174 | 22.05 | 18.424 |
| 16.640544594722222 | 22.146 | 22.035 | 18.421 |
| 16.647425412222223 | 22.169 | 22.063 | 18.437 |
| 16.654184114444444 | 22.144 | 22.042 | 18.427 |
| 16.661003922777777 | 22.151 | 22.045 | 18.455 |
| 16.667764004722223 | 22.146 | 22.037 | 18.437 |
| 16.6745990875 | 22.162 | 22.042 | 18.411 |
| 16.68132724166667 | 22.167 | 22.035 | 18.421 |
| 16.6881470475 | 22.157 | 22.047 | 18.439 |
| 16.69498212972222 | 22.164 | 22.06 | 18.432 |
| 16.701771376944446 | 22.146 | 22.042 | 18.432 |
| 16.70854538777778 | 22.159 | 22.042 | 18.434 |
| 16.715334619166665 | 22.164 | 22.045 | 18.442 |
| 16.722108593055555 | 22.154 | 22.047 | 18.434 |
| 16.72891312249997 | 22.162 | 22.076 | 18.439 |
| 16.735749603611083 | 22.143 | 22.02 | 18.408 |
| 16.742569399444445 | 22.151 | 22.053 | 18.424 |
| 16.74934336833333 | 22.117 | 22.011 | 18.371 |
| 16.756163188333332 | 22.072 | 21.984 | 18.329 |
| 16.762967725833334 | 22.116 | 22.007 | 18.361 |
| 16.769726407222223 | 22.054 | 21.967 | 18.313 |
| 16.776561475277777 | 22.082 | 21.999 | 18.363 |
| 16.7833049125 | 22.098 | 21.97 | 18.366 |
| 16.790139992222223 | 22.065 | 21.969 | 18.329 |
| 16.79700561611111 | 22.094 | 21.974 | 18.364 |
| 16.803704611944447 | 22.08 | 21.984 | 18.369 |
| 16.81049386638889 | 22.094 | 21.972 | 18.356 |
| 16.817298394444443 | 22.084 | 21.987 | 18.364 |
| 16.824072377500002 | 22.086 | 21.969 | 18.374 |
| 16.830938032499972 | 22.099 | 21.982 | 18.376 |
| 16.83771198138889 | 22.089 | 21.977 | 18.369 |
| 16.844485967222223 | 22.079 | 21.969 | 18.366 |
| 16.85130576027778 | 22.094 | 21.979 | 18.361 |
| 16.858110293333333 | 22.084 | 21.984 | 18.361 |
| 16.864884268333334 | 22.084 | 21.977 | 18.358 |
| 16.871659631944443 | 22.084 | 21.964 | 18.353 |
| 16.878494716666665 | 22.094 | 21.977 | 18.356 |
| 16.88529926 | 22.081 | 21.964 | 18.351 |
| 16.892057946666664 | 22.089 | 21.982 | 18.356 |
| 16.898862497222222 | 22.094 | 21.984 | 18.366 |
| 16.905682291944444 | 22.081 | 21.969 | 18.356 |
| 16.912456255277778 | 22.107 | 21.969 | 18.353 |
| 16.91929137888889 | 22.115 | 21.964 | 18.353 |
| 16.926080597777776 | 22.094 | 21.982 | 18.369 |
| 16.932869836944445 | 22.086 | 21.984 | 18.356 |
| 16.939689736666665 | 22.099 | 21.969 | 18.353 |
| 16.94646501638889 | 22.066 | 21.992 | 18.376 |
| 16.95326954611111 | 22.091 | 21.982 | 18.374 |
| 16.96001297111111 | 22.094 | 21.966 | 18.374 |
| 16.9668327725 | 22.091 | 21.972 | 18.371 |
| 16.97363729972222 | 22.084 | 21.982 | 18.356 |
| 16.980380727222222 | 22.091 | 21.979 | 18.374 |
| 16.987261638333305 | 22.084 | 21.979 | 18.356 |
| 16.994066165 | 22.086 | 21.974 | 18.364 |
| 17.0008248675 | 22.076 | 21.966 | 18.371 |
| 17.00763079888889 | 22.086 | 21.984 | 18.34 |
| 17.01442004222222 | 22.081 | 21.982 | 18.361 |
| 17.021224572222224 | 22.104 | 21.972 | 18.343 |
| 17.02805965777775 | 22.081 | 21.966 | 18.361 |
| 17.03484890305553 | 22.089 | 21.966 | 18.358 |
| 17.04162288 | 22.073 | 21.961 | 18.356 |
| 17.048381584444446 | 22.079 | 21.964 | 18.351 |
| 17.055231944444444 | 22.079 | 21.966 | 18.364 |
| 17.062005915555556 | 22.076 | 21.969 | 18.364 |
| 17.06879517361111 | 22.066 | 21.979 | 18.351 |
| 17.07564553472222 | 22.089 | 21.979 | 18.361 |
| 17.082436168333306 | 22.073 | 21.964 | 18.366 |
| 17.089194872777778 | 22.089 | 21.972 | 18.348 |
| 17.095968845277778 | 22.081 | 21.966 | 18.371 |
| 17.10278864972222 | 22.099 | 21.972 | 18.361 |
| 17.109562645833332 | 22.071 | 21.961 | 18.361 |
| 17.116367154722223 | 22.076 | 21.959 | 18.374 |
| 17.123202235 | 22.097 | 21.969 | 18.361 |
| 17.129915124722224 | 22.056 | 21.978 | 18.358 |
| 17.13681129861111 | 22.025 | 21.921 | 18.308 |
| 17.143556112777777 | 22.058 | 21.942 | 18.356 |
| 17.150360633055556 | 22.037 | 21.932 | 18.327 |
| 17.1571346225 | 22.028 | 21.934 | 18.314 |
| 17.16398497138889 | 22.013 | 21.916 | 18.314 |
| 17.17080479138886 | 22.015 | 21.888 | 18.295 |
| 17.177578769166665 | 22.028 | 21.932 | 18.29 |
| 17.18438328222222 | 22.018 | 21.903 | 18.324 |
| 17.191187814166668 | 22.018 | 21.906 | 18.301 |
| 17.19794652138889 | 22.01 | 21.885 | 18.303 |
| 17.20481214333333 | 22.021 | 21.893 | 18.298 |
| 17.211526414722222 | 22.008 | 21.898 | 18.316 |
| 17.21833094055553 | 22.033 | 21.906 | 18.298 |
| 17.225104913611112 | 22.013 | 21.896 | 18.311 |
| 17.2319247275 | 22.028 | 21.914 | 18.306 |
| 17.238713980277776 | 22.021 | 21.916 | 18.285 |
| 17.245549054722222 | 22.018 | 21.906 | 18.29 |
| 17.25233833277778 | 22.008 | 21.896 | 18.293 |
| 17.25915810638886 | 22.021 | 21.908 | 18.301 |
| 17.265916812222223 | 22.003 | 21.924 | 18.319 |
| 17.27270607138886 | 22.008 | 21.916 | 18.308 |
| 17.279481453055556 | 22.013 | 21.903 | 18.311 |
| 17.28631651027778 | 22.031 | 21.906 | 18.308 |
| 17.293151591388888 | 22.033 | 21.89 | 18.301 |
| 17.29991030361111 | 22.01 | 21.916 | 18.324 |
| 17.306684280555555 | 22.026 | 21.901 | 18.303 |
| 17.313519371666665 | 22.003 | 21.896 | 18.326 |
| 17.320293337222193 | 22.015 | 21.908 | 18.293 |
| 17.327097866944445 | 21.995 | 21.901 | 18.321 |
| 17.333917666666668 | 22.026 | 21.906 | 18.298 |
| 17.340691638888888 | 22 | 21.896 | 18.308 |
| 17.34752672861111 | 22.015 | 21.906 | 18.316 |
| 17.354302086666667 | 22.021 | 21.906 | 18.308 |
| 17.361106615 | 22.008 | 21.896 | 18.308 |
| 17.367880598333333 | 22.015 | 21.906 | 18.308 |
| 17.374669850277776 | 21.992 | 21.885 | 18.308 |
| 17.381520206944444 | 22.013 | 21.89 | 18.319 |
| 17.38830955 | 22.018 | 21.908 | 18.321 |
| 17.39511400888889 | 22.018 | 21.883 | 18.337 |
| 17.401857416666665 | 22.005 | 21.903 | 18.342 |
| 17.408692495277776 | 22.028 | 21.911 | 18.311 |
| 17.415481748055527 | 22.026 | 21.893 | 18.324 |
| 17.422272388055553 | 22.028 | 21.903 | 18.319 |
| 17.42904638888889 | 21.997 | 21.906 | 18.326 |
| 17.43585089138889 | 22.013 | 21.911 | 18.319 |
| 17.442640155555527 | 22.028 | 21.893 | 18.326 |
| 17.44944467611111 | 22.018 | 21.898 | 18.329 |
| 17.456218657222223 | 22.015 | 21.896 | 18.319 |
| 17.46309956888889 | 22.021 | 21.896 | 18.329 |
| 17.469827721111084 | 22.021 | 21.875 | 18.337 |
| 17.476617004166666 | 21.997 | 21.893 | 18.321 |
| 17.483422885555555 | 22.005 | 21.89 | 18.324 |
| 17.49019687138886 | 22.009 | 21.902 | 18.355 |
| 17.497062496944444 | 22.022 | 21.905 | 18.352 |
| 17.503836471666666 | 21.995 | 21.898 | 18.332 |
| 17.510625734722222 | 22.023 | 21.898 | 18.379 |
| 17.517414996944446 | 22.029 | 21.903 | 18.405 |
| 17.524188956388887 | 22.04 | 21.915 | 18.415 |
| 17.531054591944443 | 22.038 | 21.905 | 18.4 |
| 17.537828564999998 | 22.026 | 21.879 | 18.4 |
| 17.544602551944415 | 22.012 | 21.897 | 18.374 |
| 17.551391799999998 | 22.031 | 21.907 | 18.405 |
| 17.55816716138889 | 22.014 | 21.881 | 18.371 |
| 17.56494114611111 | 21.979 | 21.865 | 18.305 |
| 17.57186788222222 | 22.013 | 21.883 | 18.384 |
| 17.5785808525 | 21.99 | 21.864 | 18.34 |
| 17.585385288333335 | 21.991 | 21.859 | 18.316 |
| 17.592205083611113 | 21.957 | 21.85 | 18.328 |
| 17.59902489888889 | 21.963 | 21.822 | 18.302 |
| 17.605768334166665 | 21.951 | 21.819 | 18.326 |
| 17.612603390833332 | 21.963 | 21.828 | 18.3 |
| 17.619392648055555 | 21.967 | 21.834 | 18.321 |
| 17.62616802527775 | 21.954 | 21.85 | 18.318 |
| 17.633018368333307 | 21.932 | 21.827 | 18.297 |
| 17.63979235 | 21.947 | 21.82 | 18.284 |
| 17.646551049166668 | 21.94 | 21.815 | 18.284 |
| 17.653355577777777 | 21.942 | 21.815 | 18.3 |
| 17.660144835833304 | 21.942 | 21.827 | 18.302 |
| 17.666979925555527 | 21.934 | 21.812 | 18.274 |
| 17.6737844475 | 21.945 | 21.83 | 18.315 |
| 17.680588969166667 | 21.929 | 21.82 | 18.3 |
| 17.687347679444418 | 21.919 | 21.825 | 18.294 |
| 17.694107768333335 | 21.919 | 21.822 | 18.31 |
| 17.700942846944443 | 21.932 | 21.812 | 18.287 |
| 17.70774737083333 | 21.932 | 21.827 | 18.3 |
| 17.71452136083333 | 21.919 | 21.815 | 18.307 |
| 17.721325887499972 | 21.937 | 21.84 | 18.3 |
| 17.728160963333334 | 21.94 | 21.82 | 18.287 |
| 17.73496550361111 | 21.937 | 21.807 | 18.281 |
| 17.74173947 | 21.927 | 21.812 | 18.287 |
| 17.74851345611111 | 21.921 | 21.794 | 18.305 |
| 17.75528880638889 | 21.921 | 21.825 | 18.281 |
| 17.76213916361111 | 21.911 | 21.82 | 18.281 |
| 17.76891315416667 | 21.927 | 21.812 | 18.3 |
| 17.77574822111111 | 21.919 | 21.804 | 18.292 |
| 17.782522206666666 | 21.924 | 21.82 | 18.281 |
| 17.78932675638886 | 21.916 | 21.799 | 18.305 |
| 17.796100710277777 | 21.916 | 21.802 | 18.312 |
| 17.802874686111082 | 21.916 | 21.804 | 18.305 |
| 17.809679215 | 21.914 | 21.799 | 18.33 |
| 17.81645320333333 | 21.921 | 21.809 | 18.305 |
| 17.82328828083333 | 21.929 | 21.807 | 18.312 |
| 17.830078918055555 | 21.893 | 21.796 | 18.33 |
| 17.836868185833332 | 21.924 | 21.809 | 18.325 |
| 17.84370324972222 | 21.903 | 21.807 | 18.307 |
| 17.85047723388889 | 21.901 | 21.789 | 18.305 |
| 17.85726658333333 | 21.898 | 21.799 | 18.297 |
| 17.86408628222222 | 21.896 | 21.815 | 18.307 |
| 17.87086026472222 | 21.906 | 21.807 | 18.307 |
| 17.87766479472222 | 21.901 | 21.799 | 18.292 |
| 17.884469330555557 | 21.911 | 21.778 | 18.284 |
| 17.89125858861111 | 21.911 | 21.799 | 18.289 |
| 17.898049234722222 | 21.919 | 21.809 | 18.294 |
| 17.904869023333333 | 21.898 | 21.778 | 18.318 |
| 17.91165828222222 | 21.901 | 21.799 | 18.307 |
| 17.918432250833334 | 21.885 | 21.771 | 18.289 |
| 17.925282621666668 | 21.901 | 21.791 | 18.307 |
| 17.932087167499972 | 21.906 | 21.791 | 18.312 |
| 17.9388611125 | 21.909 | 21.778 | 18.302 |
| 17.945635181666667 | 21.88 | 21.781 | 18.305 |
| 17.952409075277778 | 21.906 | 21.789 | 18.315 |
| 17.9592441575 | 21.893 | 21.778 | 18.315 |
| 17.966019518333304 | 21.911 | 21.786 | 18.3 |
| 17.97286988833333 | 21.896 | 21.776 | 18.307 |
| 17.979674406111112 | 21.885 | 21.768 | 18.31 |
| 17.986448383055556 | 21.88 | 21.781 | 18.307 |
| 17.993268194444415 | 21.89 | 21.781 | 18.31 |
| 17.99999633611111 | 21.893 | 21.784 | 18.302 |
| 18.00680086611111 | 21.898 | 21.778 | 18.297 |
| 18.013635942500002 | 21.885 | 21.781 | 18.315 |
| 18.02039464916667 | 21.888 | 21.765 | 18.333 |
| 18.027260290277777 | 21.86 | 21.765 | 18.297 |
| 18.034035650555555 | 21.885 | 21.778 | 18.294 |
| 18.040840174166668 | 21.88 | 21.771 | 18.315 |
| 18.04761425222222 | 21.88 | 21.768 | 18.305 |
| 18.054388141111083 | 21.885 | 21.781 | 18.32 |
| 18.061192669999972 | 21.865 | 21.771 | 18.315 |
| 18.0680125275 | 21.87 | 21.765 | 18.33 |
| 18.07478644111111 | 21.885 | 21.773 | 18.336 |
| 18.08156042138889 | 21.883 | 21.776 | 18.32 |
| 18.088380223333306 | 21.87 | 21.781 | 18.328 |
| 18.095184750555557 | 21.88 | 21.755 | 18.33 |
| 18.10209621027778 | 21.87 | 21.773 | 18.328 |
| 18.108795200833306 | 21.883 | 21.773 | 18.313 |
| 18.11559974388889 | 21.86 | 21.753 | 18.315 |
| 18.122373705277777 | 21.86 | 21.768 | 18.341 |
| 18.12914767777778 | 21.87 | 21.727 | 18.323 |
| 18.1359981375 | 21.875 | 21.755 | 18.354 |
| 18.14274146777778 | 21.896 | 21.796 | 18.365 |
| 18.149576576944444 | 21.892 | 21.765 | 18.37 |
| 18.156365800555555 | 21.928 | 21.797 | 18.422 |
| 18.16313977749997 | 21.89 | 21.792 | 18.393 |
| 18.169960980555526 | 21.91 | 21.792 | 18.394 |
| 18.176734951944443 | 21.915 | 21.797 | 18.428 |
| 18.18353947361111 | 21.89 | 21.774 | 18.393 |
| 18.190313449999973 | 21.905 | 21.797 | 18.448 |
| 18.19717908861111 | 21.949 | 21.817 | 18.444 |
| 18.203953061944446 | 21.928 | 21.82 | 18.456 |
| 18.210727042499975 | 21.944 | 21.809 | 18.467 |
| 18.217516302499998 | 21.923 | 21.802 | 18.462 |
| 18.224305555 | 21.938 | 21.807 | 18.464 |
| 18.23117118277778 | 21.933 | 21.791 | 18.459 |
| 18.23794655305553 | 21.92 | 21.807 | 18.449 |
| 18.244720544166668 | 21.926 | 21.789 | 18.462 |
| 18.25150977194442 | 21.91 | 21.789 | 18.456 |
| 18.25828374888889 | 21.92 | 21.802 | 18.446 |
| 18.265073005 | 21.936 | 21.807 | 18.451 |
| 18.271877540277778 | 21.91 | 21.791 | 18.472 |
| 18.278697339166666 | 21.918 | 21.799 | 18.446 |
| 18.28551715055553 | 21.9 | 21.789 | 18.469 |
| 18.292291121944444 | 21.91 | 21.799 | 18.477 |
| 18.29912620472222 | 21.905 | 21.786 | 18.441 |
| 18.305932123888887 | 21.91 | 21.786 | 18.475 |
| 18.31272145055553 | 21.92 | 21.794 | 18.459 |
| 18.31949535361111 | 21.9 | 21.781 | 18.454 |
| 18.326284609166667 | 21.902 | 21.784 | 18.451 |
| 18.333073860833306 | 21.892 | 21.802 | 18.441 |
| 18.33989365888889 | 21.91 | 21.784 | 18.454 |
| 18.346667642222222 | 21.901 | 21.776 | 18.449 |
| 18.35348744527775 | 21.914 | 21.791 | 18.456 |
| 18.360261417777778 | 21.882 | 21.772 | 18.428 |
| 18.367096505277775 | 21.879 | 21.774 | 18.436 |
| 18.373902431111112 | 21.869 | 21.763 | 18.427 |
| 18.38073749277775 | 21.863 | 21.774 | 18.401 |
| 18.387511481111083 | 21.887 | 21.758 | 18.433 |
| 18.394239625 | 21.868 | 21.756 | 18.422 |
| 18.401059435833332 | 21.871 | 21.756 | 18.419 |
| 18.40787924027778 | 21.861 | 21.754 | 18.401 |
| 18.414725451111085 | 21.848 | 21.767 | 18.404 |
| 18.42145774277775 | 21.871 | 21.746 | 18.404 |
| 18.428231725555527 | 21.858 | 21.736 | 18.386 |
| 18.43502097444442 | 21.861 | 21.749 | 18.399 |
| 18.441857448333334 | 21.85 | 21.743 | 18.406 |
| 18.448677251388887 | 21.858 | 21.736 | 18.401 |
| 18.45543595527778 | 21.858 | 21.728 | 18.417 |
| 18.46227103111111 | 21.832 | 21.736 | 18.409 |
| 18.469045017499973 | 21.848 | 21.723 | 18.404 |
| 18.47581899277778 | 21.832 | 21.741 | 18.399 |
| 18.48259297722222 | 21.868 | 21.72 | 18.401 |
| 18.489489151944444 | 21.832 | 21.712 | 18.406 |
| 18.496217295833308 | 21.832 | 21.718 | 18.419 |
| 18.503037195833333 | 21.858 | 21.72 | 18.401 |
| 18.509843041666667 | 21.832 | 21.718 | 18.391 |
| 18.516632276944417 | 21.83 | 21.71 | 18.401 |
| 18.52339097833333 | 21.822 | 21.707 | 18.406 |
| 18.530226070833333 | 21.827 | 21.712 | 18.391 |
| 18.537000045833334 | 21.837 | 21.733 | 18.409 |
| 18.543835117222198 | 21.812 | 21.697 | 18.391 |
| 18.550624365555556 | 21.814 | 21.707 | 18.388 |
| 18.557413624444443 | 21.835 | 21.707 | 18.414 |
| 18.564187591944446 | 21.854 | 21.737 | 18.459 |
| 18.5709615775 | 21.831 | 21.722 | 18.446 |
| 18.577798048055556 | 21.875 | 21.762 | 18.509 |
| 18.584602573333306 | 21.863 | 21.747 | 18.469 |
| 18.591391829444447 | 21.903 | 21.75 | 18.48 |
| 18.598226907222223 | 21.927 | 21.767 | 18.519 |
| 18.60503144722222 | 21.867 | 21.739 | 18.501 |
| 18.61179013916664 | 21.884 | 21.764 | 18.519 |
| 18.61859467111111 | 21.896 | 21.767 | 18.532 |
| 18.625368640833305 | 21.875 | 21.767 | 18.54 |
| 18.6321426475 | 21.88 | 21.764 | 18.522 |
| 18.63893187777775 | 21.883 | 21.743 | 18.525 |
| 18.645783621944446 | 21.885 | 21.746 | 18.537 |
| 18.652572874999972 | 21.883 | 21.759 | 18.53 |
| 18.659362125833333 | 21.885 | 21.756 | 18.525 |
| 18.66615138722222 | 21.87 | 21.767 | 18.535 |
| 18.67294064666664 | 21.875 | 21.754 | 18.543 |
| 18.67974515722222 | 21.878 | 21.754 | 18.548 |
| 18.686595521111084 | 21.88 | 21.749 | 18.535 |
| 18.69336950888889 | 21.873 | 21.746 | 18.522 |
| 18.70020457972222 | 21.867 | 21.736 | 18.527 |
| 18.706948001666667 | 21.871 | 21.751 | 18.522 |
| 18.713723375277777 | 21.858 | 21.764 | 18.543 |
| 18.720527896944446 | 21.846 | 21.721 | 18.469 |
| 18.727378249444417 | 21.845 | 21.728 | 18.48 |
| 18.734106419166665 | 21.836 | 21.716 | 18.477 |
| 18.74092621055553 | 21.837 | 21.718 | 18.493 |
| 18.747684912222194 | 21.828 | 21.714 | 18.464 |
| 18.754535271944416 | 21.828 | 21.711 | 18.462 |
| 18.761309246666666 | 21.818 | 21.701 | 18.475 |
| 18.768144331388864 | 21.821 | 21.698 | 18.475 |
| 18.774918340833306 | 21.831 | 21.701 | 18.469 |
| 18.781693677777778 | 21.836 | 21.716 | 18.464 |
| 18.788467645833336 | 21.821 | 21.703 | 18.475 |
| 18.795333285833305 | 21.808 | 21.698 | 18.485 |
| 18.802107267222198 | 21.831 | 21.701 | 18.469 |
| 18.808881231944444 | 21.808 | 21.711 | 18.464 |
| 18.815655208611084 | 21.808 | 21.706 | 18.446 |
| 18.822429192777776 | 21.81 | 21.693 | 18.464 |
| 18.82931009472222 | 21.813 | 21.677 | 18.446 |
| 18.836084074444443 | 21.818 | 21.688 | 18.462 |
| 18.842858056944443 | 21.787 | 21.685 | 18.451 |
| 18.849663985833335 | 21.792 | 21.696 | 18.475 |
| 18.856437951388862 | 21.797 | 21.665 | 18.467 |
| 18.863288320555558 | 21.805 | 21.68 | 18.48 |
| 18.87009282888886 | 21.805 | 21.68 | 18.501 |
| 18.87686681083333 | 21.787 | 21.675 | 18.467 |
| 18.88364079388889 | 21.797 | 21.68 | 18.48 |
| 18.890460631666667 | 21.835 | 21.709 | 18.545 |
| 18.897280399166664 | 21.797 | 21.68 | 18.498 |
| 18.90405438083331 | 21.86 | 21.717 | 18.546 |
| 18.91088946027778 | 21.847 | 21.699 | 18.59 |
| 18.917664819166667 | 21.863 | 21.737 | 18.608 |
| 18.924469345833334 | 21.871 | 21.737 | 18.59 |
| 18.931273878333332 | 21.874 | 21.747 | 18.6 |
| 18.93809368166667 | 21.849 | 21.713 | 18.592 |
| 18.944821841666666 | 21.858 | 21.737 | 18.611 |
| 18.95162637083333 | 21.848 | 21.742 | 18.585 |
| 18.958415624722196 | 21.853 | 21.724 | 18.613 |
| 18.965220164166638 | 21.848 | 21.714 | 18.606 |
| 18.972055285 | 21.858 | 21.734 | 18.585 |
| 18.97882923055553 | 21.856 | 21.727 | 18.58 |
| 18.985635128055556 | 21.845 | 21.719 | 18.603 |
| 18.992439656944445 | 21.866 | 21.708 | 18.6 |
| 18.99921363444442 | 21.832 | 21.716 | 18.595 |
| 19.006018163888886 | 21.834 | 21.703 | 18.585 |
| 19.012792136111084 | 21.84 | 21.706 | 18.606 |
| 19.01959666138889 | 21.831 | 21.705 | 18.577 |
| 19.02643174388889 | 21.836 | 21.706 | 18.598 |
| 19.033220994999976 | 21.819 | 21.708 | 18.569 |
| 19.04007136805553 | 21.81 | 21.699 | 18.574 |
| 19.046799507222197 | 21.818 | 21.69 | 18.546 |
| 19.05366513527778 | 21.806 | 21.679 | 18.54 |
| 19.06036411972222 | 21.804 | 21.691 | 18.532 |
| 19.067168660555556 | 21.801 | 21.694 | 18.548 |
| 19.07398846638889 | 21.798 | 21.661 | 18.55 |
| 19.080762433611085 | 21.796 | 21.679 | 18.543 |
| 19.08758224611111 | 21.816 | 21.676 | 18.537 |
| 19.09435621472222 | 21.798 | 21.661 | 18.537 |
| 19.101252406944443 | 21.798 | 21.668 | 18.54 |
| 19.10798057222222 | 21.809 | 21.681 | 18.55 |
| 19.11475454027778 | 21.788 | 21.679 | 18.543 |
| 19.121529915833307 | 21.798 | 21.666 | 18.548 |
| 19.12833442555553 | 21.793 | 21.663 | 18.543 |
| 19.135169505 | 21.804 | 21.661 | 18.553 |
| 19.141943479166667 | 21.788 | 21.668 | 18.548 |
| 19.148732735 | 21.811 | 21.655 | 18.545 |
| 19.155583095833332 | 21.801 | 21.645 | 18.545 |
| 19.16244878527778 | 21.788 | 21.65 | 18.553 |
| 19.169222696111085 | 21.767 | 21.648 | 18.537 |
| 19.17595084888889 | 21.78 | 21.642 | 18.558 |
| 19.182740100277776 | 21.778 | 21.663 | 18.563 |
| 19.189559913888864 | 21.77 | 21.637 | 18.55 |
| 19.19636582361111 | 21.778 | 21.635 | 18.556 |
| 19.20313980888889 | 21.775 | 21.645 | 18.54 |
| 19.20991380027778 | 21.775 | 21.648 | 18.553 |
| 19.21671832638889 | 21.773 | 21.642 | 18.563 |
| 19.22353811638889 | 21.759 | 21.647 | 18.579 |
| 19.230312090555554 | 21.812 | 21.677 | 18.647 |
| 19.237101346666666 | 21.812 | 21.672 | 18.639 |
| 19.243905875833335 | 21.838 | 21.687 | 18.647 |
| 19.25067992138889 | 21.825 | 21.677 | 18.663 |
| 19.257501049444443 | 21.822 | 21.697 | 18.655 |
| 19.26433613027778 | 21.828 | 21.699 | 18.663 |
| 19.27112537888889 | 21.828 | 21.702 | 18.697 |
| 19.277838254444443 | 21.841 | 21.689 | 18.684 |
| 19.284719159722222 | 21.818 | 21.694 | 18.713 |
| 19.29149316333333 | 21.823 | 21.702 | 18.7 |
| 19.298267137777778 | 21.849 | 21.676 | 18.702 |
| 19.305071644444446 | 21.836 | 21.684 | 18.705 |
| 19.311906731944443 | 21.826 | 21.689 | 18.71 |
| 19.318680702222224 | 21.834 | 21.661 | 18.705 |
| 19.325471349999997 | 21.819 | 21.689 | 18.738 |
| 19.332306433611112 | 21.823 | 21.666 | 18.738 |
| 19.33908040388886 | 21.81 | 21.677 | 18.74 |
| 19.345930763055556 | 21.831 | 21.654 | 18.751 |
| 19.352704750555557 | 21.817 | 21.675 | 18.753 |
| 19.35943288694442 | 21.829 | 21.666 | 18.735 |
| 19.366252701666667 | 21.794 | 21.654 | 18.722 |
| 19.37305722416667 | 21.797 | 21.654 | 18.735 |
| 19.379846475 | 21.797 | 21.651 | 18.748 |
| 19.386650996666667 | 21.792 | 21.659 | 18.74 |
| 19.393455525833335 | 21.789 | 21.631 | 18.737 |
| 19.400261453333332 | 21.8 | 21.649 | 18.732 |
| 19.407096527499974 | 21.792 | 21.644 | 18.742 |
| 19.413870516944442 | 21.774 | 21.628 | 18.766 |
| 19.420659763055554 | 21.784 | 21.623 | 18.755 |
| 19.427510118055554 | 21.787 | 21.626 | 18.748 |
| 19.43425356722222 | 21.769 | 21.628 | 18.755 |
| 19.44101225416667 | 21.776 | 21.615 | 18.748 |
| 19.44778624416664 | 21.763 | 21.62 | 18.763 |
| 19.454667127499974 | 21.761 | 21.62 | 18.75 |
| 19.461441111944445 | 21.782 | 21.631 | 18.729 |
| 19.468216474722198 | 21.798 | 21.635 | 18.805 |
| 19.47499047166667 | 21.805 | 21.648 | 18.826 |
| 19.48179497611111 | 21.809 | 21.649 | 18.834 |
| 19.488630068611112 | 21.831 | 21.682 | 18.907 |
| 19.495404032499973 | 21.86 | 21.69 | 18.961 |
| 19.50217803472222 | 21.859 | 21.68 | 18.938 |
| 19.509028394444442 | 21.873 | 21.685 | 19.003 |
| 19.515817632222223 | 21.884 | 21.688 | 18.99 |
| 19.522683253055554 | 21.868 | 21.685 | 19.018 |
| 19.529457245555555 | 21.881 | 21.68 | 19.036 |
| 19.53618677888889 | 21.899 | 21.677 | 19.057 |
| 19.542960764166665 | 21.876 | 21.685 | 19.09 |
| 19.54982638166664 | 21.873 | 21.667 | 19.108 |
| 19.55652398361111 | 21.858 | 21.664 | 19.106 |
| 19.563450732499998 | 21.868 | 21.682 | 19.121 |
| 19.57017887166664 | 21.858 | 21.675 | 19.144 |
| 19.576952846388888 | 21.881 | 21.672 | 19.147 |
| 19.583772656388888 | 21.86 | 21.66 | 19.17 |
| 19.590546633888888 | 21.829 | 21.647 | 19.159 |
| 19.59735254611111 | 21.843 | 21.664 | 19.164 |
| 19.60420290388889 | 21.834 | 21.647 | 19.172 |
| 19.610976879444443 | 21.847 | 21.642 | 19.203 |
| 19.617766133611084 | 21.829 | 21.629 | 19.192 |
| 19.62454010916664 | 21.837 | 21.658 | 19.234 |
| 19.63134465222222 | 21.811 | 21.64 | 19.254 |
| 19.638149176666666 | 21.814 | 21.64 | 19.311 |
| 19.64498425027775 | 21.826 | 21.639 | 19.332 |
| 19.65175823416664 | 21.878 | 21.686 | 19.419 |
| 19.658562748888887 | 21.903 | 21.722 | 19.45 |
| 19.665307591388864 | 21.89 | 21.696 | 19.46 |
| 19.67211212277778 | 21.89 | 21.714 | 19.483 |
| 19.67894718638889 | 21.89 | 21.689 | 19.491 |
| 19.685705914166668 | 21.877 | 21.684 | 19.501 |
| 19.69249513833333 | 21.864 | 21.668 | 19.512 |
| 19.699269167222194 | 21.88 | 21.658 | 19.522 |
| 19.706150026388887 | 21.849 | 21.668 | 19.538 |
| 19.712954548611112 | 21.862 | 21.665 | 19.548 |
| 19.71969809 | 21.856 | 21.653 | 19.54 |
| 19.7265330575 | 21.86 | 21.665 | 19.561 |
| 19.73342923972222 | 21.848 | 21.624 | 19.563 |
| 19.74012822972222 | 21.836 | 21.631 | 19.534 |
| 19.74690221388889 | 21.839 | 21.658 | 19.589 |
| 19.753737281944417 | 21.882 | 21.692 | 19.68 |
| 19.760511260277777 | 21.909 | 21.713 | 19.704 |
| 19.767331084444447 | 21.891 | 21.692 | 19.673 |
| 19.774105049999974 | 21.883 | 21.69 | 19.691 |
| 19.780924848333306 | 21.891 | 21.669 | 19.714 |
| 19.787668280833334 | 21.876 | 21.669 | 19.732 |
| 19.794503354444444 | 21.876 | 21.656 | 19.74 |
| 19.801307883333333 | 21.873 | 21.664 | 19.763 |
| 19.808083257777778 | 21.842 | 21.641 | 19.761 |
| 19.814918330277777 | 21.873 | 21.664 | 19.789 |
| 19.82170758416664 | 21.855 | 21.647 | 19.799 |
| 19.82851211138889 | 21.928 | 21.7 | 20.048 |
| 19.83528609805553 | 21.919 | 21.687 | 20.04 |
| 19.842075339444417 | 21.892 | 21.691 | 20.025 |
| 19.84884932222222 | 21.903 | 21.688 | 20.1 |
| 19.85565385333331 | 21.91 | 21.706 | 20.146 |
| 19.862427829999998 | 21.897 | 21.694 | 20.138 |
| 19.869232359444442 | 21.908 | 21.688 | 20.125 |
| 19.876068825277777 | 21.897 | 21.67 | 20.151 |
| 19.88287335611111 | 21.892 | 21.701 | 20.159 |
| 19.889662609166667 | 21.89 | 21.691 | 20.223 |
| 19.896436596388888 | 21.877 | 21.683 | 20.265 |
| 19.903210572777777 | 21.899 | 21.7 | 20.247 |
| 19.91001510111111 | 21.963 | 21.74 | 20.308 |
| 19.916865447777777 | 21.927 | 21.733 | 20.287 |
| 19.9236547075 | 21.937 | 21.7 | 20.289 |
| 19.930459232499974 | 21.901 | 21.702 | 20.23 |
| 19.937233222499998 | 21.919 | 21.687 | 20.245 |
| 19.94402386638889 | 21.901 | 21.679 | 20.243 |
| 19.950858930555555 | 21.873 | 21.679 | 20.253 |
| 19.95764818916664 | 21.888 | 21.679 | 20.271 |
| 19.964452720833332 | 21.94 | 21.731 | 20.35 |
| 19.971180873888887 | 21.963 | 21.748 | 20.407 |
| 19.97800066416664 | 21.941 | 21.724 | 20.394 |
| 19.984835747777776 | 21.92 | 21.716 | 20.357 |
| 19.991640280555558 | 21.926 | 21.719 | 20.357 |
| 19.998414272777776 | 21.895 | 21.709 | 20.38 |
| 20.00518822861111 | 21.918 | 21.734 | 20.37 |
| 20.01197888277778 | 21.895 | 21.709 | 20.36 |
| 20.018783414166666 | 21.96 | 21.748 | 20.441 |
| 20.025633756944444 | 21.98 | 21.772 | 20.489 |
| 20.032407737499973 | 21.977 | 21.764 | 20.491 |
| 20.039196999444417 | 21.953 | 21.754 | 20.467 |
| 20.045970981666667 | 21.911 | 21.725 | 20.454 |
| 20.052790779722194 | 21.934 | 21.72 | 20.426 |
| 20.059595307777776 | 21.927 | 21.71 | 20.475 |
| 20.066384555555555 | 21.977 | 21.775 | 20.546 |
| 20.073158537777775 | 21.997 | 21.786 | 20.601 |
| 20.079995001388887 | 21.999 | 21.786 | 20.601 |
| 20.086799532777754 | 21.997 | 21.786 | 20.668 |
| 20.093573533333334 | 21.968 | 21.777 | 20.639 |
| 20.1003474925 | 21.925 | 21.732 | 20.576 |
| 20.107167300833332 | 21.925 | 21.737 | 20.548 |
| 20.11392599361111 | 21.955 | 21.767 | 20.564 |
| 20.1207610775 | 22.018 | 21.808 | 20.697 |
| 20.12750450361111 | 22.006 | 21.808 | 20.692 |
| 20.134370137777776 | 22.026 | 21.8 | 20.715 |
| 20.14117468 | 22.003 | 21.777 | 20.718 |
| 20.147950030555556 | 21.982 | 21.75 | 20.702 |
| 20.15473928666667 | 21.955 | 21.733 | 20.66 |
| 20.16151326805553 | 21.969 | 21.747 | 20.691 |